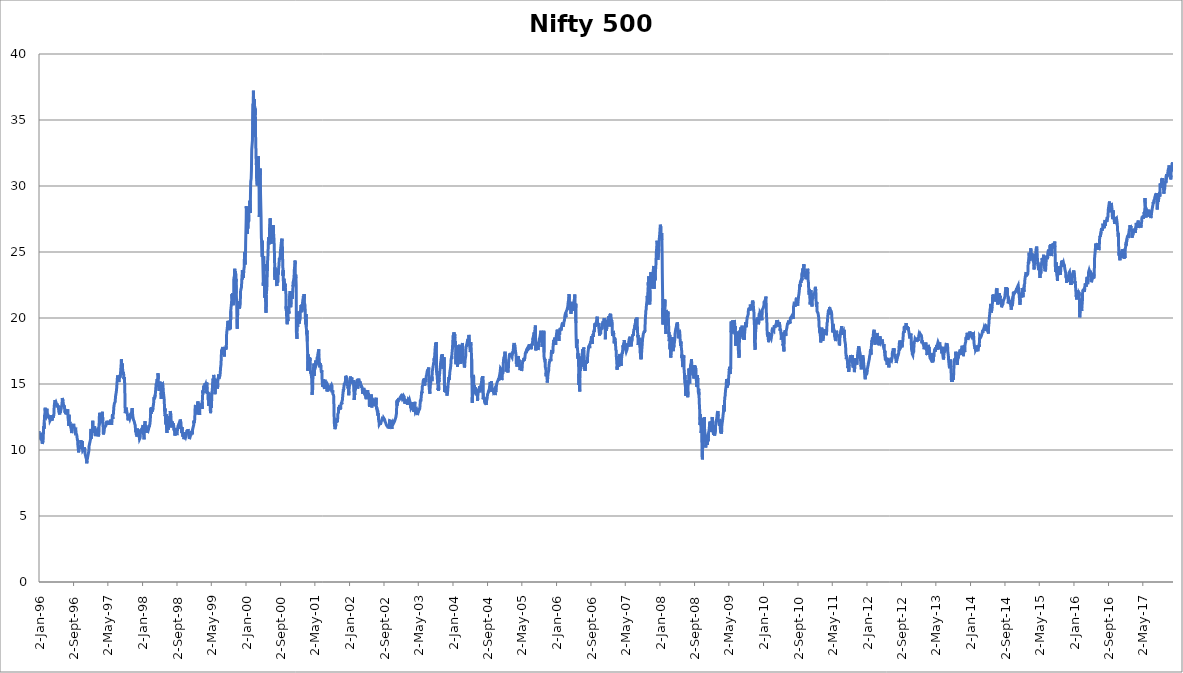
| Category | Nifty 500 P/E |
|---|---|
| 1996-01-02 | 11.43 |
| 1996-01-03 | 11.37 |
| 1996-01-04 | 11.3 |
| 1996-01-05 | 11.23 |
| 1996-01-08 | 11.07 |
| 1996-01-09 | 11.01 |
| 1996-01-10 | 10.98 |
| 1996-01-11 | 11.03 |
| 1996-01-12 | 11.05 |
| 1996-01-15 | 11.06 |
| 1996-01-16 | 11.03 |
| 1996-01-17 | 10.9 |
| 1996-01-18 | 10.81 |
| 1996-01-19 | 10.75 |
| 1996-01-22 | 10.74 |
| 1996-01-23 | 10.64 |
| 1996-01-24 | 10.47 |
| 1996-01-25 | 10.45 |
| 1996-01-29 | 10.54 |
| 1996-01-30 | 10.67 |
| 1996-01-31 | 10.7 |
| 1996-02-01 | 10.98 |
| 1996-02-02 | 11.52 |
| 1996-02-05 | 11.8 |
| 1996-02-06 | 11.61 |
| 1996-02-07 | 11.64 |
| 1996-02-08 | 12.07 |
| 1996-02-09 | 12.56 |
| 1996-02-12 | 12.76 |
| 1996-02-13 | 12.92 |
| 1996-02-14 | 13.2 |
| 1996-02-15 | 13.13 |
| 1996-02-16 | 12.93 |
| 1996-02-19 | 12.97 |
| 1996-02-20 | 12.84 |
| 1996-02-22 | 12.99 |
| 1996-02-23 | 12.97 |
| 1996-02-26 | 13.13 |
| 1996-02-27 | 13.08 |
| 1996-02-28 | 12.86 |
| 1996-02-29 | 12.61 |
| 1996-03-01 | 12.63 |
| 1996-03-04 | 12.69 |
| 1996-03-06 | 12.74 |
| 1996-03-07 | 12.68 |
| 1996-03-08 | 12.6 |
| 1996-03-11 | 12.41 |
| 1996-03-12 | 12.36 |
| 1996-03-13 | 12.53 |
| 1996-03-14 | 12.56 |
| 1996-03-15 | 12.47 |
| 1996-03-18 | 12.33 |
| 1996-03-19 | 12.22 |
| 1996-03-21 | 12.29 |
| 1996-03-22 | 12.22 |
| 1996-03-25 | 12.22 |
| 1996-03-26 | 12.22 |
| 1996-03-27 | 12.39 |
| 1996-03-29 | 12.64 |
| 1996-04-02 | 12.24 |
| 1996-04-03 | 12.3 |
| 1996-04-04 | 12.27 |
| 1996-04-05 | 12.39 |
| 1996-04-08 | 12.53 |
| 1996-04-09 | 12.51 |
| 1996-04-10 | 12.44 |
| 1996-04-11 | 12.4 |
| 1996-04-12 | 12.47 |
| 1996-04-15 | 12.66 |
| 1996-04-16 | 12.77 |
| 1996-04-17 | 13.11 |
| 1996-04-18 | 13.34 |
| 1996-04-22 | 13.3 |
| 1996-04-23 | 13.3 |
| 1996-04-24 | 13.78 |
| 1996-04-25 | 13.75 |
| 1996-04-26 | 13.54 |
| 1996-04-30 | 13.63 |
| 1996-05-02 | 13.67 |
| 1996-05-03 | 13.54 |
| 1996-05-06 | 13.34 |
| 1996-05-08 | 13.51 |
| 1996-05-09 | 13.32 |
| 1996-05-10 | 13.23 |
| 1996-05-13 | 13.35 |
| 1996-05-14 | 13.26 |
| 1996-05-15 | 13.25 |
| 1996-05-16 | 13.37 |
| 1996-05-17 | 13.23 |
| 1996-05-20 | 12.98 |
| 1996-05-21 | 12.86 |
| 1996-05-22 | 12.87 |
| 1996-05-23 | 12.83 |
| 1996-05-24 | 12.88 |
| 1996-05-27 | 12.69 |
| 1996-05-28 | 12.62 |
| 1996-05-29 | 12.94 |
| 1996-05-30 | 12.83 |
| 1996-05-31 | 12.79 |
| 1996-06-03 | 12.99 |
| 1996-06-04 | 12.96 |
| 1996-06-05 | 13 |
| 1996-06-06 | 13.11 |
| 1996-06-07 | 13.24 |
| 1996-06-10 | 13.36 |
| 1996-06-11 | 13.39 |
| 1996-06-12 | 13.52 |
| 1996-06-13 | 13.68 |
| 1996-06-14 | 13.94 |
| 1996-06-17 | 14 |
| 1996-06-18 | 13.98 |
| 1996-06-19 | 13.73 |
| 1996-06-20 | 13.72 |
| 1996-06-21 | 13.5 |
| 1996-06-24 | 13.54 |
| 1996-06-25 | 13.36 |
| 1996-06-26 | 13.24 |
| 1996-06-27 | 13.36 |
| 1996-06-28 | 13.3 |
| 1996-07-01 | 13.12 |
| 1996-07-02 | 13.05 |
| 1996-07-03 | 12.82 |
| 1996-07-04 | 12.88 |
| 1996-07-05 | 12.93 |
| 1996-07-08 | 12.99 |
| 1996-07-09 | 12.73 |
| 1996-07-10 | 12.78 |
| 1996-07-11 | 12.87 |
| 1996-07-12 | 12.79 |
| 1996-07-15 | 12.82 |
| 1996-07-16 | 12.7 |
| 1996-07-17 | 12.87 |
| 1996-07-18 | 12.94 |
| 1996-07-19 | 12.92 |
| 1996-07-22 | 13.09 |
| 1996-07-23 | 12.69 |
| 1996-07-24 | 12.49 |
| 1996-07-25 | 12.43 |
| 1996-07-26 | 12.3 |
| 1996-07-29 | 12.03 |
| 1996-07-30 | 11.83 |
| 1996-07-31 | 12.67 |
| 1996-08-01 | 12.14 |
| 1996-08-02 | 12.07 |
| 1996-08-05 | 12.02 |
| 1996-08-06 | 11.99 |
| 1996-08-07 | 12.12 |
| 1996-08-08 | 12.05 |
| 1996-08-09 | 12.02 |
| 1996-08-12 | 11.9 |
| 1996-08-13 | 11.83 |
| 1996-08-14 | 11.72 |
| 1996-08-16 | 11.57 |
| 1996-08-19 | 11.28 |
| 1996-08-20 | 11.28 |
| 1996-08-21 | 11.5 |
| 1996-08-22 | 11.55 |
| 1996-08-23 | 11.67 |
| 1996-08-26 | 11.67 |
| 1996-08-27 | 11.69 |
| 1996-08-29 | 11.87 |
| 1996-08-30 | 11.87 |
| 1996-09-02 | 11.98 |
| 1996-09-03 | 11.82 |
| 1996-09-04 | 11.86 |
| 1996-09-06 | 11.87 |
| 1996-09-09 | 11.75 |
| 1996-09-10 | 11.63 |
| 1996-09-11 | 11.49 |
| 1996-09-12 | 11.48 |
| 1996-09-13 | 11.36 |
| 1996-09-18 | 11.44 |
| 1996-09-19 | 11.29 |
| 1996-09-20 | 11.26 |
| 1996-09-23 | 11.17 |
| 1996-09-24 | 11.15 |
| 1996-09-25 | 11.14 |
| 1996-09-26 | 11.01 |
| 1996-09-27 | 10.85 |
| 1996-09-30 | 10.73 |
| 1996-10-01 | 10.47 |
| 1996-10-03 | 10.41 |
| 1996-10-04 | 10.16 |
| 1996-10-07 | 9.82 |
| 1996-10-08 | 9.84 |
| 1996-10-09 | 9.89 |
| 1996-10-10 | 10.2 |
| 1996-10-11 | 10.34 |
| 1996-10-14 | 10.15 |
| 1996-10-15 | 10.15 |
| 1996-10-16 | 10.12 |
| 1996-10-17 | 10.12 |
| 1996-10-18 | 10.22 |
| 1996-10-22 | 10.22 |
| 1996-10-23 | 10.75 |
| 1996-10-24 | 10.53 |
| 1996-10-25 | 10.51 |
| 1996-10-28 | 10.53 |
| 1996-10-29 | 10.44 |
| 1996-10-30 | 10.28 |
| 1996-10-31 | 10.22 |
| 1996-11-01 | 10.68 |
| 1996-11-04 | 10.02 |
| 1996-11-05 | 9.93 |
| 1996-11-06 | 9.93 |
| 1996-11-07 | 9.98 |
| 1996-11-10 | 9.96 |
| 1996-11-13 | 10.04 |
| 1996-11-14 | 10.03 |
| 1996-11-15 | 10.08 |
| 1996-11-18 | 10.2 |
| 1996-11-19 | 10.14 |
| 1996-11-20 | 9.97 |
| 1996-11-21 | 9.9 |
| 1996-11-22 | 9.71 |
| 1996-11-25 | 9.74 |
| 1996-11-26 | 9.66 |
| 1996-11-27 | 9.47 |
| 1996-11-28 | 9.44 |
| 1996-11-29 | 9.4 |
| 1996-12-02 | 9.27 |
| 1996-12-03 | 9.12 |
| 1996-12-04 | 8.99 |
| 1996-12-05 | 9.16 |
| 1996-12-06 | 9.23 |
| 1996-12-09 | 9.21 |
| 1996-12-10 | 9.19 |
| 1996-12-11 | 9.11 |
| 1996-12-12 | 9.57 |
| 1996-12-13 | 9.59 |
| 1996-12-16 | 9.59 |
| 1996-12-17 | 9.85 |
| 1996-12-18 | 9.94 |
| 1996-12-19 | 10.03 |
| 1996-12-20 | 10.3 |
| 1996-12-23 | 10.31 |
| 1996-12-24 | 10.31 |
| 1997-01-01 | 10.91 |
| 1997-01-02 | 11.6 |
| 1997-01-03 | 10.87 |
| 1997-01-06 | 10.97 |
| 1997-01-07 | 10.98 |
| 1997-01-08 | 11.22 |
| 1997-01-09 | 11.25 |
| 1997-01-10 | 11.46 |
| 1997-01-13 | 11.61 |
| 1997-01-14 | 11.72 |
| 1997-01-15 | 12.22 |
| 1997-01-16 | 11.71 |
| 1997-01-17 | 11.49 |
| 1997-01-20 | 11.37 |
| 1997-01-21 | 11.29 |
| 1997-01-22 | 11.4 |
| 1997-01-24 | 11.39 |
| 1997-01-27 | 11.72 |
| 1997-01-28 | 11.8 |
| 1997-01-29 | 11.64 |
| 1997-01-30 | 11.56 |
| 1997-01-31 | 11.2 |
| 1997-02-03 | 11.05 |
| 1997-02-04 | 11.01 |
| 1997-02-05 | 11.12 |
| 1997-02-06 | 11.21 |
| 1997-02-07 | 11.22 |
| 1997-02-10 | 11.25 |
| 1997-02-11 | 11.48 |
| 1997-02-12 | 11.45 |
| 1997-02-13 | 11.49 |
| 1997-02-14 | 11.52 |
| 1997-02-17 | 11.56 |
| 1997-02-18 | 11.54 |
| 1997-02-19 | 11.51 |
| 1997-02-20 | 11.44 |
| 1997-02-21 | 11.26 |
| 1997-02-24 | 11.03 |
| 1997-02-25 | 11.01 |
| 1997-02-26 | 11.04 |
| 1997-02-27 | 11.24 |
| 1997-02-28 | 11.88 |
| 1997-03-01 | 12.03 |
| 1997-03-03 | 12.67 |
| 1997-03-04 | 12.82 |
| 1997-03-05 | 12.84 |
| 1997-03-06 | 12.65 |
| 1997-03-10 | 12.35 |
| 1997-03-11 | 12.19 |
| 1997-03-12 | 12.3 |
| 1997-03-13 | 12.27 |
| 1997-03-14 | 12.19 |
| 1997-03-17 | 12.27 |
| 1997-03-18 | 12.25 |
| 1997-03-19 | 12.08 |
| 1997-03-20 | 12.16 |
| 1997-03-21 | 12.18 |
| 1997-03-25 | 12.89 |
| 1997-03-26 | 12.22 |
| 1997-03-27 | 12.23 |
| 1997-03-28 | 12.07 |
| 1997-03-31 | 11.18 |
| 1997-04-01 | 11.35 |
| 1997-04-02 | 11.72 |
| 1997-04-03 | 11.79 |
| 1997-04-04 | 11.73 |
| 1997-04-07 | 11.62 |
| 1997-04-09 | 11.85 |
| 1997-04-10 | 11.73 |
| 1997-04-11 | 11.79 |
| 1997-04-12 | 11.67 |
| 1997-04-15 | 11.71 |
| 1997-04-17 | 11.84 |
| 1997-04-21 | 12.11 |
| 1997-04-22 | 12.11 |
| 1997-04-23 | 12.08 |
| 1997-04-24 | 12.01 |
| 1997-04-25 | 12.21 |
| 1997-04-28 | 12.09 |
| 1997-04-29 | 12.05 |
| 1997-04-30 | 12.15 |
| 1997-05-02 | 12.01 |
| 1997-05-05 | 11.9 |
| 1997-05-06 | 12.01 |
| 1997-05-07 | 11.97 |
| 1997-05-09 | 12.01 |
| 1997-05-12 | 12.04 |
| 1997-05-13 | 11.98 |
| 1997-05-14 | 12.11 |
| 1997-05-15 | 12.14 |
| 1997-05-16 | 12.04 |
| 1997-05-19 | 12.21 |
| 1997-05-20 | 12.19 |
| 1997-05-21 | 12.3 |
| 1997-05-22 | 12.11 |
| 1997-05-23 | 12.04 |
| 1997-05-26 | 11.99 |
| 1997-05-27 | 11.93 |
| 1997-05-28 | 11.91 |
| 1997-05-29 | 11.99 |
| 1997-05-30 | 12.11 |
| 1997-06-02 | 12.04 |
| 1997-06-03 | 12.71 |
| 1997-06-04 | 12.78 |
| 1997-06-05 | 12.35 |
| 1997-06-06 | 12.65 |
| 1997-06-09 | 12.66 |
| 1997-06-10 | 12.74 |
| 1997-06-11 | 12.94 |
| 1997-06-12 | 13.19 |
| 1997-06-13 | 13.27 |
| 1997-06-16 | 13.31 |
| 1997-06-17 | 13.55 |
| 1997-06-18 | 13.57 |
| 1997-06-19 | 13.57 |
| 1997-06-20 | 13.58 |
| 1997-06-23 | 13.67 |
| 1997-06-24 | 14.02 |
| 1997-06-25 | 13.98 |
| 1997-06-26 | 14.01 |
| 1997-06-27 | 14 |
| 1997-06-30 | 14.4 |
| 1997-07-01 | 14.48 |
| 1997-07-02 | 14.6 |
| 1997-07-03 | 14.55 |
| 1997-07-04 | 14.55 |
| 1997-07-07 | 14.59 |
| 1997-07-08 | 14.67 |
| 1997-07-09 | 15.65 |
| 1997-07-10 | 15.65 |
| 1997-07-11 | 15.72 |
| 1997-07-14 | 15.46 |
| 1997-07-15 | 15.45 |
| 1997-07-16 | 15.38 |
| 1997-07-17 | 15.4 |
| 1997-07-18 | 15.16 |
| 1997-07-21 | 15.26 |
| 1997-07-22 | 15.42 |
| 1997-07-23 | 15.67 |
| 1997-07-24 | 15.63 |
| 1997-07-25 | 15.48 |
| 1997-07-28 | 15.54 |
| 1997-07-29 | 15.71 |
| 1997-07-30 | 15.78 |
| 1997-07-31 | 16 |
| 1997-08-01 | 16.14 |
| 1997-08-04 | 16.6 |
| 1997-08-05 | 16.88 |
| 1997-08-06 | 16.77 |
| 1997-08-07 | 16.5 |
| 1997-08-08 | 16.29 |
| 1997-08-11 | 16.55 |
| 1997-08-12 | 16.47 |
| 1997-08-13 | 16.28 |
| 1997-08-14 | 16.1 |
| 1997-08-19 | 15.68 |
| 1997-08-20 | 15.88 |
| 1997-08-21 | 15.7 |
| 1997-08-22 | 15.37 |
| 1997-08-26 | 15.53 |
| 1997-08-27 | 15.53 |
| 1997-08-28 | 15.07 |
| 1997-08-29 | 14.71 |
| 1997-09-01 | 12.79 |
| 1997-09-02 | 12.8 |
| 1997-09-03 | 12.85 |
| 1997-09-04 | 12.95 |
| 1997-09-05 | 13 |
| 1997-09-08 | 13.21 |
| 1997-09-09 | 13.08 |
| 1997-09-10 | 13.1 |
| 1997-09-11 | 13 |
| 1997-09-12 | 12.92 |
| 1997-09-15 | 12.96 |
| 1997-09-16 | 12.92 |
| 1997-09-17 | 12.69 |
| 1997-09-18 | 12.56 |
| 1997-09-19 | 12.38 |
| 1997-09-22 | 12.25 |
| 1997-09-23 | 12.36 |
| 1997-09-24 | 12.5 |
| 1997-09-25 | 12.37 |
| 1997-09-26 | 12.59 |
| 1997-09-29 | 12.61 |
| 1997-09-30 | 12.52 |
| 1997-10-01 | 12.53 |
| 1997-10-03 | 12.36 |
| 1997-10-06 | 12.39 |
| 1997-10-07 | 12.51 |
| 1997-10-08 | 12.56 |
| 1997-10-09 | 12.69 |
| 1997-10-10 | 12.81 |
| 1997-10-13 | 12.86 |
| 1997-10-14 | 12.71 |
| 1997-10-15 | 12.77 |
| 1997-10-16 | 12.89 |
| 1997-10-17 | 12.99 |
| 1997-10-20 | 13.17 |
| 1997-10-21 | 13.05 |
| 1997-10-22 | 12.96 |
| 1997-10-23 | 12.77 |
| 1997-10-24 | 12.58 |
| 1997-10-27 | 12.54 |
| 1997-10-30 | 12.26 |
| 1997-11-03 | 12.18 |
| 1997-11-04 | 12.18 |
| 1997-11-05 | 12.1 |
| 1997-11-06 | 12.04 |
| 1997-11-07 | 11.98 |
| 1997-11-10 | 11.9 |
| 1997-11-11 | 11.88 |
| 1997-11-12 | 11.66 |
| 1997-11-13 | 11.4 |
| 1997-11-14 | 11.39 |
| 1997-11-17 | 11.43 |
| 1997-11-18 | 11.27 |
| 1997-11-19 | 11.12 |
| 1997-11-20 | 11.16 |
| 1997-11-21 | 11.31 |
| 1997-11-24 | 11.02 |
| 1997-11-25 | 11.2 |
| 1997-11-26 | 11.38 |
| 1997-11-27 | 11.63 |
| 1997-11-28 | 11.42 |
| 1997-12-01 | 11.55 |
| 1997-12-02 | 11.51 |
| 1997-12-03 | 11.53 |
| 1997-12-04 | 11.41 |
| 1997-12-05 | 11.23 |
| 1997-12-08 | 11.21 |
| 1997-12-09 | 11.02 |
| 1997-12-10 | 10.91 |
| 1997-12-11 | 10.82 |
| 1997-12-12 | 10.81 |
| 1997-12-15 | 10.91 |
| 1997-12-16 | 11.06 |
| 1997-12-17 | 11.24 |
| 1997-12-18 | 11.21 |
| 1997-12-19 | 11.36 |
| 1997-12-22 | 11.39 |
| 1997-12-23 | 11.44 |
| 1997-12-24 | 11.38 |
| 1997-12-26 | 11.44 |
| 1997-12-29 | 11.65 |
| 1997-12-30 | 11.49 |
| 1997-12-31 | 11.53 |
| 1998-01-01 | 11.68 |
| 1998-01-02 | 11.78 |
| 1998-01-05 | 11.88 |
| 1998-01-06 | 11.79 |
| 1998-01-07 | 11.7 |
| 1998-01-08 | 11.44 |
| 1998-01-09 | 11.15 |
| 1998-01-12 | 10.81 |
| 1998-01-13 | 10.91 |
| 1998-01-14 | 10.85 |
| 1998-01-15 | 11.89 |
| 1998-01-16 | 11.94 |
| 1998-01-19 | 12.18 |
| 1998-01-20 | 12.08 |
| 1998-01-21 | 11.98 |
| 1998-01-22 | 11.84 |
| 1998-01-23 | 11.73 |
| 1998-01-27 | 11.49 |
| 1998-01-28 | 11.31 |
| 1998-01-29 | 11.29 |
| 1998-02-02 | 11.72 |
| 1998-02-03 | 11.68 |
| 1998-02-04 | 11.57 |
| 1998-02-05 | 11.64 |
| 1998-02-06 | 11.62 |
| 1998-02-09 | 11.56 |
| 1998-02-10 | 11.47 |
| 1998-02-11 | 11.41 |
| 1998-02-12 | 11.42 |
| 1998-02-13 | 11.58 |
| 1998-02-16 | 11.87 |
| 1998-02-17 | 11.75 |
| 1998-02-18 | 11.73 |
| 1998-02-19 | 11.84 |
| 1998-02-20 | 11.8 |
| 1998-02-23 | 12.01 |
| 1998-02-24 | 12.03 |
| 1998-02-26 | 12.46 |
| 1998-02-27 | 12.66 |
| 1998-03-02 | 13.2 |
| 1998-03-03 | 12.75 |
| 1998-03-04 | 13.08 |
| 1998-03-05 | 12.97 |
| 1998-03-06 | 12.94 |
| 1998-03-09 | 13.25 |
| 1998-03-10 | 13.19 |
| 1998-03-11 | 13.03 |
| 1998-03-12 | 12.92 |
| 1998-03-16 | 13.2 |
| 1998-03-17 | 13.21 |
| 1998-03-18 | 13.37 |
| 1998-03-19 | 13.38 |
| 1998-03-20 | 13.46 |
| 1998-03-23 | 14 |
| 1998-03-24 | 13.93 |
| 1998-03-25 | 14.07 |
| 1998-03-26 | 13.85 |
| 1998-03-27 | 13.91 |
| 1998-03-30 | 13.91 |
| 1998-03-31 | 13.85 |
| 1998-04-01 | 14.18 |
| 1998-04-02 | 14.23 |
| 1998-04-03 | 14.4 |
| 1998-04-06 | 14.82 |
| 1998-04-07 | 14.98 |
| 1998-04-08 | 15.02 |
| 1998-04-10 | 15.08 |
| 1998-04-13 | 14.84 |
| 1998-04-15 | 15.38 |
| 1998-04-16 | 15.13 |
| 1998-04-17 | 15.27 |
| 1998-04-20 | 15.48 |
| 1998-04-21 | 15.81 |
| 1998-04-22 | 15.37 |
| 1998-04-23 | 15.02 |
| 1998-04-24 | 14.76 |
| 1998-04-27 | 14.87 |
| 1998-04-29 | 14.47 |
| 1998-04-30 | 14.65 |
| 1998-05-04 | 15.18 |
| 1998-05-05 | 15.25 |
| 1998-05-06 | 14.93 |
| 1998-05-08 | 14.75 |
| 1998-05-12 | 14.49 |
| 1998-05-13 | 13.87 |
| 1998-05-14 | 14.32 |
| 1998-05-15 | 14.15 |
| 1998-05-18 | 14.75 |
| 1998-05-19 | 14.87 |
| 1998-05-20 | 15.11 |
| 1998-05-21 | 14.83 |
| 1998-05-22 | 14.79 |
| 1998-05-25 | 14.91 |
| 1998-05-26 | 14.83 |
| 1998-05-27 | 14.62 |
| 1998-05-28 | 14.44 |
| 1998-05-29 | 14.32 |
| 1998-06-01 | 14.32 |
| 1998-06-02 | 13.94 |
| 1998-06-03 | 13.93 |
| 1998-06-04 | 13.76 |
| 1998-06-05 | 13.15 |
| 1998-06-08 | 12.93 |
| 1998-06-09 | 13.14 |
| 1998-06-10 | 12.56 |
| 1998-06-11 | 12.65 |
| 1998-06-12 | 12.71 |
| 1998-06-15 | 12.02 |
| 1998-06-16 | 11.93 |
| 1998-06-17 | 12.71 |
| 1998-06-18 | 12.37 |
| 1998-06-19 | 11.83 |
| 1998-06-22 | 11.42 |
| 1998-06-23 | 11.29 |
| 1998-06-24 | 11.74 |
| 1998-06-25 | 11.95 |
| 1998-06-26 | 11.87 |
| 1998-06-29 | 12.33 |
| 1998-06-30 | 12.2 |
| 1998-07-01 | 12.04 |
| 1998-07-02 | 11.89 |
| 1998-07-03 | 11.55 |
| 1998-07-06 | 11.88 |
| 1998-07-07 | 12.01 |
| 1998-07-08 | 12.16 |
| 1998-07-09 | 12.37 |
| 1998-07-10 | 12.56 |
| 1998-07-13 | 12.4 |
| 1998-07-14 | 12.55 |
| 1998-07-15 | 12.58 |
| 1998-07-16 | 12.95 |
| 1998-07-17 | 12.88 |
| 1998-07-20 | 12.64 |
| 1998-07-21 | 12.53 |
| 1998-07-22 | 12.49 |
| 1998-07-23 | 12.1 |
| 1998-07-24 | 11.92 |
| 1998-07-27 | 11.71 |
| 1998-07-28 | 11.99 |
| 1998-07-29 | 12.16 |
| 1998-07-30 | 12.16 |
| 1998-07-31 | 12.15 |
| 1998-08-03 | 11.92 |
| 1998-08-04 | 11.91 |
| 1998-08-05 | 12.02 |
| 1998-08-06 | 11.95 |
| 1998-08-07 | 11.93 |
| 1998-08-10 | 11.81 |
| 1998-08-11 | 11.66 |
| 1998-08-12 | 11.55 |
| 1998-08-13 | 11.66 |
| 1998-08-14 | 11.44 |
| 1998-08-17 | 11.31 |
| 1998-08-18 | 11.09 |
| 1998-08-19 | 11.21 |
| 1998-08-20 | 11.54 |
| 1998-08-21 | 11.4 |
| 1998-08-24 | 11.46 |
| 1998-08-25 | 11.62 |
| 1998-08-27 | 11.65 |
| 1998-08-28 | 11.38 |
| 1998-08-31 | 11.42 |
| 1998-09-01 | 11.13 |
| 1998-09-02 | 11.25 |
| 1998-09-03 | 11.3 |
| 1998-09-04 | 11.44 |
| 1998-09-07 | 11.68 |
| 1998-09-08 | 11.79 |
| 1998-09-09 | 11.85 |
| 1998-09-10 | 11.84 |
| 1998-09-11 | 11.72 |
| 1998-09-14 | 11.96 |
| 1998-09-15 | 11.99 |
| 1998-09-16 | 11.96 |
| 1998-09-17 | 11.94 |
| 1998-09-18 | 11.87 |
| 1998-09-21 | 11.86 |
| 1998-09-22 | 11.86 |
| 1998-09-23 | 12.06 |
| 1998-09-24 | 12.31 |
| 1998-09-25 | 12.32 |
| 1998-09-28 | 12.3 |
| 1998-09-29 | 12.05 |
| 1998-09-30 | 12.07 |
| 1998-10-05 | 11.28 |
| 1998-10-06 | 11.35 |
| 1998-10-07 | 11.73 |
| 1998-10-08 | 11.39 |
| 1998-10-09 | 11.44 |
| 1998-10-12 | 11.24 |
| 1998-10-13 | 11.01 |
| 1998-10-14 | 11.28 |
| 1998-10-15 | 11.21 |
| 1998-10-16 | 11.22 |
| 1998-10-19 | 11.11 |
| 1998-10-20 | 10.82 |
| 1998-10-22 | 10.9 |
| 1998-10-23 | 10.93 |
| 1998-10-26 | 11.36 |
| 1998-10-27 | 11.33 |
| 1998-10-28 | 11.19 |
| 1998-10-29 | 11.2 |
| 1998-10-30 | 11.07 |
| 1998-10-31 | 11.04 |
| 1998-11-02 | 10.99 |
| 1998-11-03 | 10.94 |
| 1998-11-05 | 11.04 |
| 1998-11-06 | 11.14 |
| 1998-11-09 | 11.4 |
| 1998-11-10 | 11.47 |
| 1998-11-11 | 11.44 |
| 1998-11-12 | 11.5 |
| 1998-11-13 | 11.42 |
| 1998-11-16 | 11.3 |
| 1998-11-17 | 11.38 |
| 1998-11-18 | 11.59 |
| 1998-11-19 | 11.48 |
| 1998-11-20 | 11.4 |
| 1998-11-21 | 11.4 |
| 1998-11-23 | 11.26 |
| 1998-11-24 | 11.19 |
| 1998-11-26 | 10.97 |
| 1998-11-27 | 10.83 |
| 1998-11-28 | 10.81 |
| 1998-11-30 | 10.9 |
| 1998-12-01 | 10.88 |
| 1998-12-02 | 10.95 |
| 1998-12-03 | 10.91 |
| 1998-12-04 | 11.02 |
| 1998-12-07 | 11.22 |
| 1998-12-08 | 11.29 |
| 1998-12-09 | 11.32 |
| 1998-12-10 | 11.38 |
| 1998-12-11 | 11.45 |
| 1998-12-14 | 11.36 |
| 1998-12-15 | 11.36 |
| 1998-12-16 | 11.44 |
| 1998-12-17 | 11.19 |
| 1998-12-18 | 11.26 |
| 1998-12-21 | 11.58 |
| 1998-12-22 | 11.53 |
| 1998-12-23 | 11.57 |
| 1998-12-24 | 11.6 |
| 1998-12-28 | 11.88 |
| 1998-12-29 | 11.84 |
| 1998-12-30 | 12.23 |
| 1998-12-31 | 12.04 |
| 1999-01-01 | 12.14 |
| 1999-01-04 | 12.26 |
| 1999-01-05 | 12.4 |
| 1999-01-06 | 12.69 |
| 1999-01-07 | 12.95 |
| 1999-01-08 | 13.33 |
| 1999-01-11 | 13.41 |
| 1999-01-12 | 13.15 |
| 1999-01-13 | 13.2 |
| 1999-01-14 | 13.14 |
| 1999-01-15 | 12.88 |
| 1999-01-18 | 12.97 |
| 1999-01-19 | 12.7 |
| 1999-01-21 | 13.4 |
| 1999-01-22 | 13.33 |
| 1999-01-25 | 13.27 |
| 1999-01-27 | 13.67 |
| 1999-01-28 | 13.4 |
| 1999-01-29 | 13.47 |
| 1999-02-01 | 13.1 |
| 1999-02-02 | 12.9 |
| 1999-02-03 | 13.13 |
| 1999-02-04 | 12.95 |
| 1999-02-05 | 12.89 |
| 1999-02-08 | 12.66 |
| 1999-02-09 | 12.74 |
| 1999-02-10 | 13.19 |
| 1999-02-11 | 13.24 |
| 1999-02-12 | 13.39 |
| 1999-02-15 | 13.2 |
| 1999-02-16 | 13.31 |
| 1999-02-17 | 13.53 |
| 1999-02-18 | 13.56 |
| 1999-02-19 | 13.57 |
| 1999-02-22 | 13.22 |
| 1999-02-23 | 13.12 |
| 1999-02-24 | 13.31 |
| 1999-02-25 | 13.29 |
| 1999-02-26 | 13.13 |
| 1999-02-27 | 13.66 |
| 1999-03-01 | 14.07 |
| 1999-03-03 | 14.51 |
| 1999-03-04 | 14.3 |
| 1999-03-05 | 14.47 |
| 1999-03-08 | 14.61 |
| 1999-03-09 | 14.68 |
| 1999-03-10 | 14.87 |
| 1999-03-11 | 14.56 |
| 1999-03-12 | 14.77 |
| 1999-03-15 | 14.85 |
| 1999-03-16 | 14.65 |
| 1999-03-17 | 14.77 |
| 1999-03-18 | 15.05 |
| 1999-03-19 | 14.88 |
| 1999-03-20 | 14.89 |
| 1999-03-22 | 14.94 |
| 1999-03-23 | 14.99 |
| 1999-03-24 | 14.95 |
| 1999-03-25 | 14.87 |
| 1999-03-26 | 14.6 |
| 1999-03-30 | 14.68 |
| 1999-03-31 | 15.11 |
| 1999-04-01 | 15 |
| 1999-04-05 | 14.25 |
| 1999-04-06 | 14.29 |
| 1999-04-07 | 14.4 |
| 1999-04-08 | 14.25 |
| 1999-04-09 | 13.84 |
| 1999-04-12 | 13.84 |
| 1999-04-13 | 13.73 |
| 1999-04-15 | 13.33 |
| 1999-04-16 | 14.34 |
| 1999-04-17 | 13.33 |
| 1999-04-19 | 13.67 |
| 1999-04-20 | 13.7 |
| 1999-04-21 | 13.81 |
| 1999-04-22 | 13.58 |
| 1999-04-23 | 13.55 |
| 1999-04-26 | 12.79 |
| 1999-04-28 | 12.95 |
| 1999-04-29 | 13.29 |
| 1999-04-30 | 13.55 |
| 1999-05-03 | 13.21 |
| 1999-05-04 | 13.74 |
| 1999-05-05 | 13.96 |
| 1999-05-06 | 14.22 |
| 1999-05-07 | 14.41 |
| 1999-05-10 | 14.77 |
| 1999-05-11 | 14.99 |
| 1999-05-12 | 14.79 |
| 1999-05-13 | 15.22 |
| 1999-05-14 | 15.41 |
| 1999-05-17 | 15.19 |
| 1999-05-18 | 15.31 |
| 1999-05-19 | 15.69 |
| 1999-05-20 | 15.59 |
| 1999-05-21 | 15.29 |
| 1999-05-24 | 15.31 |
| 1999-05-25 | 15.41 |
| 1999-05-26 | 14.92 |
| 1999-05-27 | 14.46 |
| 1999-05-28 | 14.23 |
| 1999-05-31 | 14.85 |
| 1999-06-01 | 14.71 |
| 1999-06-02 | 14.79 |
| 1999-06-03 | 14.95 |
| 1999-06-04 | 15.14 |
| 1999-06-07 | 15.15 |
| 1999-06-08 | 15.39 |
| 1999-06-09 | 15.27 |
| 1999-06-10 | 15.31 |
| 1999-06-11 | 15.06 |
| 1999-06-14 | 14.81 |
| 1999-06-15 | 14.65 |
| 1999-06-16 | 14.98 |
| 1999-06-17 | 15.25 |
| 1999-06-18 | 15.21 |
| 1999-06-21 | 15.55 |
| 1999-06-22 | 15.72 |
| 1999-06-23 | 15.51 |
| 1999-06-24 | 15.38 |
| 1999-06-25 | 15.37 |
| 1999-06-28 | 15.55 |
| 1999-06-29 | 15.55 |
| 1999-06-30 | 15.52 |
| 1999-07-01 | 15.48 |
| 1999-07-02 | 15.63 |
| 1999-07-05 | 16.04 |
| 1999-07-06 | 16.22 |
| 1999-07-07 | 16.28 |
| 1999-07-08 | 16.27 |
| 1999-07-09 | 16.48 |
| 1999-07-12 | 17.29 |
| 1999-07-13 | 17.32 |
| 1999-07-14 | 17.6 |
| 1999-07-15 | 17.26 |
| 1999-07-16 | 17.4 |
| 1999-07-19 | 17.74 |
| 1999-07-20 | 17.33 |
| 1999-07-21 | 17.67 |
| 1999-07-22 | 17.81 |
| 1999-07-23 | 17.66 |
| 1999-07-26 | 17.52 |
| 1999-07-27 | 17.37 |
| 1999-07-28 | 17.55 |
| 1999-07-29 | 17.53 |
| 1999-07-30 | 17.39 |
| 1999-08-02 | 17.08 |
| 1999-08-03 | 17.14 |
| 1999-08-04 | 17.66 |
| 1999-08-05 | 17.59 |
| 1999-08-06 | 17.59 |
| 1999-08-09 | 17.8 |
| 1999-08-10 | 17.63 |
| 1999-08-11 | 17.75 |
| 1999-08-12 | 17.78 |
| 1999-08-13 | 17.62 |
| 1999-08-16 | 17.93 |
| 1999-08-17 | 18.32 |
| 1999-08-18 | 18.87 |
| 1999-08-19 | 18.89 |
| 1999-08-20 | 19.01 |
| 1999-08-23 | 19.3 |
| 1999-08-24 | 19.5 |
| 1999-08-25 | 19.29 |
| 1999-08-26 | 19.66 |
| 1999-08-27 | 19.79 |
| 1999-08-30 | 19.76 |
| 1999-08-31 | 19.63 |
| 1999-09-01 | 19.52 |
| 1999-09-02 | 19.08 |
| 1999-09-03 | 19.09 |
| 1999-09-06 | 19.31 |
| 1999-09-07 | 19.21 |
| 1999-09-08 | 19.36 |
| 1999-09-09 | 19.32 |
| 1999-09-10 | 19.3 |
| 1999-09-14 | 19.15 |
| 1999-09-15 | 19.16 |
| 1999-09-16 | 20.51 |
| 1999-09-17 | 20.68 |
| 1999-09-20 | 20.69 |
| 1999-09-21 | 20.65 |
| 1999-09-22 | 21.22 |
| 1999-09-23 | 21.57 |
| 1999-09-24 | 21.81 |
| 1999-09-27 | 21.52 |
| 1999-09-28 | 21.35 |
| 1999-09-29 | 21.89 |
| 1999-09-30 | 21.76 |
| 1999-10-01 | 21.56 |
| 1999-10-04 | 20.97 |
| 1999-10-05 | 21.24 |
| 1999-10-06 | 21.54 |
| 1999-10-07 | 22.68 |
| 1999-10-08 | 22.98 |
| 1999-10-11 | 23 |
| 1999-10-12 | 23.23 |
| 1999-10-13 | 23.55 |
| 1999-10-14 | 23.73 |
| 1999-10-15 | 22.83 |
| 1999-10-18 | 22.99 |
| 1999-10-20 | 23.56 |
| 1999-10-21 | 23.02 |
| 1999-10-22 | 22.75 |
| 1999-10-23 | 22.97 |
| 1999-10-25 | 21.85 |
| 1999-10-26 | 21.92 |
| 1999-10-27 | 21.84 |
| 1999-10-28 | 21.03 |
| 1999-10-29 | 20.28 |
| 1999-11-01 | 19.18 |
| 1999-11-02 | 20.24 |
| 1999-11-03 | 20.14 |
| 1999-11-04 | 20.3 |
| 1999-11-05 | 20.74 |
| 1999-11-07 | 20.82 |
| 1999-11-09 | 20.94 |
| 1999-11-10 | 21.29 |
| 1999-11-11 | 21.04 |
| 1999-11-12 | 20.98 |
| 1999-11-15 | 20.8 |
| 1999-11-16 | 20.79 |
| 1999-11-17 | 20.71 |
| 1999-11-18 | 20.79 |
| 1999-11-19 | 20.85 |
| 1999-11-22 | 21.08 |
| 1999-11-24 | 21.96 |
| 1999-11-25 | 22.1 |
| 1999-11-26 | 22.1 |
| 1999-11-29 | 22.16 |
| 1999-11-30 | 22.14 |
| 1999-12-01 | 22.36 |
| 1999-12-02 | 22.71 |
| 1999-12-03 | 22.9 |
| 1999-12-06 | 23.43 |
| 1999-12-07 | 23.63 |
| 1999-12-08 | 22.93 |
| 1999-12-09 | 23.17 |
| 1999-12-10 | 23.28 |
| 1999-12-13 | 23.31 |
| 1999-12-14 | 23.13 |
| 1999-12-15 | 23.03 |
| 1999-12-16 | 23.52 |
| 1999-12-17 | 23.62 |
| 1999-12-20 | 23.88 |
| 1999-12-21 | 23.93 |
| 1999-12-22 | 24.91 |
| 1999-12-23 | 25.01 |
| 1999-12-24 | 24.6 |
| 1999-12-27 | 24.05 |
| 1999-12-28 | 24.37 |
| 1999-12-29 | 24.89 |
| 1999-12-30 | 25.68 |
| 2000-01-03 | 27.52 |
| 2000-01-04 | 28.46 |
| 2000-01-05 | 27.78 |
| 2000-01-06 | 27.84 |
| 2000-01-07 | 27.2 |
| 2000-01-10 | 27.35 |
| 2000-01-11 | 26.36 |
| 2000-01-12 | 27.07 |
| 2000-01-13 | 26.76 |
| 2000-01-14 | 26.75 |
| 2000-01-17 | 26.9 |
| 2000-01-18 | 26.85 |
| 2000-01-19 | 27.45 |
| 2000-01-20 | 27.26 |
| 2000-01-21 | 27.83 |
| 2000-01-24 | 27.86 |
| 2000-01-25 | 27.88 |
| 2000-01-27 | 28.41 |
| 2000-01-28 | 28.89 |
| 2000-01-31 | 27.96 |
| 2000-02-01 | 28.36 |
| 2000-02-02 | 29.24 |
| 2000-02-03 | 29.91 |
| 2000-02-04 | 30.35 |
| 2000-02-07 | 30.56 |
| 2000-02-08 | 30.55 |
| 2000-02-09 | 31.19 |
| 2000-02-10 | 32.05 |
| 2000-02-11 | 32.76 |
| 2000-02-14 | 32.8 |
| 2000-02-15 | 32.75 |
| 2000-02-16 | 33.45 |
| 2000-02-17 | 34.67 |
| 2000-02-18 | 35.11 |
| 2000-02-21 | 36.24 |
| 2000-02-22 | 34.66 |
| 2000-02-23 | 37.21 |
| 2000-02-24 | 37.26 |
| 2000-02-25 | 35.93 |
| 2000-02-28 | 35.97 |
| 2000-02-29 | 34.31 |
| 2000-03-01 | 36.12 |
| 2000-03-02 | 36.58 |
| 2000-03-03 | 35.38 |
| 2000-03-06 | 35.86 |
| 2000-03-07 | 35.35 |
| 2000-03-08 | 35.21 |
| 2000-03-09 | 34 |
| 2000-03-10 | 33.41 |
| 2000-03-13 | 32.08 |
| 2000-03-14 | 31.61 |
| 2000-03-15 | 31.69 |
| 2000-03-16 | 30.65 |
| 2000-03-21 | 30.04 |
| 2000-03-22 | 30.84 |
| 2000-03-23 | 30.79 |
| 2000-03-24 | 31.48 |
| 2000-03-27 | 31.7 |
| 2000-03-28 | 32.02 |
| 2000-03-29 | 32.26 |
| 2000-03-30 | 31.39 |
| 2000-03-31 | 30.57 |
| 2000-04-03 | 29.76 |
| 2000-04-04 | 27.66 |
| 2000-04-05 | 27.61 |
| 2000-04-06 | 27.85 |
| 2000-04-07 | 29.69 |
| 2000-04-10 | 31.06 |
| 2000-04-11 | 31.32 |
| 2000-04-12 | 30.84 |
| 2000-04-13 | 29.47 |
| 2000-04-17 | 27.65 |
| 2000-04-18 | 26.76 |
| 2000-04-19 | 26.06 |
| 2000-04-20 | 25.95 |
| 2000-04-24 | 24.98 |
| 2000-04-25 | 24.63 |
| 2000-04-26 | 25.86 |
| 2000-04-27 | 25.13 |
| 2000-04-28 | 24.71 |
| 2000-05-02 | 23.03 |
| 2000-05-03 | 22.44 |
| 2000-05-04 | 23.66 |
| 2000-05-05 | 24.67 |
| 2000-05-08 | 23.58 |
| 2000-05-09 | 24.08 |
| 2000-05-10 | 23.59 |
| 2000-05-11 | 22.39 |
| 2000-05-12 | 21.54 |
| 2000-05-15 | 21.76 |
| 2000-05-16 | 21.83 |
| 2000-05-17 | 21.98 |
| 2000-05-18 | 21.75 |
| 2000-05-19 | 21.26 |
| 2000-05-22 | 20.4 |
| 2000-05-23 | 20.44 |
| 2000-05-24 | 21.74 |
| 2000-05-25 | 21.95 |
| 2000-05-26 | 22.04 |
| 2000-05-29 | 22.54 |
| 2000-05-30 | 23.35 |
| 2000-05-31 | 24.03 |
| 2000-06-01 | 23.57 |
| 2000-06-02 | 24.31 |
| 2000-06-05 | 24.86 |
| 2000-06-06 | 25.34 |
| 2000-06-07 | 25.52 |
| 2000-06-08 | 26.11 |
| 2000-06-09 | 25.99 |
| 2000-06-12 | 25.57 |
| 2000-06-13 | 25.52 |
| 2000-06-14 | 25.82 |
| 2000-06-15 | 26.07 |
| 2000-06-16 | 26.81 |
| 2000-06-19 | 27.24 |
| 2000-06-20 | 27.55 |
| 2000-06-21 | 26.75 |
| 2000-06-22 | 26.35 |
| 2000-06-23 | 25.81 |
| 2000-06-26 | 25.7 |
| 2000-06-27 | 25.62 |
| 2000-06-28 | 25.98 |
| 2000-06-29 | 26.14 |
| 2000-06-30 | 25.99 |
| 2000-07-03 | 26.53 |
| 2000-07-04 | 26.74 |
| 2000-07-05 | 26.87 |
| 2000-07-06 | 26.67 |
| 2000-07-07 | 26.57 |
| 2000-07-10 | 26.42 |
| 2000-07-11 | 26.31 |
| 2000-07-12 | 27.03 |
| 2000-07-13 | 26.59 |
| 2000-07-14 | 26.44 |
| 2000-07-17 | 25.97 |
| 2000-07-18 | 25.7 |
| 2000-07-19 | 25.23 |
| 2000-07-20 | 25.02 |
| 2000-07-21 | 24.51 |
| 2000-07-24 | 22.89 |
| 2000-07-25 | 23.83 |
| 2000-07-26 | 23.1 |
| 2000-07-27 | 23.57 |
| 2000-07-28 | 23.5 |
| 2000-07-31 | 23.36 |
| 2000-08-01 | 23.17 |
| 2000-08-02 | 23.26 |
| 2000-08-03 | 22.95 |
| 2000-08-04 | 22.52 |
| 2000-08-07 | 22.43 |
| 2000-08-08 | 23.09 |
| 2000-08-09 | 23.3 |
| 2000-08-10 | 22.89 |
| 2000-08-11 | 22.67 |
| 2000-08-14 | 22.8 |
| 2000-08-16 | 23.48 |
| 2000-08-17 | 23.31 |
| 2000-08-18 | 23.67 |
| 2000-08-21 | 23.99 |
| 2000-08-22 | 24.18 |
| 2000-08-23 | 24.16 |
| 2000-08-24 | 24.53 |
| 2000-08-25 | 24.57 |
| 2000-08-28 | 24.39 |
| 2000-08-29 | 24.44 |
| 2000-08-30 | 24.67 |
| 2000-08-31 | 24.99 |
| 2000-09-04 | 25.42 |
| 2000-09-05 | 25.43 |
| 2000-09-06 | 25.63 |
| 2000-09-07 | 25.71 |
| 2000-09-08 | 25.9 |
| 2000-09-11 | 25.87 |
| 2000-09-12 | 26.01 |
| 2000-09-13 | 25.83 |
| 2000-09-14 | 25.66 |
| 2000-09-15 | 24.88 |
| 2000-09-18 | 23.75 |
| 2000-09-19 | 23.2 |
| 2000-09-20 | 23.62 |
| 2000-09-21 | 23.2 |
| 2000-09-22 | 22.07 |
| 2000-09-25 | 22.97 |
| 2000-09-26 | 22.43 |
| 2000-09-27 | 22.75 |
| 2000-09-28 | 22.28 |
| 2000-09-29 | 22.34 |
| 2000-10-03 | 22.38 |
| 2000-10-04 | 22.6 |
| 2000-10-05 | 22.32 |
| 2000-10-06 | 22.27 |
| 2000-10-09 | 21.85 |
| 2000-10-10 | 21.25 |
| 2000-10-11 | 20.7 |
| 2000-10-12 | 20.87 |
| 2000-10-13 | 20.28 |
| 2000-10-16 | 20.34 |
| 2000-10-17 | 19.91 |
| 2000-10-18 | 19.52 |
| 2000-10-19 | 20.3 |
| 2000-10-20 | 20.38 |
| 2000-10-23 | 19.76 |
| 2000-10-24 | 19.92 |
| 2000-10-25 | 20.54 |
| 2000-10-26 | 20.63 |
| 2000-10-27 | 20.61 |
| 2000-10-30 | 20.33 |
| 2000-10-31 | 20.54 |
| 2000-11-01 | 20.91 |
| 2000-11-02 | 21.22 |
| 2000-11-03 | 21.53 |
| 2000-11-06 | 21.48 |
| 2000-11-07 | 21.6 |
| 2000-11-08 | 22.04 |
| 2000-11-09 | 22 |
| 2000-11-10 | 21.53 |
| 2000-11-13 | 20.82 |
| 2000-11-14 | 21.49 |
| 2000-11-15 | 21.63 |
| 2000-11-16 | 21.52 |
| 2000-11-17 | 21.56 |
| 2000-11-20 | 21.71 |
| 2000-11-21 | 21.73 |
| 2000-11-22 | 21.45 |
| 2000-11-23 | 21.46 |
| 2000-11-24 | 21.61 |
| 2000-11-27 | 22.19 |
| 2000-11-28 | 22.35 |
| 2000-11-29 | 22.5 |
| 2000-11-30 | 22.4 |
| 2000-12-01 | 22.78 |
| 2000-12-04 | 22.72 |
| 2000-12-05 | 23.04 |
| 2000-12-06 | 23.23 |
| 2000-12-07 | 23.35 |
| 2000-12-08 | 23.69 |
| 2000-12-11 | 24.02 |
| 2000-12-12 | 24.03 |
| 2000-12-13 | 24.35 |
| 2000-12-14 | 24.07 |
| 2000-12-15 | 23.22 |
| 2000-12-18 | 23.3 |
| 2000-12-19 | 23 |
| 2000-12-20 | 22.75 |
| 2000-12-21 | 22.44 |
| 2000-12-22 | 18.96 |
| 2000-12-26 | 18.42 |
| 2000-12-27 | 18.87 |
| 2000-12-28 | 19.14 |
| 2000-12-29 | 19.43 |
| 2001-01-01 | 19.32 |
| 2001-01-02 | 19.63 |
| 2001-01-03 | 19.78 |
| 2001-01-04 | 20.16 |
| 2001-01-05 | 20.5 |
| 2001-01-08 | 20.02 |
| 2001-01-09 | 20.11 |
| 2001-01-10 | 19.85 |
| 2001-01-11 | 19.58 |
| 2001-01-12 | 19.69 |
| 2001-01-15 | 19.66 |
| 2001-01-16 | 19.7 |
| 2001-01-17 | 19.76 |
| 2001-01-18 | 19.97 |
| 2001-01-19 | 20.51 |
| 2001-01-22 | 20.68 |
| 2001-01-23 | 20.73 |
| 2001-01-24 | 20.97 |
| 2001-01-25 | 20.98 |
| 2001-01-29 | 20.44 |
| 2001-01-30 | 21.02 |
| 2001-01-31 | 20.89 |
| 2001-02-01 | 20.57 |
| 2001-02-02 | 20.97 |
| 2001-02-05 | 21.1 |
| 2001-02-06 | 21.22 |
| 2001-02-07 | 21.08 |
| 2001-02-08 | 21.49 |
| 2001-02-09 | 21.66 |
| 2001-02-12 | 21.72 |
| 2001-02-13 | 21.48 |
| 2001-02-14 | 21.54 |
| 2001-02-15 | 21.82 |
| 2001-02-16 | 21.2 |
| 2001-02-19 | 21.27 |
| 2001-02-20 | 21.21 |
| 2001-02-21 | 20.97 |
| 2001-02-22 | 20.67 |
| 2001-02-23 | 20 |
| 2001-02-26 | 19.94 |
| 2001-02-27 | 19.52 |
| 2001-02-28 | 20.3 |
| 2001-03-01 | 20.29 |
| 2001-03-02 | 19.33 |
| 2001-03-05 | 18.77 |
| 2001-03-07 | 19.05 |
| 2001-03-08 | 18.98 |
| 2001-03-09 | 18.22 |
| 2001-03-12 | 17.15 |
| 2001-03-13 | 16 |
| 2001-03-14 | 16.72 |
| 2001-03-15 | 17.26 |
| 2001-03-16 | 16.91 |
| 2001-03-19 | 16.85 |
| 2001-03-20 | 16.61 |
| 2001-03-21 | 17.04 |
| 2001-03-22 | 16.66 |
| 2001-03-23 | 16.29 |
| 2001-03-26 | 16.29 |
| 2001-03-27 | 16.54 |
| 2001-03-28 | 16.98 |
| 2001-03-29 | 16.74 |
| 2001-03-30 | 16.12 |
| 2001-04-02 | 15.8 |
| 2001-04-03 | 15.97 |
| 2001-04-04 | 15.8 |
| 2001-04-06 | 15.71 |
| 2001-04-09 | 15.67 |
| 2001-04-10 | 15.31 |
| 2001-04-11 | 14.69 |
| 2001-04-12 | 14.18 |
| 2001-04-16 | 14.58 |
| 2001-04-17 | 14.95 |
| 2001-04-18 | 15.64 |
| 2001-04-19 | 16 |
| 2001-04-20 | 16.13 |
| 2001-04-23 | 16.14 |
| 2001-04-24 | 16.34 |
| 2001-04-25 | 16.55 |
| 2001-04-26 | 16.34 |
| 2001-04-27 | 15.61 |
| 2001-04-30 | 16.08 |
| 2001-05-02 | 16.23 |
| 2001-05-03 | 16.17 |
| 2001-05-04 | 16.34 |
| 2001-05-07 | 16.53 |
| 2001-05-08 | 16.78 |
| 2001-05-09 | 16.52 |
| 2001-05-10 | 16.5 |
| 2001-05-11 | 16.44 |
| 2001-05-14 | 16.43 |
| 2001-05-15 | 16.47 |
| 2001-05-16 | 16.58 |
| 2001-05-17 | 16.97 |
| 2001-05-18 | 16.95 |
| 2001-05-21 | 16.99 |
| 2001-05-22 | 17.11 |
| 2001-05-23 | 17.3 |
| 2001-05-24 | 17.3 |
| 2001-05-25 | 17.27 |
| 2001-05-28 | 17.53 |
| 2001-05-29 | 17.63 |
| 2001-05-30 | 17.23 |
| 2001-05-31 | 17.11 |
| 2001-06-01 | 16.87 |
| 2001-06-04 | 16.44 |
| 2001-06-05 | 16.26 |
| 2001-06-06 | 16.37 |
| 2001-06-07 | 16.34 |
| 2001-06-08 | 16.56 |
| 2001-06-11 | 16.56 |
| 2001-06-12 | 16.55 |
| 2001-06-13 | 16.6 |
| 2001-06-14 | 16.33 |
| 2001-06-15 | 15.97 |
| 2001-06-18 | 15.85 |
| 2001-06-19 | 16.03 |
| 2001-06-20 | 15.93 |
| 2001-06-21 | 15.53 |
| 2001-06-22 | 15.31 |
| 2001-06-25 | 14.8 |
| 2001-06-26 | 15.18 |
| 2001-06-27 | 15.23 |
| 2001-06-28 | 15.19 |
| 2001-06-29 | 15.36 |
| 2001-07-02 | 15.23 |
| 2001-07-03 | 14.84 |
| 2001-07-04 | 14.86 |
| 2001-07-05 | 14.8 |
| 2001-07-06 | 14.74 |
| 2001-07-09 | 14.63 |
| 2001-07-10 | 14.78 |
| 2001-07-11 | 14.96 |
| 2001-07-12 | 15.32 |
| 2001-07-13 | 15.22 |
| 2001-07-16 | 15.23 |
| 2001-07-17 | 15.19 |
| 2001-07-18 | 15.17 |
| 2001-07-19 | 15.05 |
| 2001-07-20 | 14.93 |
| 2001-07-23 | 14.84 |
| 2001-07-24 | 14.73 |
| 2001-07-25 | 14.56 |
| 2001-07-26 | 14.43 |
| 2001-07-27 | 14.43 |
| 2001-07-30 | 14.55 |
| 2001-07-31 | 14.76 |
| 2001-08-01 | 14.68 |
| 2001-08-02 | 14.77 |
| 2001-08-03 | 14.86 |
| 2001-08-06 | 14.87 |
| 2001-08-07 | 14.79 |
| 2001-08-08 | 14.74 |
| 2001-08-09 | 14.71 |
| 2001-08-10 | 14.75 |
| 2001-08-13 | 14.66 |
| 2001-08-14 | 14.84 |
| 2001-08-16 | 14.9 |
| 2001-08-17 | 14.76 |
| 2001-08-20 | 14.73 |
| 2001-08-21 | 14.73 |
| 2001-08-23 | 14.76 |
| 2001-08-24 | 14.82 |
| 2001-08-27 | 14.95 |
| 2001-08-28 | 14.92 |
| 2001-08-29 | 14.88 |
| 2001-08-30 | 14.87 |
| 2001-08-31 | 14.53 |
| 2001-09-03 | 14.43 |
| 2001-09-04 | 14.51 |
| 2001-09-05 | 14.35 |
| 2001-09-06 | 14.23 |
| 2001-09-07 | 14.25 |
| 2001-09-10 | 14.18 |
| 2001-09-11 | 14.14 |
| 2001-09-12 | 13.64 |
| 2001-09-13 | 13.46 |
| 2001-09-14 | 12.68 |
| 2001-09-17 | 11.8 |
| 2001-09-18 | 12.18 |
| 2001-09-19 | 12.23 |
| 2001-09-20 | 12.1 |
| 2001-09-21 | 11.58 |
| 2001-09-24 | 11.9 |
| 2001-09-25 | 11.75 |
| 2001-09-26 | 12 |
| 2001-09-27 | 12.06 |
| 2001-09-28 | 12.39 |
| 2001-10-01 | 12.3 |
| 2001-10-03 | 12.07 |
| 2001-10-04 | 12.28 |
| 2001-10-05 | 12.32 |
| 2001-10-08 | 12.13 |
| 2001-10-09 | 12.26 |
| 2001-10-10 | 12.6 |
| 2001-10-11 | 12.74 |
| 2001-10-12 | 12.81 |
| 2001-10-15 | 12.83 |
| 2001-10-16 | 13 |
| 2001-10-17 | 13.25 |
| 2001-10-18 | 13.02 |
| 2001-10-19 | 13.13 |
| 2001-10-22 | 13.2 |
| 2001-10-23 | 13.41 |
| 2001-10-24 | 13.39 |
| 2001-10-25 | 13.31 |
| 2001-10-29 | 13.29 |
| 2001-10-30 | 13.08 |
| 2001-10-31 | 13.18 |
| 2001-11-01 | 13.41 |
| 2001-11-02 | 13.41 |
| 2001-11-05 | 13.42 |
| 2001-11-06 | 13.63 |
| 2001-11-07 | 13.47 |
| 2001-11-08 | 13.61 |
| 2001-11-09 | 13.69 |
| 2001-11-12 | 13.79 |
| 2001-11-13 | 13.73 |
| 2001-11-14 | 13.86 |
| 2001-11-15 | 14.19 |
| 2001-11-19 | 14.62 |
| 2001-11-20 | 14.45 |
| 2001-11-21 | 14.61 |
| 2001-11-22 | 14.73 |
| 2001-11-23 | 14.67 |
| 2001-11-26 | 15.07 |
| 2001-11-27 | 15.04 |
| 2001-11-28 | 14.92 |
| 2001-11-29 | 14.9 |
| 2001-12-03 | 14.94 |
| 2001-12-04 | 15.23 |
| 2001-12-05 | 15.63 |
| 2001-12-06 | 15.62 |
| 2001-12-07 | 15.7 |
| 2001-12-10 | 15.69 |
| 2001-12-11 | 15.59 |
| 2001-12-12 | 15.63 |
| 2001-12-13 | 15.42 |
| 2001-12-14 | 15.3 |
| 2001-12-18 | 15.12 |
| 2001-12-19 | 14.82 |
| 2001-12-20 | 14.88 |
| 2001-12-21 | 14.65 |
| 2001-12-24 | 14.74 |
| 2001-12-26 | 14.42 |
| 2001-12-27 | 14.15 |
| 2001-12-28 | 14.44 |
| 2001-12-31 | 14.82 |
| 2002-01-01 | 14.78 |
| 2002-01-02 | 14.9 |
| 2002-01-03 | 15.08 |
| 2002-01-04 | 15.39 |
| 2002-01-07 | 15.47 |
| 2002-01-08 | 15.57 |
| 2002-01-09 | 15.34 |
| 2002-01-10 | 15.19 |
| 2002-01-11 | 15.02 |
| 2002-01-14 | 15.38 |
| 2002-01-15 | 15.25 |
| 2002-01-16 | 15.29 |
| 2002-01-17 | 15.49 |
| 2002-01-18 | 15.28 |
| 2002-01-21 | 15.33 |
| 2002-01-22 | 15.31 |
| 2002-01-23 | 15.28 |
| 2002-01-24 | 15.21 |
| 2002-01-25 | 15.16 |
| 2002-01-28 | 15.05 |
| 2002-01-29 | 15.11 |
| 2002-01-30 | 15.03 |
| 2002-01-31 | 15.18 |
| 2002-02-01 | 15.28 |
| 2002-02-04 | 13.79 |
| 2002-02-05 | 13.75 |
| 2002-02-06 | 14.31 |
| 2002-02-07 | 14.18 |
| 2002-02-08 | 14.41 |
| 2002-02-11 | 14.54 |
| 2002-02-12 | 14.56 |
| 2002-02-13 | 14.62 |
| 2002-02-14 | 14.84 |
| 2002-02-15 | 14.98 |
| 2002-02-18 | 15.15 |
| 2002-02-19 | 14.95 |
| 2002-02-20 | 14.79 |
| 2002-02-21 | 14.88 |
| 2002-02-22 | 15.04 |
| 2002-02-25 | 15.08 |
| 2002-02-26 | 15.39 |
| 2002-02-27 | 15.3 |
| 2002-02-28 | 14.65 |
| 2002-03-01 | 15.08 |
| 2002-03-04 | 15.21 |
| 2002-03-05 | 15.23 |
| 2002-03-06 | 15.17 |
| 2002-03-07 | 15.4 |
| 2002-03-08 | 15.34 |
| 2002-03-11 | 15.12 |
| 2002-03-12 | 14.89 |
| 2002-03-13 | 14.99 |
| 2002-03-14 | 15.04 |
| 2002-03-15 | 15.2 |
| 2002-03-18 | 15.25 |
| 2002-03-19 | 15.01 |
| 2002-03-20 | 15.04 |
| 2002-03-21 | 14.93 |
| 2002-03-22 | 14.86 |
| 2002-03-26 | 14.71 |
| 2002-03-27 | 14.72 |
| 2002-03-28 | 14.82 |
| 2002-04-01 | 14.73 |
| 2002-04-02 | 14.69 |
| 2002-04-03 | 14.27 |
| 2002-04-04 | 14.52 |
| 2002-04-05 | 14.55 |
| 2002-04-08 | 14.49 |
| 2002-04-09 | 14.42 |
| 2002-04-10 | 14.58 |
| 2002-04-11 | 14.69 |
| 2002-04-12 | 14.74 |
| 2002-04-15 | 14.57 |
| 2002-04-16 | 14.43 |
| 2002-04-17 | 14.5 |
| 2002-04-18 | 14.56 |
| 2002-04-19 | 14.22 |
| 2002-04-22 | 14.24 |
| 2002-04-23 | 14.14 |
| 2002-04-24 | 14.21 |
| 2002-04-25 | 14.04 |
| 2002-04-26 | 14.04 |
| 2002-04-29 | 13.85 |
| 2002-04-30 | 14.03 |
| 2002-05-02 | 14.15 |
| 2002-05-03 | 14.16 |
| 2002-05-06 | 14.26 |
| 2002-05-07 | 14.35 |
| 2002-05-08 | 14.42 |
| 2002-05-09 | 14.54 |
| 2002-05-10 | 14.39 |
| 2002-05-13 | 14.44 |
| 2002-05-14 | 14.43 |
| 2002-05-15 | 14.27 |
| 2002-05-16 | 14.11 |
| 2002-05-17 | 14.03 |
| 2002-05-20 | 13.79 |
| 2002-05-21 | 13.39 |
| 2002-05-22 | 13.43 |
| 2002-05-23 | 13.28 |
| 2002-05-24 | 13.87 |
| 2002-05-27 | 13.9 |
| 2002-05-28 | 13.52 |
| 2002-05-29 | 13.62 |
| 2002-05-30 | 13.51 |
| 2002-05-31 | 13.62 |
| 2002-06-03 | 13.83 |
| 2002-06-04 | 13.97 |
| 2002-06-05 | 14.2 |
| 2002-06-06 | 13.46 |
| 2002-06-07 | 13.22 |
| 2002-06-10 | 13.5 |
| 2002-06-11 | 13.89 |
| 2002-06-12 | 13.89 |
| 2002-06-13 | 13.82 |
| 2002-06-14 | 13.86 |
| 2002-06-17 | 13.93 |
| 2002-06-18 | 13.77 |
| 2002-06-19 | 13.59 |
| 2002-06-20 | 13.66 |
| 2002-06-21 | 13.57 |
| 2002-06-24 | 13.55 |
| 2002-06-25 | 13.5 |
| 2002-06-26 | 13.32 |
| 2002-06-27 | 13.43 |
| 2002-06-28 | 13.54 |
| 2002-07-01 | 13.73 |
| 2002-07-02 | 13.71 |
| 2002-07-03 | 13.75 |
| 2002-07-04 | 13.82 |
| 2002-07-05 | 13.86 |
| 2002-07-08 | 13.96 |
| 2002-07-09 | 13.42 |
| 2002-07-10 | 13.29 |
| 2002-07-11 | 13.13 |
| 2002-07-12 | 13.21 |
| 2002-07-15 | 13.17 |
| 2002-07-16 | 12.98 |
| 2002-07-17 | 12.85 |
| 2002-07-18 | 13.04 |
| 2002-07-19 | 12.97 |
| 2002-07-22 | 12.63 |
| 2002-07-23 | 12.79 |
| 2002-07-24 | 12.57 |
| 2002-07-25 | 12.55 |
| 2002-07-26 | 12.22 |
| 2002-07-29 | 12.1 |
| 2002-07-30 | 11.93 |
| 2002-07-31 | 11.92 |
| 2002-08-01 | 11.92 |
| 2002-08-02 | 11.94 |
| 2002-08-05 | 12.04 |
| 2002-08-06 | 12.09 |
| 2002-08-07 | 12.12 |
| 2002-08-08 | 11.91 |
| 2002-08-09 | 12 |
| 2002-08-12 | 12.1 |
| 2002-08-13 | 12.17 |
| 2002-08-14 | 12.15 |
| 2002-08-16 | 12.25 |
| 2002-08-19 | 12.28 |
| 2002-08-20 | 12.38 |
| 2002-08-21 | 12.4 |
| 2002-08-22 | 12.32 |
| 2002-08-23 | 12.39 |
| 2002-08-26 | 12.45 |
| 2002-08-27 | 12.32 |
| 2002-08-28 | 12.31 |
| 2002-08-29 | 12.24 |
| 2002-08-30 | 12.43 |
| 2002-09-02 | 12.47 |
| 2002-09-03 | 12.4 |
| 2002-09-04 | 12.45 |
| 2002-09-05 | 12.46 |
| 2002-09-06 | 12.31 |
| 2002-09-09 | 12.15 |
| 2002-09-11 | 12.12 |
| 2002-09-12 | 12.17 |
| 2002-09-13 | 12.07 |
| 2002-09-16 | 11.96 |
| 2002-09-17 | 12.02 |
| 2002-09-18 | 11.91 |
| 2002-09-19 | 11.89 |
| 2002-09-20 | 11.86 |
| 2002-09-23 | 11.85 |
| 2002-09-24 | 11.79 |
| 2002-09-25 | 11.84 |
| 2002-09-26 | 11.85 |
| 2002-09-27 | 11.91 |
| 2002-09-30 | 11.73 |
| 2002-10-01 | 11.63 |
| 2002-10-03 | 11.6 |
| 2002-10-04 | 11.6 |
| 2002-10-07 | 11.78 |
| 2002-10-08 | 11.84 |
| 2002-10-09 | 11.77 |
| 2002-10-10 | 12.02 |
| 2002-10-11 | 12.23 |
| 2002-10-14 | 12.21 |
| 2002-10-16 | 12.18 |
| 2002-10-17 | 12.18 |
| 2002-10-18 | 12.24 |
| 2002-10-21 | 12.19 |
| 2002-10-22 | 12 |
| 2002-10-23 | 11.94 |
| 2002-10-24 | 11.84 |
| 2002-10-25 | 11.68 |
| 2002-10-28 | 11.6 |
| 2002-10-29 | 11.77 |
| 2002-10-30 | 11.82 |
| 2002-10-31 | 11.96 |
| 2002-11-01 | 12.01 |
| 2002-11-04 | 12.11 |
| 2002-11-05 | 12.07 |
| 2002-11-07 | 12.05 |
| 2002-11-08 | 12.03 |
| 2002-11-11 | 11.97 |
| 2002-11-12 | 12.02 |
| 2002-11-13 | 12.05 |
| 2002-11-14 | 12.04 |
| 2002-11-15 | 12.18 |
| 2002-11-18 | 12.28 |
| 2002-11-20 | 12.26 |
| 2002-11-21 | 12.29 |
| 2002-11-22 | 12.41 |
| 2002-11-25 | 12.52 |
| 2002-11-26 | 12.62 |
| 2002-11-27 | 12.58 |
| 2002-11-28 | 12.73 |
| 2002-11-29 | 12.8 |
| 2002-12-02 | 13.75 |
| 2002-12-03 | 13.56 |
| 2002-12-04 | 13.37 |
| 2002-12-05 | 13.49 |
| 2002-12-06 | 13.83 |
| 2002-12-09 | 13.64 |
| 2002-12-10 | 13.68 |
| 2002-12-11 | 13.74 |
| 2002-12-12 | 13.81 |
| 2002-12-13 | 13.94 |
| 2002-12-16 | 13.86 |
| 2002-12-17 | 13.78 |
| 2002-12-18 | 13.84 |
| 2002-12-19 | 13.81 |
| 2002-12-20 | 13.86 |
| 2002-12-23 | 13.83 |
| 2002-12-24 | 13.91 |
| 2002-12-26 | 14.01 |
| 2002-12-27 | 14.05 |
| 2002-12-30 | 13.99 |
| 2002-12-31 | 14.02 |
| 2003-01-01 | 14.1 |
| 2003-01-02 | 14.08 |
| 2003-01-03 | 14.04 |
| 2003-01-06 | 13.99 |
| 2003-01-07 | 13.99 |
| 2003-01-08 | 14.06 |
| 2003-01-09 | 14.22 |
| 2003-01-10 | 14.02 |
| 2003-01-13 | 13.96 |
| 2003-01-14 | 14.01 |
| 2003-01-15 | 14.08 |
| 2003-01-16 | 14.14 |
| 2003-01-17 | 14.16 |
| 2003-01-20 | 14.07 |
| 2003-01-21 | 14.1 |
| 2003-01-22 | 14.12 |
| 2003-01-23 | 14.01 |
| 2003-01-24 | 13.79 |
| 2003-01-27 | 13.51 |
| 2003-01-28 | 13.63 |
| 2003-01-29 | 13.6 |
| 2003-01-30 | 13.56 |
| 2003-01-31 | 13.58 |
| 2003-02-03 | 13.72 |
| 2003-02-04 | 13.73 |
| 2003-02-05 | 13.66 |
| 2003-02-06 | 13.83 |
| 2003-02-07 | 13.77 |
| 2003-02-10 | 13.63 |
| 2003-02-11 | 13.61 |
| 2003-02-12 | 13.55 |
| 2003-02-14 | 13.43 |
| 2003-02-17 | 13.72 |
| 2003-02-18 | 13.75 |
| 2003-02-19 | 13.82 |
| 2003-02-20 | 13.83 |
| 2003-02-21 | 13.84 |
| 2003-02-24 | 13.89 |
| 2003-02-25 | 13.73 |
| 2003-02-26 | 13.66 |
| 2003-02-27 | 13.75 |
| 2003-02-28 | 13.82 |
| 2003-03-03 | 13.82 |
| 2003-03-04 | 13.66 |
| 2003-03-05 | 13.67 |
| 2003-03-06 | 13.55 |
| 2003-03-07 | 13.34 |
| 2003-03-10 | 13.2 |
| 2003-03-11 | 13.28 |
| 2003-03-12 | 13.16 |
| 2003-03-13 | 13.13 |
| 2003-03-17 | 13.25 |
| 2003-03-19 | 13.33 |
| 2003-03-20 | 13.53 |
| 2003-03-21 | 13.62 |
| 2003-03-22 | 13.68 |
| 2003-03-24 | 13.43 |
| 2003-03-25 | 13.4 |
| 2003-03-26 | 13.41 |
| 2003-03-27 | 13.19 |
| 2003-03-28 | 13.16 |
| 2003-03-31 | 12.89 |
| 2003-04-01 | 12.91 |
| 2003-04-02 | 13.11 |
| 2003-04-03 | 13.26 |
| 2003-04-04 | 13.38 |
| 2003-04-07 | 13.65 |
| 2003-04-08 | 13.54 |
| 2003-04-09 | 13.4 |
| 2003-04-10 | 12.95 |
| 2003-04-11 | 12.86 |
| 2003-04-15 | 12.88 |
| 2003-04-16 | 12.95 |
| 2003-04-17 | 12.77 |
| 2003-04-21 | 12.88 |
| 2003-04-22 | 12.85 |
| 2003-04-23 | 12.75 |
| 2003-04-24 | 12.71 |
| 2003-04-25 | 12.65 |
| 2003-04-28 | 12.75 |
| 2003-04-29 | 12.75 |
| 2003-04-30 | 12.8 |
| 2003-05-02 | 12.9 |
| 2003-05-05 | 13.07 |
| 2003-05-06 | 13.16 |
| 2003-05-07 | 13.16 |
| 2003-05-08 | 13.05 |
| 2003-05-09 | 13.04 |
| 2003-05-12 | 13.14 |
| 2003-05-13 | 13.26 |
| 2003-05-14 | 13.4 |
| 2003-05-15 | 13.58 |
| 2003-05-16 | 13.77 |
| 2003-05-19 | 13.68 |
| 2003-05-20 | 13.84 |
| 2003-05-21 | 13.91 |
| 2003-05-22 | 13.97 |
| 2003-05-23 | 14.12 |
| 2003-05-26 | 14.4 |
| 2003-05-27 | 14.3 |
| 2003-05-28 | 14.44 |
| 2003-05-29 | 14.6 |
| 2003-05-30 | 14.82 |
| 2003-06-02 | 14.89 |
| 2003-06-03 | 14.91 |
| 2003-06-04 | 15.13 |
| 2003-06-05 | 15.16 |
| 2003-06-06 | 15.26 |
| 2003-06-09 | 15.34 |
| 2003-06-10 | 15.07 |
| 2003-06-11 | 15.2 |
| 2003-06-12 | 15.35 |
| 2003-06-13 | 15.43 |
| 2003-06-16 | 14.89 |
| 2003-06-17 | 15.04 |
| 2003-06-18 | 15.14 |
| 2003-06-19 | 15.23 |
| 2003-06-20 | 15.33 |
| 2003-06-23 | 15.14 |
| 2003-06-24 | 15.16 |
| 2003-06-25 | 15.4 |
| 2003-06-26 | 15.46 |
| 2003-06-27 | 15.6 |
| 2003-06-30 | 15.71 |
| 2003-07-01 | 15.7 |
| 2003-07-02 | 15.78 |
| 2003-07-03 | 15.94 |
| 2003-07-04 | 15.97 |
| 2003-07-07 | 16.09 |
| 2003-07-08 | 16.04 |
| 2003-07-09 | 15.9 |
| 2003-07-10 | 16.08 |
| 2003-07-11 | 16.09 |
| 2003-07-14 | 16.25 |
| 2003-07-15 | 16.08 |
| 2003-07-16 | 15.02 |
| 2003-07-17 | 14.82 |
| 2003-07-18 | 14.66 |
| 2003-07-21 | 14.39 |
| 2003-07-22 | 14.27 |
| 2003-07-23 | 14.37 |
| 2003-07-24 | 14.62 |
| 2003-07-25 | 14.9 |
| 2003-07-28 | 14.99 |
| 2003-07-29 | 15.03 |
| 2003-07-30 | 15.22 |
| 2003-07-31 | 15.23 |
| 2003-08-01 | 15.34 |
| 2003-08-04 | 15.53 |
| 2003-08-05 | 15.31 |
| 2003-08-06 | 15.22 |
| 2003-08-07 | 15.59 |
| 2003-08-08 | 15.93 |
| 2003-08-11 | 16.1 |
| 2003-08-12 | 16.06 |
| 2003-08-13 | 16.26 |
| 2003-08-14 | 16.24 |
| 2003-08-18 | 16.61 |
| 2003-08-19 | 16.5 |
| 2003-08-20 | 16.61 |
| 2003-08-21 | 16.8 |
| 2003-08-22 | 16.98 |
| 2003-08-25 | 16.45 |
| 2003-08-26 | 17.12 |
| 2003-08-27 | 17.5 |
| 2003-08-28 | 17.51 |
| 2003-08-29 | 17.74 |
| 2003-09-01 | 18.09 |
| 2003-09-02 | 18.13 |
| 2003-09-03 | 17.77 |
| 2003-09-04 | 17.9 |
| 2003-09-05 | 18.18 |
| 2003-09-08 | 15.97 |
| 2003-09-09 | 15.88 |
| 2003-09-10 | 15.97 |
| 2003-09-11 | 15.95 |
| 2003-09-12 | 15.6 |
| 2003-09-15 | 15.01 |
| 2003-09-16 | 15.33 |
| 2003-09-17 | 15.05 |
| 2003-09-18 | 14.55 |
| 2003-09-19 | 14.67 |
| 2003-09-22 | 14.49 |
| 2003-09-23 | 14.81 |
| 2003-09-24 | 15.26 |
| 2003-09-25 | 15.17 |
| 2003-09-26 | 15.46 |
| 2003-09-29 | 15.73 |
| 2003-09-30 | 15.9 |
| 2003-10-01 | 15.95 |
| 2003-10-03 | 16.21 |
| 2003-10-06 | 16.59 |
| 2003-10-07 | 16.53 |
| 2003-10-08 | 16.57 |
| 2003-10-09 | 16.81 |
| 2003-10-10 | 16.87 |
| 2003-10-13 | 17.19 |
| 2003-10-14 | 16.84 |
| 2003-10-15 | 16.97 |
| 2003-10-16 | 17.14 |
| 2003-10-17 | 17.26 |
| 2003-10-20 | 16.92 |
| 2003-10-21 | 16.53 |
| 2003-10-22 | 16.34 |
| 2003-10-23 | 16.15 |
| 2003-10-24 | 16.5 |
| 2003-10-25 | 16.75 |
| 2003-10-27 | 16.4 |
| 2003-10-28 | 16.31 |
| 2003-10-29 | 16.42 |
| 2003-10-30 | 16.57 |
| 2003-10-31 | 17.03 |
| 2003-11-03 | 14.4 |
| 2003-11-04 | 14.57 |
| 2003-11-05 | 14.59 |
| 2003-11-06 | 14.69 |
| 2003-11-07 | 14.6 |
| 2003-11-10 | 14.72 |
| 2003-11-11 | 14.85 |
| 2003-11-12 | 14.91 |
| 2003-11-13 | 14.63 |
| 2003-11-14 | 14.33 |
| 2003-11-15 | 14.46 |
| 2003-11-17 | 14.63 |
| 2003-11-18 | 14.52 |
| 2003-11-19 | 14.32 |
| 2003-11-20 | 14.12 |
| 2003-11-21 | 14.2 |
| 2003-11-24 | 14.29 |
| 2003-11-25 | 14.52 |
| 2003-11-27 | 14.74 |
| 2003-11-28 | 14.92 |
| 2003-12-01 | 15.24 |
| 2003-12-02 | 15.27 |
| 2003-12-03 | 15.43 |
| 2003-12-04 | 15.53 |
| 2003-12-05 | 15.32 |
| 2003-12-08 | 15.42 |
| 2003-12-09 | 15.76 |
| 2003-12-10 | 15.87 |
| 2003-12-11 | 15.98 |
| 2003-12-12 | 16.03 |
| 2003-12-15 | 16.21 |
| 2003-12-16 | 16.24 |
| 2003-12-17 | 16.25 |
| 2003-12-18 | 16.57 |
| 2003-12-19 | 16.83 |
| 2003-12-22 | 17.02 |
| 2003-12-23 | 16.91 |
| 2003-12-24 | 17.12 |
| 2003-12-26 | 17.37 |
| 2003-12-29 | 17.71 |
| 2003-12-30 | 17.7 |
| 2003-12-31 | 17.78 |
| 2004-01-02 | 18.63 |
| 2004-01-05 | 18.71 |
| 2004-01-06 | 18.38 |
| 2004-01-07 | 18.29 |
| 2004-01-08 | 18.91 |
| 2004-01-09 | 18.88 |
| 2004-01-12 | 18.59 |
| 2004-01-13 | 18.63 |
| 2004-01-14 | 18.77 |
| 2004-01-15 | 18.5 |
| 2004-01-16 | 18.01 |
| 2004-01-19 | 18.26 |
| 2004-01-20 | 17.91 |
| 2004-01-21 | 16.98 |
| 2004-01-22 | 16.49 |
| 2004-01-23 | 17.31 |
| 2004-01-27 | 17.93 |
| 2004-01-28 | 17.52 |
| 2004-01-29 | 17.37 |
| 2004-01-30 | 16.95 |
| 2004-02-03 | 16.31 |
| 2004-02-04 | 16.79 |
| 2004-02-05 | 16.7 |
| 2004-02-06 | 17.04 |
| 2004-02-09 | 17.45 |
| 2004-02-10 | 17.45 |
| 2004-02-11 | 17.58 |
| 2004-02-12 | 17.57 |
| 2004-02-13 | 17.82 |
| 2004-02-16 | 17.87 |
| 2004-02-17 | 17.89 |
| 2004-02-18 | 17.97 |
| 2004-02-19 | 17.48 |
| 2004-02-20 | 17.4 |
| 2004-02-23 | 16.96 |
| 2004-02-24 | 17.01 |
| 2004-02-25 | 16.66 |
| 2004-02-26 | 16.53 |
| 2004-02-27 | 16.8 |
| 2004-03-01 | 17.5 |
| 2004-03-03 | 17.54 |
| 2004-03-04 | 17.45 |
| 2004-03-05 | 17.77 |
| 2004-03-08 | 18.11 |
| 2004-03-09 | 17.91 |
| 2004-03-10 | 17.74 |
| 2004-03-11 | 17.41 |
| 2004-03-12 | 17.4 |
| 2004-03-15 | 16.86 |
| 2004-03-16 | 16.79 |
| 2004-03-17 | 16.88 |
| 2004-03-18 | 16.62 |
| 2004-03-19 | 16.67 |
| 2004-03-22 | 16.25 |
| 2004-03-23 | 16.25 |
| 2004-03-24 | 16.26 |
| 2004-03-25 | 16.4 |
| 2004-03-26 | 16.78 |
| 2004-03-29 | 16.95 |
| 2004-03-30 | 16.93 |
| 2004-03-31 | 17.12 |
| 2004-04-01 | 17.53 |
| 2004-04-02 | 17.79 |
| 2004-04-05 | 17.91 |
| 2004-04-06 | 17.83 |
| 2004-04-07 | 17.82 |
| 2004-04-08 | 18 |
| 2004-04-12 | 17.93 |
| 2004-04-13 | 18.29 |
| 2004-04-15 | 18.26 |
| 2004-04-16 | 18.36 |
| 2004-04-17 | 18.41 |
| 2004-04-19 | 18.13 |
| 2004-04-20 | 18.11 |
| 2004-04-21 | 18.41 |
| 2004-04-22 | 18.63 |
| 2004-04-23 | 18.72 |
| 2004-04-27 | 17.92 |
| 2004-04-28 | 17.89 |
| 2004-04-29 | 17.88 |
| 2004-04-30 | 17.75 |
| 2004-05-03 | 17.43 |
| 2004-05-04 | 17.75 |
| 2004-05-05 | 17.91 |
| 2004-05-06 | 18.18 |
| 2004-05-07 | 17.93 |
| 2004-05-10 | 17.59 |
| 2004-05-11 | 16.81 |
| 2004-05-12 | 16.94 |
| 2004-05-13 | 16.92 |
| 2004-05-14 | 15.43 |
| 2004-05-17 | 13.57 |
| 2004-05-18 | 14.65 |
| 2004-05-19 | 15.4 |
| 2004-05-21 | 15.34 |
| 2004-05-24 | 15.69 |
| 2004-05-25 | 15.67 |
| 2004-05-26 | 15.67 |
| 2004-05-27 | 15.52 |
| 2004-05-28 | 14.76 |
| 2004-05-31 | 14.4 |
| 2004-06-01 | 14.65 |
| 2004-06-02 | 14.91 |
| 2004-06-03 | 14.28 |
| 2004-06-04 | 14.48 |
| 2004-06-07 | 14.67 |
| 2004-06-08 | 14.75 |
| 2004-06-09 | 14.79 |
| 2004-06-10 | 14.78 |
| 2004-06-11 | 14.46 |
| 2004-06-14 | 14.15 |
| 2004-06-15 | 14.33 |
| 2004-06-16 | 14.28 |
| 2004-06-17 | 14.4 |
| 2004-06-18 | 14.24 |
| 2004-06-21 | 14.13 |
| 2004-06-22 | 14.04 |
| 2004-06-23 | 13.73 |
| 2004-06-24 | 13.9 |
| 2004-06-25 | 14.11 |
| 2004-06-28 | 14.4 |
| 2004-06-29 | 14.46 |
| 2004-06-30 | 14.37 |
| 2004-07-01 | 14.64 |
| 2004-07-02 | 14.64 |
| 2004-07-05 | 14.52 |
| 2004-07-06 | 14.76 |
| 2004-07-07 | 14.84 |
| 2004-07-08 | 14.37 |
| 2004-07-09 | 14.67 |
| 2004-07-12 | 14.74 |
| 2004-07-13 | 14.6 |
| 2004-07-14 | 14.49 |
| 2004-07-15 | 14.67 |
| 2004-07-16 | 14.9 |
| 2004-07-19 | 15.03 |
| 2004-07-20 | 14.97 |
| 2004-07-21 | 15.12 |
| 2004-07-22 | 15.28 |
| 2004-07-23 | 15.32 |
| 2004-07-26 | 15.5 |
| 2004-07-27 | 15.32 |
| 2004-07-28 | 15.25 |
| 2004-07-29 | 15.48 |
| 2004-07-30 | 15.6 |
| 2004-08-02 | 13.85 |
| 2004-08-03 | 13.79 |
| 2004-08-04 | 13.78 |
| 2004-08-05 | 14.02 |
| 2004-08-06 | 13.85 |
| 2004-08-09 | 13.91 |
| 2004-08-10 | 13.98 |
| 2004-08-11 | 13.73 |
| 2004-08-12 | 13.61 |
| 2004-08-13 | 13.58 |
| 2004-08-16 | 13.57 |
| 2004-08-17 | 13.63 |
| 2004-08-18 | 13.48 |
| 2004-08-19 | 13.67 |
| 2004-08-20 | 13.54 |
| 2004-08-23 | 13.41 |
| 2004-08-24 | 13.53 |
| 2004-08-25 | 13.58 |
| 2004-08-26 | 13.74 |
| 2004-08-27 | 13.7 |
| 2004-08-30 | 13.93 |
| 2004-08-31 | 13.97 |
| 2004-09-01 | 14.21 |
| 2004-09-02 | 14.16 |
| 2004-09-03 | 14.22 |
| 2004-09-06 | 14.33 |
| 2004-09-07 | 14.39 |
| 2004-09-08 | 14.46 |
| 2004-09-09 | 14.37 |
| 2004-09-10 | 14.51 |
| 2004-09-13 | 14.57 |
| 2004-09-14 | 14.63 |
| 2004-09-15 | 14.6 |
| 2004-09-16 | 14.8 |
| 2004-09-17 | 15 |
| 2004-09-20 | 14.97 |
| 2004-09-21 | 15.14 |
| 2004-09-22 | 15.21 |
| 2004-09-23 | 15 |
| 2004-09-24 | 15.01 |
| 2004-09-27 | 15 |
| 2004-09-28 | 14.86 |
| 2004-09-29 | 15.07 |
| 2004-09-30 | 15.2 |
| 2004-10-01 | 14.42 |
| 2004-10-04 | 14.59 |
| 2004-10-05 | 14.68 |
| 2004-10-06 | 14.57 |
| 2004-10-07 | 14.69 |
| 2004-10-08 | 14.73 |
| 2004-10-09 | 14.76 |
| 2004-10-11 | 14.65 |
| 2004-10-12 | 14.43 |
| 2004-10-14 | 14.48 |
| 2004-10-15 | 14.48 |
| 2004-10-18 | 14.42 |
| 2004-10-19 | 14.58 |
| 2004-10-20 | 14.45 |
| 2004-10-21 | 14.38 |
| 2004-10-25 | 14.16 |
| 2004-10-26 | 14.32 |
| 2004-10-27 | 14.39 |
| 2004-10-28 | 14.51 |
| 2004-10-29 | 14.42 |
| 2004-11-01 | 14.51 |
| 2004-11-02 | 14.66 |
| 2004-11-03 | 14.86 |
| 2004-11-04 | 14.87 |
| 2004-11-05 | 15.01 |
| 2004-11-08 | 15.07 |
| 2004-11-09 | 15.02 |
| 2004-11-10 | 15.17 |
| 2004-11-11 | 15.12 |
| 2004-11-12 | 15.17 |
| 2004-11-16 | 15.22 |
| 2004-11-17 | 15.34 |
| 2004-11-18 | 15.43 |
| 2004-11-19 | 15.27 |
| 2004-11-22 | 15.3 |
| 2004-11-23 | 15.49 |
| 2004-11-24 | 15.59 |
| 2004-11-25 | 15.58 |
| 2004-11-29 | 15.87 |
| 2004-11-30 | 15.93 |
| 2004-12-01 | 15.87 |
| 2004-12-02 | 16.2 |
| 2004-12-03 | 16.19 |
| 2004-12-06 | 16.18 |
| 2004-12-07 | 16.19 |
| 2004-12-08 | 16.11 |
| 2004-12-09 | 16.21 |
| 2004-12-10 | 15.3 |
| 2004-12-13 | 15.42 |
| 2004-12-14 | 15.61 |
| 2004-12-15 | 15.74 |
| 2004-12-16 | 15.8 |
| 2004-12-17 | 15.7 |
| 2004-12-20 | 15.85 |
| 2004-12-21 | 16 |
| 2004-12-22 | 16.63 |
| 2004-12-23 | 16.74 |
| 2004-12-24 | 16.88 |
| 2004-12-27 | 16.92 |
| 2004-12-28 | 17.07 |
| 2004-12-29 | 17.03 |
| 2004-12-30 | 16.94 |
| 2004-12-31 | 17.17 |
| 2005-01-03 | 17.45 |
| 2005-01-04 | 17.42 |
| 2005-01-05 | 16.88 |
| 2005-01-06 | 16.61 |
| 2005-01-07 | 16.86 |
| 2005-01-10 | 16.67 |
| 2005-01-11 | 16.37 |
| 2005-01-12 | 15.95 |
| 2005-01-13 | 16.32 |
| 2005-01-14 | 16.16 |
| 2005-01-17 | 16.12 |
| 2005-01-18 | 16.16 |
| 2005-01-19 | 16.09 |
| 2005-01-20 | 16.01 |
| 2005-01-24 | 15.87 |
| 2005-01-25 | 16.05 |
| 2005-01-27 | 16.25 |
| 2005-01-28 | 16.63 |
| 2005-01-31 | 16.97 |
| 2005-02-01 | 17.04 |
| 2005-02-02 | 17.05 |
| 2005-02-03 | 17.28 |
| 2005-02-04 | 17.27 |
| 2005-02-07 | 17.16 |
| 2005-02-08 | 17.18 |
| 2005-02-09 | 17.34 |
| 2005-02-10 | 17.12 |
| 2005-02-11 | 17.26 |
| 2005-02-14 | 17.36 |
| 2005-02-15 | 17.27 |
| 2005-02-16 | 17.13 |
| 2005-02-17 | 17.07 |
| 2005-02-18 | 17.08 |
| 2005-02-21 | 17.03 |
| 2005-02-22 | 17.14 |
| 2005-02-23 | 17.16 |
| 2005-02-24 | 17.16 |
| 2005-02-25 | 17.18 |
| 2005-02-28 | 17.47 |
| 2005-03-01 | 17.33 |
| 2005-03-02 | 17.46 |
| 2005-03-03 | 17.74 |
| 2005-03-04 | 17.91 |
| 2005-03-07 | 18.02 |
| 2005-03-08 | 18.11 |
| 2005-03-09 | 18 |
| 2005-03-10 | 18.07 |
| 2005-03-11 | 17.99 |
| 2005-03-14 | 17.91 |
| 2005-03-15 | 17.79 |
| 2005-03-16 | 17.78 |
| 2005-03-17 | 17.56 |
| 2005-03-18 | 17.58 |
| 2005-03-21 | 17.49 |
| 2005-03-22 | 17.15 |
| 2005-03-23 | 16.82 |
| 2005-03-24 | 16.51 |
| 2005-03-28 | 16.68 |
| 2005-03-29 | 16.32 |
| 2005-03-30 | 16.45 |
| 2005-03-31 | 16.79 |
| 2005-04-01 | 17.1 |
| 2005-04-04 | 17.09 |
| 2005-04-05 | 16.97 |
| 2005-04-06 | 17.11 |
| 2005-04-07 | 17.02 |
| 2005-04-08 | 16.89 |
| 2005-04-11 | 16.71 |
| 2005-04-12 | 16.84 |
| 2005-04-13 | 16.86 |
| 2005-04-15 | 16.36 |
| 2005-04-18 | 16.17 |
| 2005-04-19 | 16.05 |
| 2005-04-20 | 16.19 |
| 2005-04-21 | 16.38 |
| 2005-04-22 | 16.52 |
| 2005-04-25 | 16.56 |
| 2005-04-26 | 16.49 |
| 2005-04-27 | 16.32 |
| 2005-04-28 | 16.28 |
| 2005-04-29 | 16 |
| 2005-05-02 | 16.07 |
| 2005-05-03 | 16.1 |
| 2005-05-04 | 16.28 |
| 2005-05-05 | 16.47 |
| 2005-05-06 | 16.58 |
| 2005-05-09 | 16.79 |
| 2005-05-10 | 16.76 |
| 2005-05-11 | 16.71 |
| 2005-05-12 | 16.79 |
| 2005-05-13 | 16.78 |
| 2005-05-16 | 16.96 |
| 2005-05-17 | 16.78 |
| 2005-05-18 | 16.73 |
| 2005-05-19 | 16.82 |
| 2005-05-20 | 16.84 |
| 2005-05-23 | 17 |
| 2005-05-24 | 17.09 |
| 2005-05-25 | 17.19 |
| 2005-05-26 | 17.32 |
| 2005-05-27 | 17.34 |
| 2005-05-30 | 17.3 |
| 2005-05-31 | 17.45 |
| 2005-06-01 | 17.48 |
| 2005-06-02 | 17.34 |
| 2005-06-03 | 17.54 |
| 2005-06-04 | 17.56 |
| 2005-06-06 | 17.48 |
| 2005-06-07 | 17.55 |
| 2005-06-08 | 17.65 |
| 2005-06-09 | 17.6 |
| 2005-06-10 | 17.51 |
| 2005-06-13 | 17.58 |
| 2005-06-14 | 17.63 |
| 2005-06-15 | 17.74 |
| 2005-06-16 | 17.62 |
| 2005-06-17 | 17.55 |
| 2005-06-20 | 17.61 |
| 2005-06-21 | 17.79 |
| 2005-06-22 | 17.89 |
| 2005-06-23 | 17.91 |
| 2005-06-24 | 18.01 |
| 2005-06-27 | 18.03 |
| 2005-06-28 | 17.77 |
| 2005-06-29 | 17.9 |
| 2005-06-30 | 18.02 |
| 2005-07-01 | 17.72 |
| 2005-07-04 | 17.92 |
| 2005-07-05 | 17.78 |
| 2005-07-06 | 17.97 |
| 2005-07-07 | 17.64 |
| 2005-07-08 | 17.84 |
| 2005-07-11 | 18.03 |
| 2005-07-12 | 18.06 |
| 2005-07-13 | 18.01 |
| 2005-07-14 | 17.92 |
| 2005-07-15 | 18.12 |
| 2005-07-18 | 18.32 |
| 2005-07-19 | 18.38 |
| 2005-07-20 | 18.45 |
| 2005-07-21 | 18.35 |
| 2005-07-22 | 18.61 |
| 2005-07-25 | 18.81 |
| 2005-07-26 | 18.82 |
| 2005-07-27 | 18.91 |
| 2005-07-29 | 18.81 |
| 2005-08-01 | 18.92 |
| 2005-08-02 | 19.24 |
| 2005-08-03 | 19.23 |
| 2005-08-04 | 19.33 |
| 2005-08-05 | 19.43 |
| 2005-08-08 | 17.55 |
| 2005-08-09 | 17.51 |
| 2005-08-10 | 17.81 |
| 2005-08-11 | 17.95 |
| 2005-08-12 | 17.87 |
| 2005-08-16 | 17.96 |
| 2005-08-17 | 18.18 |
| 2005-08-18 | 18.09 |
| 2005-08-19 | 18.07 |
| 2005-08-22 | 17.97 |
| 2005-08-23 | 17.65 |
| 2005-08-24 | 17.57 |
| 2005-08-25 | 17.77 |
| 2005-08-26 | 17.9 |
| 2005-08-29 | 17.8 |
| 2005-08-30 | 18.03 |
| 2005-08-31 | 18.17 |
| 2005-09-01 | 18.32 |
| 2005-09-02 | 18.42 |
| 2005-09-05 | 18.48 |
| 2005-09-06 | 18.52 |
| 2005-09-08 | 18.68 |
| 2005-09-09 | 18.68 |
| 2005-09-12 | 18.91 |
| 2005-09-13 | 19.04 |
| 2005-09-14 | 18.17 |
| 2005-09-15 | 18.38 |
| 2005-09-16 | 18.55 |
| 2005-09-19 | 18.69 |
| 2005-09-20 | 18.73 |
| 2005-09-21 | 18.58 |
| 2005-09-22 | 17.81 |
| 2005-09-23 | 17.87 |
| 2005-09-26 | 18.36 |
| 2005-09-27 | 18.47 |
| 2005-09-28 | 18.65 |
| 2005-09-29 | 18.66 |
| 2005-09-30 | 18.6 |
| 2005-10-03 | 18.81 |
| 2005-10-04 | 19.04 |
| 2005-10-05 | 17.38 |
| 2005-10-06 | 16.95 |
| 2005-10-07 | 16.91 |
| 2005-10-10 | 16.83 |
| 2005-10-11 | 16.91 |
| 2005-10-13 | 16.63 |
| 2005-10-14 | 16.29 |
| 2005-10-17 | 16.23 |
| 2005-10-18 | 16.12 |
| 2005-10-19 | 15.73 |
| 2005-10-20 | 15.58 |
| 2005-10-21 | 15.84 |
| 2005-10-24 | 15.63 |
| 2005-10-25 | 15.76 |
| 2005-10-26 | 15.68 |
| 2005-10-27 | 15.33 |
| 2005-10-28 | 15.11 |
| 2005-10-31 | 15.45 |
| 2005-11-01 | 15.58 |
| 2005-11-02 | 15.75 |
| 2005-11-07 | 16.01 |
| 2005-11-08 | 16.25 |
| 2005-11-09 | 16.2 |
| 2005-11-10 | 16.28 |
| 2005-11-11 | 16.6 |
| 2005-11-14 | 16.66 |
| 2005-11-16 | 16.79 |
| 2005-11-17 | 16.9 |
| 2005-11-18 | 16.97 |
| 2005-11-21 | 16.89 |
| 2005-11-22 | 16.73 |
| 2005-11-23 | 16.89 |
| 2005-11-24 | 17.04 |
| 2005-11-25 | 17.24 |
| 2005-11-26 | 17.4 |
| 2005-11-28 | 17.58 |
| 2005-11-29 | 17.51 |
| 2005-11-30 | 17.28 |
| 2005-12-01 | 17.55 |
| 2005-12-02 | 17.57 |
| 2005-12-05 | 17.38 |
| 2005-12-06 | 17.38 |
| 2005-12-07 | 17.54 |
| 2005-12-08 | 17.76 |
| 2005-12-09 | 18.03 |
| 2005-12-12 | 18.15 |
| 2005-12-13 | 18.35 |
| 2005-12-14 | 18.25 |
| 2005-12-15 | 18.07 |
| 2005-12-16 | 18.25 |
| 2005-12-19 | 18.52 |
| 2005-12-20 | 18.48 |
| 2005-12-21 | 18.47 |
| 2005-12-22 | 18.54 |
| 2005-12-23 | 18.33 |
| 2005-12-26 | 17.96 |
| 2005-12-27 | 18.32 |
| 2005-12-28 | 18.3 |
| 2005-12-29 | 18.44 |
| 2005-12-30 | 18.58 |
| 2006-01-02 | 18.62 |
| 2006-01-03 | 18.91 |
| 2006-01-04 | 18.99 |
| 2006-01-05 | 19.02 |
| 2006-01-06 | 19.12 |
| 2006-01-09 | 19.15 |
| 2006-01-10 | 18.93 |
| 2006-01-12 | 18.86 |
| 2006-01-13 | 18.87 |
| 2006-01-16 | 18.74 |
| 2006-01-17 | 18.65 |
| 2006-01-18 | 18.26 |
| 2006-01-19 | 18.64 |
| 2006-01-20 | 18.81 |
| 2006-01-23 | 18.73 |
| 2006-01-24 | 18.84 |
| 2006-01-25 | 18.96 |
| 2006-01-27 | 19.25 |
| 2006-01-30 | 19.13 |
| 2006-01-31 | 19.25 |
| 2006-02-01 | 19.06 |
| 2006-02-02 | 19.05 |
| 2006-02-03 | 19 |
| 2006-02-06 | 19.31 |
| 2006-02-07 | 19.43 |
| 2006-02-08 | 19.42 |
| 2006-02-10 | 19.55 |
| 2006-02-13 | 19.65 |
| 2006-02-14 | 19.53 |
| 2006-02-15 | 19.58 |
| 2006-02-16 | 19.62 |
| 2006-02-17 | 19.35 |
| 2006-02-20 | 19.39 |
| 2006-02-21 | 19.56 |
| 2006-02-22 | 19.67 |
| 2006-02-23 | 19.7 |
| 2006-02-24 | 19.73 |
| 2006-02-27 | 19.85 |
| 2006-02-28 | 19.84 |
| 2006-03-01 | 20.14 |
| 2006-03-02 | 20.11 |
| 2006-03-03 | 20.13 |
| 2006-03-06 | 20.4 |
| 2006-03-07 | 20.45 |
| 2006-03-08 | 20.06 |
| 2006-03-09 | 20.16 |
| 2006-03-10 | 20.45 |
| 2006-03-13 | 20.55 |
| 2006-03-14 | 20.48 |
| 2006-03-16 | 20.62 |
| 2006-03-17 | 20.64 |
| 2006-03-20 | 20.81 |
| 2006-03-21 | 20.78 |
| 2006-03-22 | 20.64 |
| 2006-03-23 | 20.94 |
| 2006-03-24 | 21.13 |
| 2006-03-27 | 21.35 |
| 2006-03-28 | 21.3 |
| 2006-03-29 | 21.45 |
| 2006-03-30 | 21.73 |
| 2006-03-31 | 21.81 |
| 2006-04-03 | 20.91 |
| 2006-04-04 | 21.04 |
| 2006-04-05 | 21.25 |
| 2006-04-07 | 20.93 |
| 2006-04-10 | 21.08 |
| 2006-04-12 | 20.58 |
| 2006-04-13 | 20.31 |
| 2006-04-17 | 20.67 |
| 2006-04-18 | 21.05 |
| 2006-04-19 | 21.1 |
| 2006-04-20 | 21.22 |
| 2006-04-21 | 21.2 |
| 2006-04-24 | 21.01 |
| 2006-04-25 | 20.56 |
| 2006-04-26 | 21.18 |
| 2006-04-27 | 20.89 |
| 2006-04-28 | 20.56 |
| 2006-04-29 | 20.83 |
| 2006-05-02 | 20.99 |
| 2006-05-03 | 21.15 |
| 2006-05-04 | 21.23 |
| 2006-05-05 | 21.3 |
| 2006-05-08 | 21.47 |
| 2006-05-09 | 21.58 |
| 2006-05-10 | 21.78 |
| 2006-05-11 | 21.51 |
| 2006-05-12 | 21.27 |
| 2006-05-15 | 20.41 |
| 2006-05-16 | 20.47 |
| 2006-05-17 | 21.08 |
| 2006-05-18 | 19.62 |
| 2006-05-19 | 18.82 |
| 2006-05-22 | 17.72 |
| 2006-05-23 | 18.39 |
| 2006-05-24 | 18.06 |
| 2006-05-25 | 18.39 |
| 2006-05-26 | 18.07 |
| 2006-05-29 | 18.11 |
| 2006-05-30 | 18.01 |
| 2006-05-31 | 17.44 |
| 2006-06-01 | 16.91 |
| 2006-06-02 | 17.32 |
| 2006-06-05 | 17 |
| 2006-06-06 | 16.51 |
| 2006-06-07 | 15.83 |
| 2006-06-08 | 14.92 |
| 2006-06-09 | 15.77 |
| 2006-06-12 | 15.41 |
| 2006-06-13 | 14.67 |
| 2006-06-14 | 14.43 |
| 2006-06-15 | 15.37 |
| 2006-06-16 | 15.95 |
| 2006-06-19 | 16.16 |
| 2006-06-20 | 15.98 |
| 2006-06-21 | 16.35 |
| 2006-06-22 | 16.73 |
| 2006-06-23 | 16.91 |
| 2006-06-25 | 17.08 |
| 2006-06-26 | 16.32 |
| 2006-06-27 | 16.42 |
| 2006-06-28 | 16.51 |
| 2006-06-29 | 16.58 |
| 2006-06-30 | 17.25 |
| 2006-07-03 | 17.37 |
| 2006-07-04 | 17.35 |
| 2006-07-05 | 17.64 |
| 2006-07-06 | 17.48 |
| 2006-07-07 | 17.08 |
| 2006-07-10 | 17.57 |
| 2006-07-11 | 17.48 |
| 2006-07-12 | 17.76 |
| 2006-07-13 | 17.65 |
| 2006-07-14 | 17.42 |
| 2006-07-17 | 16.79 |
| 2006-07-18 | 16.63 |
| 2006-07-19 | 16.13 |
| 2006-07-20 | 16.47 |
| 2006-07-21 | 16 |
| 2006-07-24 | 16.05 |
| 2006-07-25 | 16.42 |
| 2006-07-26 | 16.6 |
| 2006-07-27 | 16.81 |
| 2006-07-28 | 16.73 |
| 2006-07-31 | 16.54 |
| 2006-08-01 | 16.5 |
| 2006-08-02 | 16.72 |
| 2006-08-03 | 16.76 |
| 2006-08-04 | 16.68 |
| 2006-08-07 | 16.59 |
| 2006-08-08 | 16.88 |
| 2006-08-09 | 17.11 |
| 2006-08-10 | 17.23 |
| 2006-08-11 | 17.36 |
| 2006-08-14 | 17.6 |
| 2006-08-16 | 17.84 |
| 2006-08-17 | 17.79 |
| 2006-08-18 | 17.84 |
| 2006-08-21 | 17.92 |
| 2006-08-22 | 17.89 |
| 2006-08-23 | 17.72 |
| 2006-08-24 | 17.89 |
| 2006-08-25 | 18 |
| 2006-08-28 | 18.09 |
| 2006-08-29 | 18.22 |
| 2006-08-30 | 18.21 |
| 2006-08-31 | 18.11 |
| 2006-09-01 | 18.25 |
| 2006-09-04 | 18.49 |
| 2006-09-05 | 18.53 |
| 2006-09-06 | 18.6 |
| 2006-09-07 | 18.49 |
| 2006-09-08 | 18.61 |
| 2006-09-11 | 18.03 |
| 2006-09-12 | 18.2 |
| 2006-09-13 | 18.59 |
| 2006-09-14 | 18.69 |
| 2006-09-15 | 18.73 |
| 2006-09-18 | 18.8 |
| 2006-09-19 | 18.59 |
| 2006-09-20 | 18.8 |
| 2006-09-21 | 19.03 |
| 2006-09-22 | 19.03 |
| 2006-09-25 | 18.94 |
| 2006-09-26 | 19.33 |
| 2006-09-27 | 19.42 |
| 2006-09-28 | 19.44 |
| 2006-09-29 | 19.59 |
| 2006-10-03 | 19.56 |
| 2006-10-04 | 19.32 |
| 2006-10-05 | 19.6 |
| 2006-10-06 | 19.66 |
| 2006-10-09 | 19.67 |
| 2006-10-10 | 19.7 |
| 2006-10-11 | 19.52 |
| 2006-10-12 | 19.81 |
| 2006-10-13 | 20.01 |
| 2006-10-16 | 20.1 |
| 2006-10-17 | 19.89 |
| 2006-10-18 | 19.78 |
| 2006-10-19 | 19.53 |
| 2006-10-20 | 19.46 |
| 2006-10-21 | 19.53 |
| 2006-10-23 | 19.38 |
| 2006-10-26 | 19.38 |
| 2006-10-27 | 19.62 |
| 2006-10-30 | 18.98 |
| 2006-10-31 | 18.84 |
| 2006-11-01 | 18.67 |
| 2006-11-02 | 18.79 |
| 2006-11-03 | 18.85 |
| 2006-11-06 | 18.9 |
| 2006-11-07 | 18.86 |
| 2006-11-08 | 18.78 |
| 2006-11-09 | 18.87 |
| 2006-11-10 | 19.05 |
| 2006-11-13 | 19.22 |
| 2006-11-14 | 19.23 |
| 2006-11-15 | 19.3 |
| 2006-11-16 | 19.3 |
| 2006-11-17 | 19.14 |
| 2006-11-20 | 19.08 |
| 2006-11-21 | 19.4 |
| 2006-11-22 | 19.57 |
| 2006-11-23 | 19.59 |
| 2006-11-24 | 19.67 |
| 2006-11-27 | 19.76 |
| 2006-11-28 | 19.52 |
| 2006-11-29 | 19.56 |
| 2006-11-30 | 19.6 |
| 2006-12-01 | 19.89 |
| 2006-12-04 | 19.99 |
| 2006-12-05 | 20.03 |
| 2006-12-06 | 19.96 |
| 2006-12-07 | 19.98 |
| 2006-12-08 | 19.79 |
| 2006-12-11 | 19.13 |
| 2006-12-12 | 18.39 |
| 2006-12-13 | 18.73 |
| 2006-12-14 | 19.18 |
| 2006-12-15 | 19.46 |
| 2006-12-18 | 19.56 |
| 2006-12-19 | 19.12 |
| 2006-12-20 | 19.04 |
| 2006-12-21 | 19.11 |
| 2006-12-22 | 19.3 |
| 2006-12-26 | 19.64 |
| 2006-12-27 | 19.8 |
| 2006-12-28 | 19.8 |
| 2006-12-29 | 19.84 |
| 2007-01-02 | 20.01 |
| 2007-01-03 | 20.13 |
| 2007-01-04 | 20.05 |
| 2007-01-05 | 20.03 |
| 2007-01-08 | 19.8 |
| 2007-01-09 | 19.65 |
| 2007-01-10 | 19.36 |
| 2007-01-11 | 19.73 |
| 2007-01-12 | 20.18 |
| 2007-01-15 | 20.3 |
| 2007-01-16 | 20.22 |
| 2007-01-17 | 20.25 |
| 2007-01-18 | 20.32 |
| 2007-01-19 | 20.08 |
| 2007-01-22 | 20 |
| 2007-01-23 | 19.6 |
| 2007-01-24 | 19.68 |
| 2007-01-25 | 19.87 |
| 2007-01-29 | 19.48 |
| 2007-01-31 | 18.63 |
| 2007-02-01 | 18.71 |
| 2007-02-02 | 18.85 |
| 2007-02-05 | 18.94 |
| 2007-02-06 | 18.92 |
| 2007-02-07 | 19.02 |
| 2007-02-08 | 19.01 |
| 2007-02-09 | 18.78 |
| 2007-02-12 | 18.16 |
| 2007-02-13 | 18.08 |
| 2007-02-14 | 18.07 |
| 2007-02-15 | 18.51 |
| 2007-02-19 | 18.56 |
| 2007-02-20 | 18.33 |
| 2007-02-21 | 18.29 |
| 2007-02-22 | 18.06 |
| 2007-02-23 | 17.62 |
| 2007-02-26 | 17.64 |
| 2007-02-27 | 17.52 |
| 2007-02-28 | 16.9 |
| 2007-03-01 | 17.11 |
| 2007-03-02 | 16.81 |
| 2007-03-05 | 16.08 |
| 2007-03-06 | 16.33 |
| 2007-03-07 | 16.14 |
| 2007-03-08 | 16.71 |
| 2007-03-09 | 16.58 |
| 2007-03-12 | 16.68 |
| 2007-03-13 | 16.88 |
| 2007-03-14 | 16.37 |
| 2007-03-15 | 16.43 |
| 2007-03-16 | 16.29 |
| 2007-03-19 | 16.56 |
| 2007-03-20 | 16.67 |
| 2007-03-21 | 16.89 |
| 2007-03-22 | 17.28 |
| 2007-03-23 | 17.25 |
| 2007-03-26 | 17.1 |
| 2007-03-28 | 16.85 |
| 2007-03-29 | 16.96 |
| 2007-03-30 | 17.11 |
| 2007-04-02 | 16.37 |
| 2007-04-03 | 16.58 |
| 2007-04-04 | 16.79 |
| 2007-04-05 | 16.89 |
| 2007-04-09 | 17.29 |
| 2007-04-10 | 17.34 |
| 2007-04-11 | 17.41 |
| 2007-04-12 | 17.28 |
| 2007-04-13 | 17.56 |
| 2007-04-16 | 17.93 |
| 2007-04-17 | 17.78 |
| 2007-04-18 | 17.89 |
| 2007-04-19 | 17.82 |
| 2007-04-20 | 18.06 |
| 2007-04-23 | 18 |
| 2007-04-24 | 18.22 |
| 2007-04-25 | 18.33 |
| 2007-04-26 | 18.33 |
| 2007-04-27 | 17.59 |
| 2007-04-30 | 17.6 |
| 2007-05-03 | 17.72 |
| 2007-05-04 | 17.61 |
| 2007-05-07 | 17.55 |
| 2007-05-08 | 17.44 |
| 2007-05-09 | 17.47 |
| 2007-05-10 | 17.43 |
| 2007-05-11 | 17.48 |
| 2007-05-14 | 17.62 |
| 2007-05-15 | 17.6 |
| 2007-05-16 | 17.82 |
| 2007-05-17 | 18.05 |
| 2007-05-18 | 17.97 |
| 2007-05-21 | 18.02 |
| 2007-05-22 | 18.09 |
| 2007-05-23 | 17.96 |
| 2007-05-24 | 17.83 |
| 2007-05-25 | 18.04 |
| 2007-05-28 | 18.35 |
| 2007-05-29 | 18.42 |
| 2007-05-30 | 18.35 |
| 2007-05-31 | 18.47 |
| 2007-06-01 | 18.53 |
| 2007-06-04 | 18.5 |
| 2007-06-05 | 18.58 |
| 2007-06-06 | 18.22 |
| 2007-06-07 | 18.14 |
| 2007-06-08 | 17.99 |
| 2007-06-11 | 17.99 |
| 2007-06-12 | 17.97 |
| 2007-06-13 | 17.85 |
| 2007-06-14 | 18.12 |
| 2007-06-15 | 18.15 |
| 2007-06-18 | 18.05 |
| 2007-06-19 | 18.32 |
| 2007-06-20 | 18.49 |
| 2007-06-21 | 18.61 |
| 2007-06-22 | 18.59 |
| 2007-06-25 | 18.64 |
| 2007-06-26 | 18.76 |
| 2007-06-27 | 18.67 |
| 2007-06-28 | 18.72 |
| 2007-06-29 | 18.93 |
| 2007-07-02 | 18.99 |
| 2007-07-03 | 19.18 |
| 2007-07-04 | 19.19 |
| 2007-07-05 | 19.1 |
| 2007-07-06 | 19.29 |
| 2007-07-09 | 19.46 |
| 2007-07-10 | 19.39 |
| 2007-07-11 | 19.36 |
| 2007-07-12 | 19.63 |
| 2007-07-13 | 19.82 |
| 2007-07-16 | 19.91 |
| 2007-07-17 | 19.8 |
| 2007-07-18 | 19.78 |
| 2007-07-19 | 19.94 |
| 2007-07-20 | 19.86 |
| 2007-07-23 | 20.03 |
| 2007-07-24 | 19.95 |
| 2007-07-25 | 19.73 |
| 2007-07-26 | 19.7 |
| 2007-07-27 | 18.96 |
| 2007-07-30 | 18.58 |
| 2007-07-31 | 18.72 |
| 2007-08-01 | 17.95 |
| 2007-08-02 | 18.03 |
| 2007-08-03 | 18.25 |
| 2007-08-06 | 18.02 |
| 2007-08-07 | 18.11 |
| 2007-08-08 | 18.5 |
| 2007-08-09 | 18.23 |
| 2007-08-10 | 17.97 |
| 2007-08-13 | 18.12 |
| 2007-08-14 | 18.12 |
| 2007-08-16 | 17.35 |
| 2007-08-17 | 17.08 |
| 2007-08-20 | 17.44 |
| 2007-08-21 | 16.87 |
| 2007-08-22 | 17.1 |
| 2007-08-23 | 16.95 |
| 2007-08-24 | 17.24 |
| 2007-08-27 | 17.72 |
| 2007-08-28 | 17.84 |
| 2007-08-29 | 17.97 |
| 2007-08-30 | 18.13 |
| 2007-08-31 | 18.4 |
| 2007-09-03 | 18.57 |
| 2007-09-04 | 18.61 |
| 2007-09-05 | 18.61 |
| 2007-09-06 | 18.79 |
| 2007-09-07 | 18.75 |
| 2007-09-10 | 18.84 |
| 2007-09-11 | 18.84 |
| 2007-09-12 | 18.84 |
| 2007-09-13 | 19.01 |
| 2007-09-14 | 18.9 |
| 2007-09-17 | 18.86 |
| 2007-09-18 | 19.07 |
| 2007-09-19 | 19.71 |
| 2007-09-20 | 19.83 |
| 2007-09-21 | 20.07 |
| 2007-09-24 | 20.56 |
| 2007-09-25 | 20.59 |
| 2007-09-26 | 20.65 |
| 2007-09-27 | 20.79 |
| 2007-09-28 | 20.99 |
| 2007-10-01 | 21.23 |
| 2007-10-03 | 21.69 |
| 2007-10-04 | 21.73 |
| 2007-10-05 | 21.61 |
| 2007-10-08 | 21.07 |
| 2007-10-09 | 21.95 |
| 2007-10-10 | 22.38 |
| 2007-10-11 | 22.71 |
| 2007-10-12 | 22.33 |
| 2007-10-15 | 23.15 |
| 2007-10-16 | 23.19 |
| 2007-10-17 | 22.66 |
| 2007-10-18 | 21.91 |
| 2007-10-19 | 21.16 |
| 2007-10-22 | 21.03 |
| 2007-10-23 | 22.11 |
| 2007-10-24 | 22.24 |
| 2007-10-25 | 22.44 |
| 2007-10-26 | 22.9 |
| 2007-10-29 | 23.46 |
| 2007-10-30 | 23.15 |
| 2007-10-31 | 23.04 |
| 2007-11-01 | 22.78 |
| 2007-11-02 | 23.04 |
| 2007-11-05 | 22.87 |
| 2007-11-06 | 22.77 |
| 2007-11-07 | 22.74 |
| 2007-11-08 | 22.46 |
| 2007-11-09 | 22.39 |
| 2007-11-12 | 22.23 |
| 2007-11-13 | 22.61 |
| 2007-11-14 | 23.5 |
| 2007-11-15 | 23.61 |
| 2007-11-16 | 23.7 |
| 2007-11-19 | 23.94 |
| 2007-11-20 | 23.46 |
| 2007-11-21 | 22.43 |
| 2007-11-22 | 22.22 |
| 2007-11-23 | 22.61 |
| 2007-11-26 | 23.14 |
| 2007-11-27 | 23.09 |
| 2007-11-28 | 22.85 |
| 2007-11-29 | 22.8 |
| 2007-11-30 | 23.42 |
| 2007-12-03 | 23.9 |
| 2007-12-04 | 24.07 |
| 2007-12-05 | 24.45 |
| 2007-12-06 | 24.45 |
| 2007-12-07 | 25.02 |
| 2007-12-10 | 25.08 |
| 2007-12-11 | 25.5 |
| 2007-12-12 | 25.85 |
| 2007-12-13 | 25.62 |
| 2007-12-14 | 25.68 |
| 2007-12-17 | 24.49 |
| 2007-12-18 | 24.41 |
| 2007-12-19 | 24.43 |
| 2007-12-20 | 24.44 |
| 2007-12-24 | 25.21 |
| 2007-12-26 | 25.76 |
| 2007-12-27 | 25.81 |
| 2007-12-28 | 26.05 |
| 2007-12-31 | 26.4 |
| 2008-01-02 | 26.75 |
| 2008-01-03 | 26.77 |
| 2008-01-04 | 27.07 |
| 2008-01-07 | 27.06 |
| 2008-01-08 | 26.87 |
| 2008-01-09 | 26.81 |
| 2008-01-10 | 26.16 |
| 2008-01-11 | 26.28 |
| 2008-01-14 | 26.44 |
| 2008-01-15 | 25.93 |
| 2008-01-16 | 25.32 |
| 2008-01-17 | 24.59 |
| 2008-01-18 | 23.41 |
| 2008-01-21 | 20.99 |
| 2008-01-22 | 19.51 |
| 2008-01-23 | 20.76 |
| 2008-01-24 | 20.09 |
| 2008-01-25 | 21.43 |
| 2008-01-28 | 21.2 |
| 2008-01-29 | 21.13 |
| 2008-01-30 | 20.44 |
| 2008-01-31 | 20.19 |
| 2008-02-01 | 20.62 |
| 2008-02-04 | 21.26 |
| 2008-02-05 | 21.4 |
| 2008-02-06 | 20.87 |
| 2008-02-07 | 20.18 |
| 2008-02-08 | 19.99 |
| 2008-02-11 | 18.94 |
| 2008-02-12 | 18.8 |
| 2008-02-13 | 19.06 |
| 2008-02-14 | 20.14 |
| 2008-02-15 | 20.61 |
| 2008-02-18 | 20.55 |
| 2008-02-19 | 20.58 |
| 2008-02-20 | 20.11 |
| 2008-02-21 | 20.27 |
| 2008-02-22 | 19.97 |
| 2008-02-25 | 20.21 |
| 2008-02-26 | 20.49 |
| 2008-02-27 | 20.49 |
| 2008-02-28 | 20.48 |
| 2008-02-29 | 20.29 |
| 2008-03-03 | 19.26 |
| 2008-03-04 | 18.82 |
| 2008-03-05 | 18.92 |
| 2008-03-07 | 18.25 |
| 2008-03-10 | 18.28 |
| 2008-03-11 | 18.73 |
| 2008-03-12 | 18.68 |
| 2008-03-13 | 17.63 |
| 2008-03-14 | 18.06 |
| 2008-03-17 | 17.01 |
| 2008-03-18 | 17.01 |
| 2008-03-19 | 17.08 |
| 2008-03-24 | 17.08 |
| 2008-03-25 | 18.12 |
| 2008-03-26 | 18.06 |
| 2008-03-27 | 18.04 |
| 2008-03-28 | 18.55 |
| 2008-03-31 | 17.86 |
| 2008-04-01 | 17.82 |
| 2008-04-02 | 17.9 |
| 2008-04-03 | 17.93 |
| 2008-04-04 | 17.49 |
| 2008-04-07 | 17.88 |
| 2008-04-08 | 17.77 |
| 2008-04-09 | 17.94 |
| 2008-04-10 | 17.88 |
| 2008-04-11 | 18.03 |
| 2008-04-15 | 18.38 |
| 2008-04-16 | 18.48 |
| 2008-04-17 | 18.8 |
| 2008-04-21 | 19.11 |
| 2008-04-22 | 19.11 |
| 2008-04-23 | 19.01 |
| 2008-04-24 | 19.03 |
| 2008-04-25 | 19.3 |
| 2008-04-28 | 19.23 |
| 2008-04-29 | 19.51 |
| 2008-04-30 | 19.41 |
| 2008-05-02 | 19.66 |
| 2008-05-05 | 19.56 |
| 2008-05-06 | 19.33 |
| 2008-05-07 | 19.21 |
| 2008-05-08 | 19 |
| 2008-05-09 | 18.59 |
| 2008-05-12 | 18.6 |
| 2008-05-13 | 18.47 |
| 2008-05-14 | 18.66 |
| 2008-05-15 | 18.98 |
| 2008-05-16 | 19.1 |
| 2008-05-20 | 18.93 |
| 2008-05-21 | 18.94 |
| 2008-05-22 | 18.6 |
| 2008-05-23 | 18.31 |
| 2008-05-26 | 17.97 |
| 2008-05-27 | 17.89 |
| 2008-05-28 | 18.22 |
| 2008-05-29 | 18.02 |
| 2008-05-30 | 18.09 |
| 2008-06-02 | 17.58 |
| 2008-06-03 | 17.48 |
| 2008-06-04 | 16.96 |
| 2008-06-05 | 17.22 |
| 2008-06-06 | 17.02 |
| 2008-06-09 | 16.47 |
| 2008-06-10 | 16.28 |
| 2008-06-11 | 16.57 |
| 2008-06-12 | 16.64 |
| 2008-06-13 | 16.58 |
| 2008-06-16 | 16.79 |
| 2008-06-17 | 17.17 |
| 2008-06-18 | 16.93 |
| 2008-06-19 | 16.62 |
| 2008-06-20 | 16.06 |
| 2008-06-23 | 15.64 |
| 2008-06-24 | 15.36 |
| 2008-06-25 | 15.54 |
| 2008-06-26 | 15.68 |
| 2008-06-27 | 15.05 |
| 2008-06-30 | 14.65 |
| 2008-07-01 | 14.1 |
| 2008-07-02 | 14.79 |
| 2008-07-03 | 14.22 |
| 2008-07-04 | 14.61 |
| 2008-07-07 | 14.75 |
| 2008-07-08 | 14.65 |
| 2008-07-09 | 15.26 |
| 2008-07-10 | 15.27 |
| 2008-07-11 | 14.84 |
| 2008-07-14 | 14.79 |
| 2008-07-15 | 14.15 |
| 2008-07-16 | 14 |
| 2008-07-17 | 14.44 |
| 2008-07-18 | 14.88 |
| 2008-07-21 | 15.04 |
| 2008-07-22 | 15.32 |
| 2008-07-23 | 16.17 |
| 2008-07-24 | 16.04 |
| 2008-07-25 | 15.62 |
| 2008-07-28 | 15.63 |
| 2008-07-29 | 15.03 |
| 2008-07-30 | 15.63 |
| 2008-07-31 | 15.69 |
| 2008-08-01 | 16.02 |
| 2008-08-04 | 16.08 |
| 2008-08-05 | 16.47 |
| 2008-08-06 | 16.49 |
| 2008-08-07 | 16.52 |
| 2008-08-08 | 16.56 |
| 2008-08-11 | 16.89 |
| 2008-08-12 | 16.66 |
| 2008-08-13 | 16.57 |
| 2008-08-14 | 16.18 |
| 2008-08-18 | 16.04 |
| 2008-08-19 | 15.95 |
| 2008-08-20 | 16.11 |
| 2008-08-21 | 15.65 |
| 2008-08-22 | 15.76 |
| 2008-08-25 | 15.8 |
| 2008-08-26 | 15.81 |
| 2008-08-27 | 15.65 |
| 2008-08-28 | 15.41 |
| 2008-08-29 | 15.92 |
| 2008-09-01 | 15.89 |
| 2008-09-02 | 16.43 |
| 2008-09-04 | 16.26 |
| 2008-09-05 | 15.92 |
| 2008-09-08 | 16.32 |
| 2008-09-09 | 16.26 |
| 2008-09-10 | 16.35 |
| 2008-09-11 | 16 |
| 2008-09-12 | 15.74 |
| 2008-09-15 | 15.13 |
| 2008-09-16 | 15.06 |
| 2008-09-17 | 14.79 |
| 2008-09-18 | 14.79 |
| 2008-09-19 | 15.46 |
| 2008-09-22 | 15.67 |
| 2008-09-23 | 15.35 |
| 2008-09-24 | 15.45 |
| 2008-09-25 | 15.29 |
| 2008-09-26 | 14.82 |
| 2008-09-29 | 14.27 |
| 2008-09-30 | 14.51 |
| 2008-10-01 | 14.63 |
| 2008-10-03 | 14.16 |
| 2008-10-06 | 13.33 |
| 2008-10-07 | 13.25 |
| 2008-10-08 | 12.79 |
| 2008-10-10 | 11.89 |
| 2008-10-13 | 12.57 |
| 2008-10-14 | 12.72 |
| 2008-10-15 | 12.1 |
| 2008-10-16 | 11.91 |
| 2008-10-17 | 11.29 |
| 2008-10-20 | 11.46 |
| 2008-10-21 | 11.85 |
| 2008-10-22 | 11.3 |
| 2008-10-23 | 10.85 |
| 2008-10-24 | 9.58 |
| 2008-10-27 | 9.29 |
| 2008-10-28 | 9.86 |
| 2008-10-29 | 9.89 |
| 2008-10-31 | 11.15 |
| 2008-11-03 | 12 |
| 2008-11-04 | 12.42 |
| 2008-11-05 | 11.94 |
| 2008-11-06 | 11.57 |
| 2008-11-07 | 11.85 |
| 2008-11-10 | 12.49 |
| 2008-11-11 | 11.8 |
| 2008-11-12 | 11.48 |
| 2008-11-14 | 11.29 |
| 2008-11-17 | 11.16 |
| 2008-11-18 | 10.74 |
| 2008-11-19 | 10.54 |
| 2008-11-20 | 10.19 |
| 2008-11-21 | 10.6 |
| 2008-11-24 | 10.64 |
| 2008-11-25 | 10.46 |
| 2008-11-26 | 10.72 |
| 2008-11-28 | 10.73 |
| 2008-12-01 | 10.49 |
| 2008-12-02 | 10.4 |
| 2008-12-03 | 10.46 |
| 2008-12-04 | 10.94 |
| 2008-12-05 | 10.68 |
| 2008-12-08 | 10.88 |
| 2008-12-10 | 11.36 |
| 2008-12-11 | 11.4 |
| 2008-12-12 | 11.44 |
| 2008-12-15 | 11.71 |
| 2008-12-16 | 11.98 |
| 2008-12-17 | 11.63 |
| 2008-12-18 | 12.04 |
| 2008-12-19 | 12.16 |
| 2008-12-22 | 12.03 |
| 2008-12-23 | 11.73 |
| 2008-12-24 | 11.57 |
| 2008-12-26 | 11.36 |
| 2008-12-29 | 11.6 |
| 2008-12-30 | 11.85 |
| 2008-12-31 | 11.8 |
| 2009-01-01 | 12.13 |
| 2009-01-02 | 12.23 |
| 2009-01-05 | 12.5 |
| 2009-01-06 | 12.49 |
| 2009-01-07 | 11.67 |
| 2009-01-09 | 11.42 |
| 2009-01-12 | 11.32 |
| 2009-01-13 | 11.18 |
| 2009-01-14 | 11.51 |
| 2009-01-15 | 11.15 |
| 2009-01-16 | 11.46 |
| 2009-01-19 | 11.55 |
| 2009-01-20 | 11.42 |
| 2009-01-21 | 11.09 |
| 2009-01-22 | 11.06 |
| 2009-01-23 | 11.11 |
| 2009-01-27 | 11.52 |
| 2009-01-28 | 11.89 |
| 2009-01-29 | 11.98 |
| 2009-01-30 | 12.15 |
| 2009-02-02 | 12.22 |
| 2009-02-03 | 12.25 |
| 2009-02-04 | 12.31 |
| 2009-02-05 | 12.22 |
| 2009-02-06 | 12.47 |
| 2009-02-09 | 12.8 |
| 2009-02-10 | 12.86 |
| 2009-02-11 | 12.84 |
| 2009-02-12 | 12.73 |
| 2009-02-13 | 12.95 |
| 2009-02-16 | 12.55 |
| 2009-02-17 | 12.22 |
| 2009-02-18 | 12.23 |
| 2009-02-19 | 12.27 |
| 2009-02-20 | 12.05 |
| 2009-02-24 | 12 |
| 2009-02-25 | 12.1 |
| 2009-02-26 | 12.13 |
| 2009-02-27 | 12.07 |
| 2009-03-02 | 11.73 |
| 2009-03-03 | 11.52 |
| 2009-03-04 | 11.58 |
| 2009-03-05 | 11.33 |
| 2009-03-06 | 11.45 |
| 2009-03-09 | 11.24 |
| 2009-03-12 | 11.4 |
| 2009-03-13 | 11.8 |
| 2009-03-16 | 12.1 |
| 2009-03-17 | 12.04 |
| 2009-03-18 | 12.22 |
| 2009-03-19 | 12.28 |
| 2009-03-20 | 12.25 |
| 2009-03-23 | 12.77 |
| 2009-03-24 | 12.73 |
| 2009-03-25 | 12.91 |
| 2009-03-26 | 13.25 |
| 2009-03-27 | 13.4 |
| 2009-03-30 | 12.93 |
| 2009-03-31 | 13.13 |
| 2009-04-01 | 13.3 |
| 2009-04-02 | 13.9 |
| 2009-04-06 | 14.15 |
| 2009-04-08 | 14.52 |
| 2009-04-09 | 14.57 |
| 2009-04-13 | 14.87 |
| 2009-04-15 | 15.38 |
| 2009-04-16 | 14.82 |
| 2009-04-17 | 14.92 |
| 2009-04-20 | 14.97 |
| 2009-04-21 | 14.9 |
| 2009-04-22 | 14.73 |
| 2009-04-23 | 15.12 |
| 2009-04-24 | 15.39 |
| 2009-04-27 | 15.4 |
| 2009-04-28 | 14.91 |
| 2009-04-29 | 15.28 |
| 2009-05-04 | 16.03 |
| 2009-05-05 | 16.14 |
| 2009-05-06 | 15.96 |
| 2009-05-07 | 16.3 |
| 2009-05-08 | 16.09 |
| 2009-05-11 | 15.76 |
| 2009-05-12 | 16.2 |
| 2009-05-13 | 16.05 |
| 2009-05-14 | 15.98 |
| 2009-05-15 | 16.25 |
| 2009-05-18 | 19.73 |
| 2009-05-19 | 18.92 |
| 2009-05-20 | 19.11 |
| 2009-05-21 | 18.98 |
| 2009-05-22 | 19.06 |
| 2009-05-25 | 19.37 |
| 2009-05-26 | 18.82 |
| 2009-05-27 | 19.53 |
| 2009-05-28 | 19.82 |
| 2009-05-29 | 19.73 |
| 2009-06-01 | 19.8 |
| 2009-06-02 | 19.33 |
| 2009-06-03 | 19.41 |
| 2009-06-04 | 19.7 |
| 2009-06-05 | 19.72 |
| 2009-06-08 | 18.95 |
| 2009-06-09 | 19.47 |
| 2009-06-10 | 19.85 |
| 2009-06-11 | 19.73 |
| 2009-06-12 | 19.5 |
| 2009-06-15 | 19.15 |
| 2009-06-16 | 19.38 |
| 2009-06-17 | 18.41 |
| 2009-06-18 | 17.92 |
| 2009-06-19 | 18.16 |
| 2009-06-22 | 17.92 |
| 2009-06-23 | 17.98 |
| 2009-06-24 | 18.24 |
| 2009-06-25 | 18.13 |
| 2009-06-26 | 18.54 |
| 2009-06-29 | 18.8 |
| 2009-06-30 | 18.45 |
| 2009-07-01 | 18.64 |
| 2009-07-02 | 18.76 |
| 2009-07-03 | 18.98 |
| 2009-07-06 | 17.95 |
| 2009-07-07 | 17.99 |
| 2009-07-08 | 17.52 |
| 2009-07-09 | 17.58 |
| 2009-07-10 | 17.23 |
| 2009-07-13 | 16.99 |
| 2009-07-14 | 17.59 |
| 2009-07-15 | 18.2 |
| 2009-07-16 | 18.14 |
| 2009-07-17 | 18.63 |
| 2009-07-20 | 19.06 |
| 2009-07-21 | 18.87 |
| 2009-07-22 | 18.57 |
| 2009-07-23 | 18.92 |
| 2009-07-24 | 19.3 |
| 2009-07-27 | 19.29 |
| 2009-07-28 | 19.17 |
| 2009-07-29 | 18.97 |
| 2009-07-30 | 18.75 |
| 2009-07-31 | 19 |
| 2009-08-03 | 19.42 |
| 2009-08-04 | 19.35 |
| 2009-08-05 | 19.46 |
| 2009-08-06 | 19.03 |
| 2009-08-07 | 18.64 |
| 2009-08-10 | 18.44 |
| 2009-08-11 | 18.56 |
| 2009-08-12 | 18.52 |
| 2009-08-13 | 19.12 |
| 2009-08-14 | 19.08 |
| 2009-08-17 | 18.36 |
| 2009-08-18 | 18.67 |
| 2009-08-19 | 18.37 |
| 2009-08-20 | 18.58 |
| 2009-08-21 | 18.83 |
| 2009-08-24 | 19.23 |
| 2009-08-25 | 19.3 |
| 2009-08-26 | 19.43 |
| 2009-08-27 | 19.49 |
| 2009-08-28 | 19.69 |
| 2009-08-31 | 19.56 |
| 2009-09-01 | 19.38 |
| 2009-09-02 | 19.3 |
| 2009-09-03 | 19.28 |
| 2009-09-04 | 19.55 |
| 2009-09-07 | 20 |
| 2009-09-08 | 20.03 |
| 2009-09-09 | 20.01 |
| 2009-09-10 | 19.99 |
| 2009-09-11 | 19.95 |
| 2009-09-14 | 19.94 |
| 2009-09-15 | 20.27 |
| 2009-09-16 | 20.51 |
| 2009-09-17 | 20.53 |
| 2009-09-18 | 20.64 |
| 2009-09-22 | 20.77 |
| 2009-09-23 | 20.56 |
| 2009-09-24 | 20.62 |
| 2009-09-25 | 20.63 |
| 2009-09-29 | 20.78 |
| 2009-09-30 | 21.02 |
| 2009-10-01 | 21.02 |
| 2009-10-05 | 20.65 |
| 2009-10-06 | 20.68 |
| 2009-10-07 | 20.65 |
| 2009-10-08 | 20.75 |
| 2009-10-09 | 20.59 |
| 2009-10-12 | 20.94 |
| 2009-10-14 | 21.2 |
| 2009-10-15 | 21.23 |
| 2009-10-16 | 21.32 |
| 2009-10-17 | 21.38 |
| 2009-10-20 | 21.31 |
| 2009-10-21 | 21.11 |
| 2009-10-22 | 20.84 |
| 2009-10-23 | 20.71 |
| 2009-10-26 | 20.37 |
| 2009-10-27 | 19.84 |
| 2009-10-28 | 19.78 |
| 2009-10-29 | 19.45 |
| 2009-10-30 | 18.19 |
| 2009-11-03 | 17.6 |
| 2009-11-04 | 18.12 |
| 2009-11-05 | 18.42 |
| 2009-11-06 | 18.88 |
| 2009-11-09 | 19.25 |
| 2009-11-10 | 19.29 |
| 2009-11-11 | 19.82 |
| 2009-11-12 | 19.59 |
| 2009-11-13 | 19.74 |
| 2009-11-16 | 19.97 |
| 2009-11-17 | 19.96 |
| 2009-11-18 | 19.98 |
| 2009-11-19 | 19.71 |
| 2009-11-20 | 19.89 |
| 2009-11-23 | 20.05 |
| 2009-11-24 | 20.05 |
| 2009-11-25 | 20.08 |
| 2009-11-26 | 19.77 |
| 2009-11-27 | 19.52 |
| 2009-11-30 | 19.88 |
| 2009-12-01 | 20.23 |
| 2009-12-02 | 20.26 |
| 2009-12-03 | 20.37 |
| 2009-12-04 | 20.34 |
| 2009-12-07 | 20.15 |
| 2009-12-08 | 20.43 |
| 2009-12-09 | 20.36 |
| 2009-12-10 | 20.45 |
| 2009-12-11 | 20.38 |
| 2009-12-14 | 20.32 |
| 2009-12-15 | 20.04 |
| 2009-12-16 | 20.06 |
| 2009-12-17 | 20.12 |
| 2009-12-18 | 19.93 |
| 2009-12-21 | 19.83 |
| 2009-12-22 | 20 |
| 2009-12-23 | 20.51 |
| 2009-12-24 | 20.64 |
| 2009-12-29 | 20.68 |
| 2009-12-30 | 20.67 |
| 2009-12-31 | 20.78 |
| 2010-01-04 | 20.96 |
| 2010-01-05 | 21.21 |
| 2010-01-06 | 21.24 |
| 2010-01-07 | 21.19 |
| 2010-01-08 | 21.16 |
| 2010-01-11 | 21.29 |
| 2010-01-12 | 21.09 |
| 2010-01-13 | 21.21 |
| 2010-01-14 | 21.38 |
| 2010-01-15 | 21.47 |
| 2010-01-18 | 21.62 |
| 2010-01-19 | 21.47 |
| 2010-01-20 | 20.99 |
| 2010-01-21 | 20.47 |
| 2010-01-22 | 20.32 |
| 2010-01-25 | 19.65 |
| 2010-01-27 | 18.95 |
| 2010-01-28 | 19.01 |
| 2010-01-29 | 18.67 |
| 2010-02-01 | 18.85 |
| 2010-02-02 | 18.59 |
| 2010-02-03 | 18.93 |
| 2010-02-04 | 18.6 |
| 2010-02-05 | 18.17 |
| 2010-02-06 | 18.36 |
| 2010-02-08 | 18.37 |
| 2010-02-09 | 18.54 |
| 2010-02-10 | 18.43 |
| 2010-02-11 | 18.62 |
| 2010-02-15 | 18.5 |
| 2010-02-16 | 18.67 |
| 2010-02-17 | 18.84 |
| 2010-02-18 | 18.73 |
| 2010-02-19 | 18.53 |
| 2010-02-22 | 18.49 |
| 2010-02-23 | 18.47 |
| 2010-02-24 | 18.42 |
| 2010-02-25 | 18.39 |
| 2010-02-26 | 18.54 |
| 2010-03-02 | 18.83 |
| 2010-03-03 | 19.09 |
| 2010-03-04 | 19.15 |
| 2010-03-05 | 19.18 |
| 2010-03-08 | 19.26 |
| 2010-03-09 | 19.11 |
| 2010-03-10 | 19.11 |
| 2010-03-11 | 19.11 |
| 2010-03-12 | 19.11 |
| 2010-03-15 | 19.03 |
| 2010-03-16 | 19.21 |
| 2010-03-17 | 19.36 |
| 2010-03-18 | 19.37 |
| 2010-03-19 | 19.45 |
| 2010-03-22 | 19.25 |
| 2010-03-23 | 19.29 |
| 2010-03-25 | 19.32 |
| 2010-03-26 | 19.41 |
| 2010-03-29 | 19.44 |
| 2010-03-30 | 19.41 |
| 2010-03-31 | 19.41 |
| 2010-04-01 | 19.56 |
| 2010-04-05 | 19.83 |
| 2010-04-06 | 19.83 |
| 2010-04-07 | 19.9 |
| 2010-04-08 | 19.71 |
| 2010-04-09 | 19.84 |
| 2010-04-12 | 19.77 |
| 2010-04-13 | 19.72 |
| 2010-04-15 | 19.59 |
| 2010-04-16 | 19.51 |
| 2010-04-19 | 19.32 |
| 2010-04-20 | 19.47 |
| 2010-04-21 | 19.58 |
| 2010-04-22 | 19.63 |
| 2010-04-23 | 19.69 |
| 2010-04-26 | 19.75 |
| 2010-04-27 | 19.33 |
| 2010-04-28 | 19.05 |
| 2010-04-29 | 19.16 |
| 2010-04-30 | 19.17 |
| 2010-05-03 | 19.06 |
| 2010-05-04 | 18.78 |
| 2010-05-05 | 18.76 |
| 2010-05-06 | 18.69 |
| 2010-05-07 | 18.36 |
| 2010-05-10 | 18.89 |
| 2010-05-11 | 18.67 |
| 2010-05-12 | 18.73 |
| 2010-05-13 | 18.85 |
| 2010-05-14 | 18.49 |
| 2010-05-17 | 18.39 |
| 2010-05-18 | 18.41 |
| 2010-05-19 | 17.93 |
| 2010-05-20 | 18.04 |
| 2010-05-21 | 17.91 |
| 2010-05-24 | 17.95 |
| 2010-05-25 | 17.47 |
| 2010-05-26 | 17.83 |
| 2010-05-27 | 18.07 |
| 2010-05-28 | 18.79 |
| 2010-05-31 | 18.97 |
| 2010-06-01 | 18.63 |
| 2010-06-02 | 18.81 |
| 2010-06-03 | 19.09 |
| 2010-06-04 | 19.14 |
| 2010-06-07 | 18.83 |
| 2010-06-08 | 18.66 |
| 2010-06-09 | 18.75 |
| 2010-06-10 | 19 |
| 2010-06-11 | 18.98 |
| 2010-06-14 | 19.21 |
| 2010-06-15 | 19.28 |
| 2010-06-16 | 19.31 |
| 2010-06-17 | 19.42 |
| 2010-06-18 | 19.35 |
| 2010-06-21 | 19.61 |
| 2010-06-22 | 19.52 |
| 2010-06-23 | 19.57 |
| 2010-06-24 | 19.54 |
| 2010-06-25 | 19.51 |
| 2010-06-28 | 19.8 |
| 2010-06-29 | 19.59 |
| 2010-06-30 | 19.76 |
| 2010-07-01 | 19.6 |
| 2010-07-02 | 19.59 |
| 2010-07-05 | 19.58 |
| 2010-07-06 | 19.73 |
| 2010-07-07 | 19.6 |
| 2010-07-08 | 19.76 |
| 2010-07-09 | 19.93 |
| 2010-07-12 | 20 |
| 2010-07-13 | 20.07 |
| 2010-07-14 | 20.02 |
| 2010-07-15 | 19.97 |
| 2010-07-16 | 20.07 |
| 2010-07-19 | 20.08 |
| 2010-07-20 | 20.01 |
| 2010-07-21 | 20.12 |
| 2010-07-22 | 20.19 |
| 2010-07-23 | 20.17 |
| 2010-07-26 | 20.02 |
| 2010-07-27 | 20.07 |
| 2010-07-28 | 20 |
| 2010-07-29 | 19.98 |
| 2010-07-30 | 19.92 |
| 2010-08-02 | 20.9 |
| 2010-08-03 | 20.95 |
| 2010-08-04 | 21.03 |
| 2010-08-05 | 20.99 |
| 2010-08-06 | 20.97 |
| 2010-08-09 | 21.05 |
| 2010-08-10 | 20.95 |
| 2010-08-11 | 20.85 |
| 2010-08-12 | 20.89 |
| 2010-08-13 | 21.03 |
| 2010-08-16 | 21.07 |
| 2010-08-17 | 21.09 |
| 2010-08-18 | 21.29 |
| 2010-08-19 | 21.43 |
| 2010-08-20 | 21.42 |
| 2010-08-23 | 21.54 |
| 2010-08-24 | 21.4 |
| 2010-08-25 | 21.23 |
| 2010-08-26 | 21.28 |
| 2010-08-27 | 21.08 |
| 2010-08-30 | 21.1 |
| 2010-08-31 | 20.93 |
| 2010-09-01 | 21.24 |
| 2010-09-02 | 21.27 |
| 2010-09-03 | 21.33 |
| 2010-09-06 | 21.66 |
| 2010-09-07 | 21.74 |
| 2010-09-08 | 21.78 |
| 2010-09-09 | 21.87 |
| 2010-09-13 | 22.32 |
| 2010-09-14 | 22.39 |
| 2010-09-15 | 22.54 |
| 2010-09-16 | 22.37 |
| 2010-09-17 | 22.58 |
| 2010-09-20 | 22.82 |
| 2010-09-21 | 22.81 |
| 2010-09-22 | 22.73 |
| 2010-09-23 | 22.65 |
| 2010-09-24 | 22.88 |
| 2010-09-27 | 23 |
| 2010-09-28 | 23.01 |
| 2010-09-29 | 22.85 |
| 2010-09-30 | 22.84 |
| 2010-10-01 | 23.42 |
| 2010-10-04 | 23.51 |
| 2010-10-05 | 23.55 |
| 2010-10-06 | 23.75 |
| 2010-10-07 | 23.59 |
| 2010-10-08 | 23.5 |
| 2010-10-11 | 23.81 |
| 2010-10-12 | 23.63 |
| 2010-10-13 | 24.07 |
| 2010-10-14 | 23.9 |
| 2010-10-15 | 23.49 |
| 2010-10-18 | 23.37 |
| 2010-10-19 | 23.24 |
| 2010-10-20 | 23.11 |
| 2010-10-21 | 23.53 |
| 2010-10-22 | 23.45 |
| 2010-10-25 | 23.58 |
| 2010-10-26 | 23.26 |
| 2010-10-27 | 23.05 |
| 2010-10-28 | 22.94 |
| 2010-10-29 | 22.99 |
| 2010-11-01 | 23.36 |
| 2010-11-02 | 23.4 |
| 2010-11-03 | 23.54 |
| 2010-11-04 | 23.6 |
| 2010-11-05 | 23.72 |
| 2010-11-08 | 23.61 |
| 2010-11-09 | 23.72 |
| 2010-11-10 | 23.67 |
| 2010-11-11 | 23.36 |
| 2010-11-12 | 22.87 |
| 2010-11-15 | 22.64 |
| 2010-11-16 | 22.16 |
| 2010-11-18 | 22.17 |
| 2010-11-19 | 21.77 |
| 2010-11-22 | 22.19 |
| 2010-11-23 | 21.91 |
| 2010-11-24 | 21.65 |
| 2010-11-25 | 21.33 |
| 2010-11-26 | 21.03 |
| 2010-11-29 | 21.29 |
| 2010-11-30 | 21.5 |
| 2010-12-01 | 21.92 |
| 2010-12-02 | 22.1 |
| 2010-12-03 | 21.92 |
| 2010-12-06 | 21.9 |
| 2010-12-07 | 21.79 |
| 2010-12-08 | 21.48 |
| 2010-12-09 | 20.87 |
| 2010-12-10 | 21.2 |
| 2010-12-13 | 21.46 |
| 2010-12-14 | 21.65 |
| 2010-12-15 | 21.44 |
| 2010-12-16 | 21.59 |
| 2010-12-20 | 21.58 |
| 2010-12-21 | 21.77 |
| 2010-12-22 | 21.74 |
| 2010-12-23 | 21.71 |
| 2010-12-24 | 21.79 |
| 2010-12-27 | 21.73 |
| 2010-12-28 | 21.73 |
| 2010-12-29 | 21.94 |
| 2010-12-30 | 22.08 |
| 2010-12-31 | 22.24 |
| 2011-01-03 | 22.36 |
| 2011-01-04 | 22.31 |
| 2011-01-05 | 22.07 |
| 2011-01-06 | 21.9 |
| 2011-01-07 | 21.38 |
| 2011-01-10 | 20.87 |
| 2011-01-11 | 20.82 |
| 2011-01-12 | 21.21 |
| 2011-01-13 | 20.86 |
| 2011-01-14 | 20.51 |
| 2011-01-17 | 20.45 |
| 2011-01-18 | 20.56 |
| 2011-01-19 | 20.47 |
| 2011-01-20 | 20.53 |
| 2011-01-21 | 20.36 |
| 2011-01-24 | 20.33 |
| 2011-01-25 | 20.11 |
| 2011-01-27 | 19.81 |
| 2011-01-28 | 19.4 |
| 2011-01-31 | 19.22 |
| 2011-02-01 | 18.92 |
| 2011-02-02 | 18.97 |
| 2011-02-03 | 19.26 |
| 2011-02-04 | 18.87 |
| 2011-02-07 | 18.84 |
| 2011-02-08 | 18.48 |
| 2011-02-09 | 18.15 |
| 2011-02-10 | 18.09 |
| 2011-02-11 | 18.42 |
| 2011-02-14 | 18.93 |
| 2011-02-15 | 19.01 |
| 2011-02-16 | 19.06 |
| 2011-02-17 | 19.27 |
| 2011-02-18 | 18.96 |
| 2011-02-21 | 19.12 |
| 2011-02-22 | 18.95 |
| 2011-02-23 | 18.87 |
| 2011-02-24 | 18.27 |
| 2011-02-25 | 18.38 |
| 2011-02-28 | 18.47 |
| 2011-03-01 | 19.1 |
| 2011-03-03 | 19.14 |
| 2011-03-04 | 19.15 |
| 2011-03-07 | 18.9 |
| 2011-03-08 | 19.1 |
| 2011-03-09 | 19.15 |
| 2011-03-10 | 19.06 |
| 2011-03-11 | 18.89 |
| 2011-03-14 | 19.14 |
| 2011-03-15 | 18.85 |
| 2011-03-16 | 19.08 |
| 2011-03-17 | 18.91 |
| 2011-03-18 | 18.7 |
| 2011-03-21 | 18.66 |
| 2011-03-22 | 18.82 |
| 2011-03-23 | 19.02 |
| 2011-03-24 | 19.16 |
| 2011-03-25 | 19.59 |
| 2011-03-28 | 19.7 |
| 2011-03-29 | 19.84 |
| 2011-03-30 | 20.05 |
| 2011-03-31 | 20.17 |
| 2011-04-01 | 20.23 |
| 2011-04-04 | 20.53 |
| 2011-04-05 | 20.59 |
| 2011-04-06 | 20.57 |
| 2011-04-07 | 20.61 |
| 2011-04-08 | 20.43 |
| 2011-04-11 | 20.43 |
| 2011-04-13 | 20.81 |
| 2011-04-15 | 20.54 |
| 2011-04-18 | 20.26 |
| 2011-04-19 | 20.26 |
| 2011-04-20 | 20.58 |
| 2011-04-21 | 20.63 |
| 2011-04-25 | 20.49 |
| 2011-04-26 | 20.46 |
| 2011-04-27 | 20.34 |
| 2011-04-28 | 20.16 |
| 2011-04-29 | 19.93 |
| 2011-05-02 | 19.73 |
| 2011-05-03 | 19.25 |
| 2011-05-04 | 19.14 |
| 2011-05-05 | 18.91 |
| 2011-05-06 | 19.18 |
| 2011-05-09 | 19.2 |
| 2011-05-10 | 19.16 |
| 2011-05-11 | 19.26 |
| 2011-05-12 | 19.01 |
| 2011-05-13 | 19.1 |
| 2011-05-16 | 18.95 |
| 2011-05-17 | 18.7 |
| 2011-05-18 | 18.63 |
| 2011-05-19 | 18.61 |
| 2011-05-20 | 18.72 |
| 2011-05-23 | 18.38 |
| 2011-05-24 | 18.39 |
| 2011-05-25 | 18.25 |
| 2011-05-26 | 18.38 |
| 2011-05-27 | 18.66 |
| 2011-05-30 | 18.71 |
| 2011-05-31 | 18.93 |
| 2011-06-01 | 19.04 |
| 2011-06-02 | 18.89 |
| 2011-06-03 | 18.8 |
| 2011-06-06 | 18.77 |
| 2011-06-07 | 18.87 |
| 2011-06-08 | 18.8 |
| 2011-06-09 | 18.78 |
| 2011-06-10 | 18.68 |
| 2011-06-13 | 18.68 |
| 2011-06-14 | 18.75 |
| 2011-06-15 | 18.59 |
| 2011-06-16 | 18.43 |
| 2011-06-17 | 18.32 |
| 2011-06-20 | 17.92 |
| 2011-06-21 | 17.96 |
| 2011-06-22 | 17.91 |
| 2011-06-23 | 18 |
| 2011-06-24 | 18.47 |
| 2011-06-27 | 18.68 |
| 2011-06-28 | 18.75 |
| 2011-06-29 | 18.91 |
| 2011-06-30 | 19.04 |
| 2011-07-01 | 19.03 |
| 2011-07-04 | 19.15 |
| 2011-07-05 | 19.1 |
| 2011-07-06 | 19.09 |
| 2011-07-07 | 19.39 |
| 2011-07-08 | 19.17 |
| 2011-07-11 | 19.02 |
| 2011-07-12 | 18.72 |
| 2011-07-13 | 18.92 |
| 2011-07-14 | 18.99 |
| 2011-07-15 | 18.93 |
| 2011-07-18 | 18.91 |
| 2011-07-19 | 19.02 |
| 2011-07-20 | 18.83 |
| 2011-07-21 | 18.73 |
| 2011-07-22 | 18.99 |
| 2011-07-25 | 19.11 |
| 2011-07-26 | 18.77 |
| 2011-07-27 | 18.67 |
| 2011-07-28 | 18.42 |
| 2011-07-29 | 18.29 |
| 2011-08-01 | 18.25 |
| 2011-08-02 | 18.06 |
| 2011-08-03 | 17.92 |
| 2011-08-04 | 17.74 |
| 2011-08-05 | 17.36 |
| 2011-08-08 | 17.07 |
| 2011-08-09 | 16.89 |
| 2011-08-10 | 17.19 |
| 2011-08-11 | 17.12 |
| 2011-08-12 | 16.94 |
| 2011-08-16 | 16.78 |
| 2011-08-17 | 16.83 |
| 2011-08-18 | 16.48 |
| 2011-08-19 | 16.2 |
| 2011-08-22 | 16.39 |
| 2011-08-23 | 16.55 |
| 2011-08-24 | 16.39 |
| 2011-08-25 | 16.22 |
| 2011-08-26 | 15.91 |
| 2011-08-29 | 16.46 |
| 2011-08-30 | 16.71 |
| 2011-09-02 | 16.89 |
| 2011-09-05 | 16.86 |
| 2011-09-06 | 16.98 |
| 2011-09-07 | 17.2 |
| 2011-09-08 | 17.27 |
| 2011-09-09 | 17 |
| 2011-09-12 | 16.64 |
| 2011-09-13 | 16.63 |
| 2011-09-14 | 16.81 |
| 2011-09-15 | 17 |
| 2011-09-16 | 17.03 |
| 2011-09-19 | 16.9 |
| 2011-09-20 | 17.19 |
| 2011-09-21 | 17.23 |
| 2011-09-22 | 16.58 |
| 2011-09-23 | 16.41 |
| 2011-09-26 | 16.25 |
| 2011-09-27 | 16.65 |
| 2011-09-28 | 16.55 |
| 2011-09-29 | 16.74 |
| 2011-09-30 | 16.55 |
| 2011-10-03 | 16.23 |
| 2011-10-04 | 15.99 |
| 2011-10-05 | 15.9 |
| 2011-10-07 | 16.28 |
| 2011-10-10 | 16.49 |
| 2011-10-11 | 16.51 |
| 2011-10-12 | 16.85 |
| 2011-10-13 | 16.81 |
| 2011-10-14 | 16.95 |
| 2011-10-17 | 16.92 |
| 2011-10-18 | 16.54 |
| 2011-10-19 | 16.82 |
| 2011-10-20 | 16.62 |
| 2011-10-21 | 16.48 |
| 2011-10-24 | 16.57 |
| 2011-10-25 | 16.78 |
| 2011-10-26 | 16.85 |
| 2011-10-28 | 17.32 |
| 2011-10-31 | 17.26 |
| 2011-11-01 | 17.65 |
| 2011-11-02 | 17.66 |
| 2011-11-03 | 17.69 |
| 2011-11-04 | 17.86 |
| 2011-11-08 | 17.8 |
| 2011-11-09 | 17.56 |
| 2011-11-11 | 17.57 |
| 2011-11-14 | 17.53 |
| 2011-11-15 | 17.26 |
| 2011-11-16 | 17.12 |
| 2011-11-17 | 16.81 |
| 2011-11-18 | 16.7 |
| 2011-11-21 | 16.33 |
| 2011-11-22 | 16.47 |
| 2011-11-23 | 16.12 |
| 2011-11-24 | 16.33 |
| 2011-11-25 | 16.24 |
| 2011-11-28 | 16.66 |
| 2011-11-29 | 16.51 |
| 2011-11-30 | 16.54 |
| 2011-12-01 | 16.82 |
| 2011-12-02 | 17.18 |
| 2011-12-05 | 17.17 |
| 2011-12-07 | 17.21 |
| 2011-12-08 | 16.83 |
| 2011-12-09 | 16.6 |
| 2011-12-12 | 16.26 |
| 2011-12-13 | 16.33 |
| 2011-12-14 | 16.2 |
| 2011-12-15 | 16.12 |
| 2011-12-16 | 15.81 |
| 2011-12-19 | 15.62 |
| 2011-12-20 | 15.36 |
| 2011-12-21 | 15.78 |
| 2011-12-22 | 15.93 |
| 2011-12-23 | 15.87 |
| 2011-12-26 | 16.05 |
| 2011-12-27 | 15.98 |
| 2011-12-28 | 15.83 |
| 2011-12-29 | 15.67 |
| 2011-12-30 | 15.62 |
| 2012-01-02 | 15.65 |
| 2012-01-03 | 16.07 |
| 2012-01-04 | 16.05 |
| 2012-01-05 | 16.05 |
| 2012-01-06 | 16.05 |
| 2012-01-07 | 16.06 |
| 2012-01-09 | 16.08 |
| 2012-01-10 | 16.44 |
| 2012-01-11 | 16.53 |
| 2012-01-12 | 16.5 |
| 2012-01-13 | 16.55 |
| 2012-01-16 | 16.57 |
| 2012-01-17 | 16.84 |
| 2012-01-18 | 16.77 |
| 2012-01-19 | 16.98 |
| 2012-01-20 | 17.07 |
| 2012-01-23 | 17.07 |
| 2012-01-24 | 17.3 |
| 2012-01-25 | 17.47 |
| 2012-01-27 | 17.62 |
| 2012-01-30 | 17.23 |
| 2012-01-31 | 17.61 |
| 2012-02-01 | 17.76 |
| 2012-02-02 | 17.91 |
| 2012-02-03 | 18.1 |
| 2012-02-06 | 18.3 |
| 2012-02-07 | 18.21 |
| 2012-02-08 | 18.36 |
| 2012-02-09 | 18.53 |
| 2012-02-10 | 18.23 |
| 2012-02-13 | 18.25 |
| 2012-02-14 | 18.33 |
| 2012-02-15 | 18.72 |
| 2012-02-16 | 18.77 |
| 2012-02-17 | 18.96 |
| 2012-02-21 | 19.11 |
| 2012-02-22 | 18.67 |
| 2012-02-23 | 18.66 |
| 2012-02-24 | 18.5 |
| 2012-02-27 | 17.98 |
| 2012-02-28 | 18.51 |
| 2012-02-29 | 18.59 |
| 2012-03-01 | 18.45 |
| 2012-03-02 | 18.5 |
| 2012-03-03 | 18.51 |
| 2012-03-05 | 18.25 |
| 2012-03-06 | 18.06 |
| 2012-03-07 | 18.04 |
| 2012-03-09 | 18.45 |
| 2012-03-12 | 18.53 |
| 2012-03-13 | 18.76 |
| 2012-03-14 | 18.87 |
| 2012-03-15 | 18.57 |
| 2012-03-16 | 18.36 |
| 2012-03-19 | 18.15 |
| 2012-03-20 | 18.23 |
| 2012-03-21 | 18.55 |
| 2012-03-22 | 18.1 |
| 2012-03-23 | 18.26 |
| 2012-03-26 | 17.95 |
| 2012-03-27 | 18.11 |
| 2012-03-28 | 17.94 |
| 2012-03-29 | 17.92 |
| 2012-03-30 | 18.34 |
| 2012-04-02 | 18.45 |
| 2012-04-03 | 18.61 |
| 2012-04-04 | 18.52 |
| 2012-04-09 | 18.23 |
| 2012-04-10 | 18.24 |
| 2012-04-11 | 18.16 |
| 2012-04-12 | 18.32 |
| 2012-04-13 | 18.05 |
| 2012-04-16 | 18.16 |
| 2012-04-17 | 18.36 |
| 2012-04-18 | 18.39 |
| 2012-04-19 | 18.43 |
| 2012-04-20 | 18.28 |
| 2012-04-23 | 17.97 |
| 2012-04-24 | 18 |
| 2012-04-25 | 17.92 |
| 2012-04-26 | 17.86 |
| 2012-04-27 | 17.81 |
| 2012-04-28 | 17.88 |
| 2012-04-30 | 18.01 |
| 2012-05-02 | 17.91 |
| 2012-05-03 | 17.73 |
| 2012-05-04 | 17.37 |
| 2012-05-07 | 17.51 |
| 2012-05-08 | 17.12 |
| 2012-05-09 | 16.96 |
| 2012-05-10 | 16.94 |
| 2012-05-11 | 16.81 |
| 2012-05-14 | 16.92 |
| 2012-05-15 | 17.01 |
| 2012-05-16 | 16.73 |
| 2012-05-17 | 16.77 |
| 2012-05-18 | 16.81 |
| 2012-05-21 | 16.7 |
| 2012-05-22 | 16.55 |
| 2012-05-23 | 16.46 |
| 2012-05-24 | 16.73 |
| 2012-05-25 | 16.76 |
| 2012-05-28 | 16.97 |
| 2012-05-29 | 16.99 |
| 2012-05-30 | 16.84 |
| 2012-05-31 | 16.8 |
| 2012-06-01 | 16.55 |
| 2012-06-04 | 16.26 |
| 2012-06-05 | 16.32 |
| 2012-06-06 | 16.64 |
| 2012-06-07 | 16.79 |
| 2012-06-08 | 16.73 |
| 2012-06-11 | 16.68 |
| 2012-06-12 | 16.85 |
| 2012-06-13 | 16.87 |
| 2012-06-14 | 16.64 |
| 2012-06-15 | 16.87 |
| 2012-06-18 | 16.66 |
| 2012-06-19 | 16.76 |
| 2012-06-20 | 16.85 |
| 2012-06-21 | 17.01 |
| 2012-06-22 | 16.96 |
| 2012-06-25 | 16.89 |
| 2012-06-26 | 16.92 |
| 2012-06-27 | 16.99 |
| 2012-06-28 | 17.01 |
| 2012-06-29 | 17.41 |
| 2012-07-02 | 17.45 |
| 2012-07-03 | 17.52 |
| 2012-07-04 | 17.59 |
| 2012-07-05 | 17.69 |
| 2012-07-06 | 17.63 |
| 2012-07-09 | 17.47 |
| 2012-07-10 | 17.69 |
| 2012-07-11 | 17.58 |
| 2012-07-12 | 17.39 |
| 2012-07-13 | 17.25 |
| 2012-07-16 | 17.13 |
| 2012-07-17 | 17.08 |
| 2012-07-18 | 17.15 |
| 2012-07-19 | 17.2 |
| 2012-07-20 | 17.12 |
| 2012-07-23 | 16.91 |
| 2012-07-24 | 16.89 |
| 2012-07-25 | 16.82 |
| 2012-07-26 | 16.59 |
| 2012-07-27 | 16.53 |
| 2012-07-30 | 16.84 |
| 2012-07-31 | 16.94 |
| 2012-08-01 | 17 |
| 2012-08-02 | 16.97 |
| 2012-08-03 | 16.96 |
| 2012-08-06 | 17.16 |
| 2012-08-07 | 17.3 |
| 2012-08-08 | 17.28 |
| 2012-08-09 | 17.22 |
| 2012-08-10 | 17.2 |
| 2012-08-13 | 17.37 |
| 2012-08-14 | 17.66 |
| 2012-08-16 | 17.68 |
| 2012-08-17 | 18.1 |
| 2012-08-21 | 18.3 |
| 2012-08-22 | 18.28 |
| 2012-08-23 | 18.28 |
| 2012-08-24 | 18.19 |
| 2012-08-27 | 18.11 |
| 2012-08-28 | 18.07 |
| 2012-08-29 | 17.93 |
| 2012-08-30 | 18.01 |
| 2012-08-31 | 17.85 |
| 2012-09-03 | 17.84 |
| 2012-09-04 | 17.93 |
| 2012-09-05 | 17.78 |
| 2012-09-06 | 17.83 |
| 2012-09-07 | 18.13 |
| 2012-09-08 | 18.2 |
| 2012-09-10 | 18.23 |
| 2012-09-11 | 18.33 |
| 2012-09-12 | 18.44 |
| 2012-09-13 | 18.45 |
| 2012-09-14 | 18.84 |
| 2012-09-17 | 18.99 |
| 2012-09-18 | 19.03 |
| 2012-09-20 | 18.89 |
| 2012-09-21 | 19.31 |
| 2012-09-24 | 19.29 |
| 2012-09-25 | 19.33 |
| 2012-09-26 | 19.32 |
| 2012-09-27 | 19.32 |
| 2012-09-28 | 19.3 |
| 2012-10-01 | 19.38 |
| 2012-10-03 | 19.45 |
| 2012-10-04 | 19.62 |
| 2012-10-05 | 19.49 |
| 2012-10-08 | 19.28 |
| 2012-10-09 | 19.38 |
| 2012-10-10 | 19.19 |
| 2012-10-11 | 19.38 |
| 2012-10-12 | 19.25 |
| 2012-10-15 | 19.27 |
| 2012-10-16 | 19.09 |
| 2012-10-17 | 19.1 |
| 2012-10-18 | 19.3 |
| 2012-10-19 | 19.15 |
| 2012-10-22 | 19.11 |
| 2012-10-23 | 18.98 |
| 2012-10-25 | 19 |
| 2012-10-26 | 18.75 |
| 2012-10-29 | 18.69 |
| 2012-10-30 | 18.45 |
| 2012-10-31 | 18.49 |
| 2012-11-01 | 18.56 |
| 2012-11-02 | 18.66 |
| 2012-11-05 | 18.67 |
| 2012-11-06 | 18.73 |
| 2012-11-07 | 18.82 |
| 2012-11-08 | 18.68 |
| 2012-11-09 | 18.11 |
| 2012-11-12 | 17.54 |
| 2012-11-13 | 17.53 |
| 2012-11-15 | 17.46 |
| 2012-11-16 | 17.28 |
| 2012-11-19 | 17.23 |
| 2012-11-20 | 17.19 |
| 2012-11-21 | 17.31 |
| 2012-11-22 | 17.36 |
| 2012-11-23 | 17.37 |
| 2012-11-26 | 17.43 |
| 2012-11-27 | 17.7 |
| 2012-11-29 | 17.97 |
| 2012-11-30 | 18.16 |
| 2012-12-03 | 18.22 |
| 2012-12-04 | 18.28 |
| 2012-12-05 | 18.32 |
| 2012-12-06 | 18.43 |
| 2012-12-07 | 18.37 |
| 2012-12-10 | 18.41 |
| 2012-12-11 | 18.35 |
| 2012-12-12 | 18.32 |
| 2012-12-13 | 18.18 |
| 2012-12-14 | 18.28 |
| 2012-12-17 | 18.27 |
| 2012-12-18 | 18.4 |
| 2012-12-19 | 18.51 |
| 2012-12-20 | 18.47 |
| 2012-12-21 | 18.24 |
| 2012-12-24 | 18.23 |
| 2012-12-26 | 18.37 |
| 2012-12-27 | 18.27 |
| 2012-12-28 | 18.4 |
| 2012-12-31 | 18.43 |
| 2013-01-01 | 18.6 |
| 2013-01-02 | 18.72 |
| 2013-01-03 | 18.79 |
| 2013-01-04 | 18.82 |
| 2013-01-07 | 18.77 |
| 2013-01-08 | 18.8 |
| 2013-01-09 | 18.71 |
| 2013-01-10 | 18.68 |
| 2013-01-11 | 18.56 |
| 2013-01-14 | 18.79 |
| 2013-01-15 | 18.85 |
| 2013-01-16 | 18.59 |
| 2013-01-17 | 18.68 |
| 2013-01-18 | 18.63 |
| 2013-01-21 | 18.6 |
| 2013-01-22 | 18.39 |
| 2013-01-23 | 18.36 |
| 2013-01-24 | 18.09 |
| 2013-01-25 | 18.29 |
| 2013-01-28 | 18.24 |
| 2013-01-29 | 18.15 |
| 2013-01-30 | 18.14 |
| 2013-01-31 | 18.05 |
| 2013-02-01 | 17.99 |
| 2013-02-04 | 17.95 |
| 2013-02-05 | 17.84 |
| 2013-02-06 | 17.87 |
| 2013-02-07 | 17.76 |
| 2013-02-08 | 17.63 |
| 2013-02-11 | 17.63 |
| 2013-02-12 | 17.7 |
| 2013-02-13 | 17.85 |
| 2013-02-14 | 17.75 |
| 2013-02-15 | 17.73 |
| 2013-02-18 | 17.8 |
| 2013-02-19 | 18.07 |
| 2013-02-20 | 18.15 |
| 2013-02-21 | 17.84 |
| 2013-02-22 | 17.85 |
| 2013-02-25 | 17.79 |
| 2013-02-26 | 17.5 |
| 2013-02-27 | 17.55 |
| 2013-02-28 | 17.21 |
| 2013-03-01 | 17.3 |
| 2013-03-04 | 17.2 |
| 2013-03-05 | 17.48 |
| 2013-03-06 | 17.6 |
| 2013-03-07 | 17.73 |
| 2013-03-08 | 17.96 |
| 2013-03-11 | 17.92 |
| 2013-03-12 | 17.83 |
| 2013-03-13 | 17.63 |
| 2013-03-14 | 17.79 |
| 2013-03-15 | 17.68 |
| 2013-03-18 | 17.58 |
| 2013-03-19 | 17.33 |
| 2013-03-20 | 17.12 |
| 2013-03-21 | 16.99 |
| 2013-03-22 | 16.96 |
| 2013-03-25 | 16.91 |
| 2013-03-26 | 16.92 |
| 2013-03-28 | 17.09 |
| 2013-04-01 | 17.17 |
| 2013-04-02 | 17.33 |
| 2013-04-03 | 17.14 |
| 2013-04-04 | 16.83 |
| 2013-04-05 | 16.79 |
| 2013-04-08 | 16.77 |
| 2013-04-09 | 16.63 |
| 2013-04-10 | 16.79 |
| 2013-04-11 | 16.87 |
| 2013-04-12 | 16.74 |
| 2013-04-15 | 16.83 |
| 2013-04-16 | 17.14 |
| 2013-04-17 | 17.06 |
| 2013-04-18 | 17.31 |
| 2013-04-22 | 17.49 |
| 2013-04-23 | 17.48 |
| 2013-04-25 | 17.68 |
| 2013-04-26 | 17.46 |
| 2013-04-29 | 17.54 |
| 2013-04-30 | 17.62 |
| 2013-05-02 | 17.8 |
| 2013-05-03 | 17.66 |
| 2013-05-06 | 17.77 |
| 2013-05-07 | 17.97 |
| 2013-05-08 | 18 |
| 2013-05-09 | 17.9 |
| 2013-05-10 | 17.97 |
| 2013-05-11 | 18.01 |
| 2013-05-13 | 17.62 |
| 2013-05-14 | 17.67 |
| 2013-05-15 | 18.08 |
| 2013-05-16 | 18.1 |
| 2013-05-17 | 18.17 |
| 2013-05-20 | 18.18 |
| 2013-05-21 | 18.06 |
| 2013-05-22 | 17.99 |
| 2013-05-23 | 17.63 |
| 2013-05-24 | 17.76 |
| 2013-05-27 | 18.04 |
| 2013-05-28 | 18.1 |
| 2013-05-29 | 18.15 |
| 2013-05-30 | 18.18 |
| 2013-05-31 | 17.82 |
| 2013-06-03 | 17.77 |
| 2013-06-04 | 17.75 |
| 2013-06-05 | 17.76 |
| 2013-06-06 | 17.85 |
| 2013-06-07 | 17.73 |
| 2013-06-10 | 17.79 |
| 2013-06-11 | 17.56 |
| 2013-06-12 | 17.45 |
| 2013-06-13 | 17.32 |
| 2013-06-14 | 17.63 |
| 2013-06-17 | 17.82 |
| 2013-06-18 | 17.57 |
| 2013-06-19 | 17.63 |
| 2013-06-20 | 17.18 |
| 2013-06-21 | 17.12 |
| 2013-06-24 | 16.86 |
| 2013-06-25 | 16.88 |
| 2013-06-26 | 16.82 |
| 2013-06-27 | 17.06 |
| 2013-06-28 | 17.52 |
| 2013-07-01 | 17.77 |
| 2013-07-02 | 17.65 |
| 2013-07-03 | 17.39 |
| 2013-07-04 | 17.56 |
| 2013-07-05 | 17.64 |
| 2013-07-08 | 17.51 |
| 2013-07-09 | 17.66 |
| 2013-07-10 | 17.55 |
| 2013-07-11 | 17.84 |
| 2013-07-12 | 18.02 |
| 2013-07-15 | 18.11 |
| 2013-07-16 | 17.88 |
| 2013-07-17 | 17.87 |
| 2013-07-18 | 18.07 |
| 2013-07-19 | 18.01 |
| 2013-07-22 | 18 |
| 2013-07-23 | 18.09 |
| 2013-07-24 | 17.79 |
| 2013-07-25 | 17.51 |
| 2013-07-26 | 17.39 |
| 2013-07-29 | 17.13 |
| 2013-07-30 | 16.87 |
| 2013-07-31 | 16.8 |
| 2013-08-01 | 16.72 |
| 2013-08-02 | 16.55 |
| 2013-08-05 | 16.61 |
| 2013-08-06 | 16.19 |
| 2013-08-07 | 16.18 |
| 2013-08-08 | 16.32 |
| 2013-08-12 | 16.46 |
| 2013-08-13 | 16.75 |
| 2013-08-14 | 16.86 |
| 2013-08-16 | 16.29 |
| 2013-08-19 | 15.33 |
| 2013-08-20 | 15.43 |
| 2013-08-21 | 15.17 |
| 2013-08-22 | 15.43 |
| 2013-08-23 | 15.6 |
| 2013-08-26 | 15.64 |
| 2013-08-27 | 15.16 |
| 2013-08-28 | 15.11 |
| 2013-08-29 | 15.43 |
| 2013-08-30 | 15.59 |
| 2013-09-02 | 15.81 |
| 2013-09-03 | 15.34 |
| 2013-09-04 | 15.61 |
| 2013-09-05 | 15.98 |
| 2013-09-06 | 16.19 |
| 2013-09-10 | 16.83 |
| 2013-09-11 | 16.92 |
| 2013-09-12 | 16.76 |
| 2013-09-13 | 16.78 |
| 2013-09-16 | 16.74 |
| 2013-09-17 | 16.76 |
| 2013-09-18 | 16.88 |
| 2013-09-19 | 17.45 |
| 2013-09-20 | 17.19 |
| 2013-09-23 | 16.9 |
| 2013-09-24 | 16.9 |
| 2013-09-25 | 16.88 |
| 2013-09-26 | 16.9 |
| 2013-09-27 | 16.68 |
| 2013-09-30 | 16.44 |
| 2013-10-01 | 16.56 |
| 2013-10-03 | 16.9 |
| 2013-10-04 | 16.91 |
| 2013-10-07 | 16.93 |
| 2013-10-08 | 16.99 |
| 2013-10-09 | 17.2 |
| 2013-10-10 | 17.25 |
| 2013-10-11 | 17.42 |
| 2013-10-14 | 17.48 |
| 2013-10-15 | 17.37 |
| 2013-10-17 | 17.19 |
| 2013-10-18 | 17.52 |
| 2013-10-21 | 17.61 |
| 2013-10-22 | 17.59 |
| 2013-10-23 | 17.46 |
| 2013-10-24 | 17.42 |
| 2013-10-25 | 17.32 |
| 2013-10-28 | 17.19 |
| 2013-10-29 | 17.53 |
| 2013-10-30 | 17.61 |
| 2013-10-31 | 17.78 |
| 2013-11-01 | 17.83 |
| 2013-11-03 | 17.9 |
| 2013-11-05 | 17.81 |
| 2013-11-06 | 17.76 |
| 2013-11-07 | 17.6 |
| 2013-11-08 | 17.54 |
| 2013-11-11 | 17.35 |
| 2013-11-12 | 17.19 |
| 2013-11-13 | 17.11 |
| 2013-11-14 | 17.43 |
| 2013-11-18 | 17.74 |
| 2013-11-19 | 17.93 |
| 2013-11-20 | 17.76 |
| 2013-11-21 | 17.43 |
| 2013-11-22 | 17.81 |
| 2013-11-25 | 18.06 |
| 2013-11-26 | 18 |
| 2013-11-27 | 18.08 |
| 2013-11-28 | 18.18 |
| 2013-11-29 | 18.42 |
| 2013-12-02 | 18.55 |
| 2013-12-03 | 18.52 |
| 2013-12-04 | 18.4 |
| 2013-12-05 | 18.59 |
| 2013-12-06 | 18.62 |
| 2013-12-09 | 18.88 |
| 2013-12-10 | 18.79 |
| 2013-12-11 | 18.72 |
| 2013-12-12 | 18.55 |
| 2013-12-13 | 18.34 |
| 2013-12-16 | 18.32 |
| 2013-12-17 | 18.36 |
| 2013-12-18 | 18.59 |
| 2013-12-19 | 18.47 |
| 2013-12-20 | 18.78 |
| 2013-12-23 | 18.85 |
| 2013-12-24 | 18.84 |
| 2013-12-26 | 18.88 |
| 2013-12-27 | 18.98 |
| 2013-12-30 | 18.92 |
| 2013-12-31 | 18.99 |
| 2014-01-01 | 19.02 |
| 2014-01-02 | 18.74 |
| 2014-01-03 | 18.74 |
| 2014-01-06 | 18.72 |
| 2014-01-07 | 18.63 |
| 2014-01-08 | 18.68 |
| 2014-01-09 | 18.63 |
| 2014-01-10 | 18.56 |
| 2014-01-13 | 18.79 |
| 2014-01-14 | 18.71 |
| 2014-01-15 | 18.9 |
| 2014-01-16 | 18.84 |
| 2014-01-17 | 18.63 |
| 2014-01-20 | 18.6 |
| 2014-01-21 | 18.64 |
| 2014-01-22 | 18.69 |
| 2014-01-23 | 18.72 |
| 2014-01-24 | 18.46 |
| 2014-01-27 | 18.02 |
| 2014-01-28 | 18 |
| 2014-01-29 | 17.99 |
| 2014-01-30 | 17.8 |
| 2014-01-31 | 17.89 |
| 2014-02-03 | 17.64 |
| 2014-02-04 | 17.66 |
| 2014-02-05 | 17.73 |
| 2014-02-06 | 17.56 |
| 2014-02-07 | 17.63 |
| 2014-02-10 | 17.64 |
| 2014-02-11 | 17.66 |
| 2014-02-12 | 17.71 |
| 2014-02-13 | 17.47 |
| 2014-02-14 | 17.58 |
| 2014-02-17 | 17.62 |
| 2014-02-18 | 17.91 |
| 2014-02-19 | 17.94 |
| 2014-02-20 | 17.8 |
| 2014-02-21 | 17.5 |
| 2014-02-24 | 17.59 |
| 2014-02-25 | 17.63 |
| 2014-02-26 | 17.71 |
| 2014-02-28 | 17.93 |
| 2014-03-03 | 17.81 |
| 2014-03-04 | 18.02 |
| 2014-03-05 | 18.13 |
| 2014-03-06 | 18.34 |
| 2014-03-07 | 18.62 |
| 2014-03-10 | 18.66 |
| 2014-03-11 | 18.59 |
| 2014-03-12 | 18.6 |
| 2014-03-13 | 18.52 |
| 2014-03-14 | 18.53 |
| 2014-03-18 | 18.62 |
| 2014-03-19 | 18.66 |
| 2014-03-20 | 18.56 |
| 2014-03-21 | 18.62 |
| 2014-03-22 | 18.64 |
| 2014-03-24 | 18.84 |
| 2014-03-25 | 18.89 |
| 2014-03-26 | 18.94 |
| 2014-03-27 | 19.06 |
| 2014-03-28 | 18.9 |
| 2014-03-31 | 18.98 |
| 2014-04-01 | 19.01 |
| 2014-04-02 | 19.16 |
| 2014-04-03 | 19.09 |
| 2014-04-04 | 19.02 |
| 2014-04-07 | 19.03 |
| 2014-04-09 | 19.32 |
| 2014-04-10 | 19.37 |
| 2014-04-11 | 19.33 |
| 2014-04-15 | 19.19 |
| 2014-04-16 | 19.01 |
| 2014-04-17 | 19.28 |
| 2014-04-21 | 19.4 |
| 2014-04-22 | 19.4 |
| 2014-04-23 | 19.46 |
| 2014-04-25 | 19.34 |
| 2014-04-28 | 19.31 |
| 2014-04-29 | 19.2 |
| 2014-04-30 | 19.06 |
| 2014-05-02 | 19.02 |
| 2014-05-05 | 18.93 |
| 2014-05-06 | 19 |
| 2014-05-07 | 18.86 |
| 2014-05-08 | 18.82 |
| 2014-05-09 | 19.34 |
| 2014-05-12 | 19.67 |
| 2014-05-13 | 19.92 |
| 2014-05-14 | 19.96 |
| 2014-05-15 | 19.94 |
| 2014-05-16 | 20.21 |
| 2014-05-19 | 20.57 |
| 2014-05-20 | 20.68 |
| 2014-05-21 | 20.61 |
| 2014-05-22 | 20.78 |
| 2014-05-23 | 21.07 |
| 2014-05-26 | 20.91 |
| 2014-05-27 | 20.74 |
| 2014-05-28 | 20.8 |
| 2014-05-29 | 20.41 |
| 2014-05-30 | 20.46 |
| 2014-06-02 | 20.84 |
| 2014-06-03 | 20.86 |
| 2014-06-04 | 20.93 |
| 2014-06-05 | 21.15 |
| 2014-06-06 | 21.57 |
| 2014-06-09 | 21.77 |
| 2014-06-10 | 21.79 |
| 2014-06-11 | 21.65 |
| 2014-06-12 | 21.76 |
| 2014-06-13 | 21.39 |
| 2014-06-16 | 21.4 |
| 2014-06-17 | 21.67 |
| 2014-06-18 | 21.47 |
| 2014-06-19 | 21.4 |
| 2014-06-20 | 21.25 |
| 2014-06-23 | 21.26 |
| 2014-06-24 | 21.52 |
| 2014-06-25 | 21.52 |
| 2014-06-26 | 21.35 |
| 2014-06-27 | 21.41 |
| 2014-06-30 | 21.74 |
| 2014-07-01 | 21.84 |
| 2014-07-02 | 22.12 |
| 2014-07-03 | 22.09 |
| 2014-07-04 | 22.16 |
| 2014-07-07 | 22.25 |
| 2014-07-08 | 21.65 |
| 2014-07-09 | 21.48 |
| 2014-07-10 | 21.47 |
| 2014-07-11 | 21.02 |
| 2014-07-14 | 21.05 |
| 2014-07-15 | 21.32 |
| 2014-07-16 | 21.6 |
| 2014-07-17 | 21.69 |
| 2014-07-18 | 21.65 |
| 2014-07-21 | 21.67 |
| 2014-07-22 | 21.81 |
| 2014-07-23 | 21.82 |
| 2014-07-24 | 21.89 |
| 2014-07-25 | 21.7 |
| 2014-07-28 | 21.57 |
| 2014-07-30 | 21.68 |
| 2014-07-31 | 21.47 |
| 2014-08-01 | 21.04 |
| 2014-08-04 | 21.25 |
| 2014-08-05 | 21.42 |
| 2014-08-06 | 21.21 |
| 2014-08-07 | 21.15 |
| 2014-08-08 | 20.81 |
| 2014-08-11 | 20.9 |
| 2014-08-12 | 20.94 |
| 2014-08-13 | 20.86 |
| 2014-08-14 | 20.92 |
| 2014-08-18 | 21.05 |
| 2014-08-19 | 21.16 |
| 2014-08-20 | 21.15 |
| 2014-08-21 | 21.28 |
| 2014-08-22 | 21.33 |
| 2014-08-25 | 21.24 |
| 2014-08-26 | 21.24 |
| 2014-08-27 | 21.33 |
| 2014-08-28 | 21.34 |
| 2014-09-01 | 21.61 |
| 2014-09-02 | 21.76 |
| 2014-09-03 | 21.88 |
| 2014-09-04 | 21.83 |
| 2014-09-05 | 21.82 |
| 2014-09-08 | 22.34 |
| 2014-09-09 | 22.34 |
| 2014-09-10 | 22.21 |
| 2014-09-11 | 22.26 |
| 2014-09-12 | 22.32 |
| 2014-09-15 | 22.21 |
| 2014-09-16 | 21.78 |
| 2014-09-17 | 21.88 |
| 2014-09-18 | 22.28 |
| 2014-09-19 | 21.84 |
| 2014-09-22 | 21.9 |
| 2014-09-23 | 21.52 |
| 2014-09-24 | 21.43 |
| 2014-09-25 | 21.11 |
| 2014-09-26 | 21.29 |
| 2014-09-29 | 21.34 |
| 2014-09-30 | 21.37 |
| 2014-10-01 | 21.31 |
| 2014-10-07 | 21.06 |
| 2014-10-08 | 21.04 |
| 2014-10-09 | 21.37 |
| 2014-10-10 | 21.08 |
| 2014-10-13 | 21.05 |
| 2014-10-14 | 21.01 |
| 2014-10-16 | 20.63 |
| 2014-10-17 | 20.72 |
| 2014-10-20 | 20.99 |
| 2014-10-21 | 21.08 |
| 2014-10-22 | 21.23 |
| 2014-10-23 | 21.32 |
| 2014-10-27 | 21.24 |
| 2014-10-28 | 21.3 |
| 2014-10-29 | 21.46 |
| 2014-10-30 | 21.61 |
| 2014-10-31 | 22 |
| 2014-11-03 | 22.04 |
| 2014-11-05 | 22.02 |
| 2014-11-07 | 21.86 |
| 2014-11-10 | 21.81 |
| 2014-11-11 | 21.87 |
| 2014-11-12 | 21.91 |
| 2014-11-13 | 21.83 |
| 2014-11-14 | 21.92 |
| 2014-11-17 | 22.04 |
| 2014-11-18 | 22.09 |
| 2014-11-19 | 21.94 |
| 2014-11-20 | 22.08 |
| 2014-11-21 | 22.17 |
| 2014-11-24 | 22.25 |
| 2014-11-25 | 22 |
| 2014-11-26 | 22.05 |
| 2014-11-27 | 22.12 |
| 2014-11-28 | 22.34 |
| 2014-12-01 | 22.27 |
| 2014-12-02 | 22.27 |
| 2014-12-03 | 22.4 |
| 2014-12-04 | 22.48 |
| 2014-12-05 | 22.38 |
| 2014-12-08 | 22.13 |
| 2014-12-09 | 21.84 |
| 2014-12-10 | 21.93 |
| 2014-12-11 | 21.77 |
| 2014-12-12 | 21.56 |
| 2014-12-15 | 21.51 |
| 2014-12-16 | 21.13 |
| 2014-12-17 | 21 |
| 2014-12-18 | 21.42 |
| 2014-12-19 | 21.57 |
| 2014-12-22 | 21.86 |
| 2014-12-23 | 21.73 |
| 2014-12-24 | 21.56 |
| 2014-12-26 | 21.63 |
| 2014-12-29 | 21.78 |
| 2014-12-30 | 21.83 |
| 2014-12-31 | 21.96 |
| 2015-01-01 | 22 |
| 2015-01-02 | 22.26 |
| 2015-01-05 | 22.23 |
| 2015-01-06 | 21.58 |
| 2015-01-07 | 21.54 |
| 2015-01-08 | 21.9 |
| 2015-01-09 | 21.99 |
| 2015-01-12 | 22.1 |
| 2015-01-13 | 22.05 |
| 2015-01-14 | 21.99 |
| 2015-01-15 | 22.48 |
| 2015-01-16 | 22.54 |
| 2015-01-19 | 22.61 |
| 2015-01-20 | 22.89 |
| 2015-01-21 | 22.93 |
| 2015-01-22 | 22.96 |
| 2015-01-23 | 23.15 |
| 2015-01-27 | 23.34 |
| 2015-01-28 | 23.37 |
| 2015-01-29 | 23.48 |
| 2015-01-30 | 23.16 |
| 2015-02-02 | 23.23 |
| 2015-02-03 | 23.11 |
| 2015-02-04 | 23.14 |
| 2015-02-05 | 23.39 |
| 2015-02-06 | 23.25 |
| 2015-02-09 | 23.26 |
| 2015-02-10 | 23.39 |
| 2015-02-11 | 23.77 |
| 2015-02-12 | 24.03 |
| 2015-02-13 | 24.25 |
| 2015-02-16 | 24.14 |
| 2015-02-18 | 24.6 |
| 2015-02-19 | 24.95 |
| 2015-02-20 | 24.74 |
| 2015-02-23 | 24.56 |
| 2015-02-24 | 24.56 |
| 2015-02-25 | 24.58 |
| 2015-02-26 | 24.34 |
| 2015-02-27 | 24.79 |
| 2015-02-28 | 24.92 |
| 2015-03-02 | 25.12 |
| 2015-03-03 | 25.28 |
| 2015-03-04 | 25.06 |
| 2015-03-05 | 25.13 |
| 2015-03-09 | 24.79 |
| 2015-03-10 | 24.68 |
| 2015-03-11 | 24.63 |
| 2015-03-12 | 24.9 |
| 2015-03-13 | 24.54 |
| 2015-03-16 | 24.47 |
| 2015-03-17 | 24.73 |
| 2015-03-18 | 24.67 |
| 2015-03-19 | 24.53 |
| 2015-03-20 | 24.29 |
| 2015-03-23 | 24.19 |
| 2015-03-24 | 24.16 |
| 2015-03-25 | 24.12 |
| 2015-03-26 | 23.68 |
| 2015-03-27 | 23.84 |
| 2015-03-30 | 24.27 |
| 2015-03-31 | 24.3 |
| 2015-04-01 | 24.58 |
| 2015-04-06 | 24.84 |
| 2015-04-07 | 24.9 |
| 2015-04-08 | 25.07 |
| 2015-04-09 | 25.21 |
| 2015-04-10 | 25.26 |
| 2015-04-13 | 25.41 |
| 2015-04-15 | 25.19 |
| 2015-04-16 | 25.06 |
| 2015-04-17 | 24.74 |
| 2015-04-20 | 24.28 |
| 2015-04-21 | 24.09 |
| 2015-04-22 | 24.2 |
| 2015-04-23 | 24.15 |
| 2015-04-24 | 23.9 |
| 2015-04-27 | 23.63 |
| 2015-04-28 | 23.88 |
| 2015-04-29 | 23.8 |
| 2015-04-30 | 23.62 |
| 2015-05-04 | 24.04 |
| 2015-05-05 | 24.07 |
| 2015-05-06 | 23.26 |
| 2015-05-07 | 23.03 |
| 2015-05-08 | 23.36 |
| 2015-05-11 | 23.85 |
| 2015-05-12 | 23.37 |
| 2015-05-13 | 23.65 |
| 2015-05-14 | 23.71 |
| 2015-05-15 | 23.82 |
| 2015-05-18 | 24.18 |
| 2015-05-19 | 24.18 |
| 2015-05-20 | 24.29 |
| 2015-05-21 | 24.29 |
| 2015-05-22 | 24.54 |
| 2015-05-25 | 24.28 |
| 2015-05-26 | 24.19 |
| 2015-05-27 | 24.2 |
| 2015-05-28 | 24.03 |
| 2015-05-29 | 24.42 |
| 2015-06-01 | 24.79 |
| 2015-06-02 | 24.26 |
| 2015-06-03 | 23.99 |
| 2015-06-04 | 24.05 |
| 2015-06-05 | 24.08 |
| 2015-06-08 | 23.76 |
| 2015-06-09 | 23.7 |
| 2015-06-10 | 23.98 |
| 2015-06-11 | 23.54 |
| 2015-06-12 | 23.57 |
| 2015-06-15 | 23.59 |
| 2015-06-16 | 23.69 |
| 2015-06-17 | 23.88 |
| 2015-06-18 | 24.11 |
| 2015-06-19 | 24.25 |
| 2015-06-22 | 24.63 |
| 2015-06-23 | 24.71 |
| 2015-06-24 | 24.62 |
| 2015-06-25 | 24.73 |
| 2015-06-26 | 24.7 |
| 2015-06-29 | 24.46 |
| 2015-06-30 | 24.65 |
| 2015-07-01 | 24.92 |
| 2015-07-02 | 24.96 |
| 2015-07-03 | 25.04 |
| 2015-07-06 | 25.18 |
| 2015-07-07 | 25.2 |
| 2015-07-08 | 24.81 |
| 2015-07-09 | 24.72 |
| 2015-07-10 | 24.79 |
| 2015-07-13 | 25.08 |
| 2015-07-14 | 25.1 |
| 2015-07-15 | 25.26 |
| 2015-07-16 | 25.51 |
| 2015-07-17 | 25.55 |
| 2015-07-20 | 25.58 |
| 2015-07-21 | 25.3 |
| 2015-07-22 | 25.58 |
| 2015-07-23 | 25.51 |
| 2015-07-24 | 25.32 |
| 2015-07-27 | 24.89 |
| 2015-07-28 | 24.69 |
| 2015-07-29 | 24.79 |
| 2015-07-30 | 24.93 |
| 2015-07-31 | 25.23 |
| 2015-08-03 | 25.34 |
| 2015-08-04 | 25.35 |
| 2015-08-05 | 25.56 |
| 2015-08-06 | 25.64 |
| 2015-08-07 | 25.56 |
| 2015-08-10 | 25.66 |
| 2015-08-11 | 25.66 |
| 2015-08-12 | 25.29 |
| 2015-08-13 | 25.27 |
| 2015-08-14 | 25.62 |
| 2015-08-17 | 25.68 |
| 2015-08-18 | 25.71 |
| 2015-08-19 | 25.79 |
| 2015-08-20 | 25.39 |
| 2015-08-21 | 25.19 |
| 2015-08-24 | 23.49 |
| 2015-08-25 | 23.78 |
| 2015-08-26 | 23.55 |
| 2015-08-27 | 24.08 |
| 2015-08-28 | 24.21 |
| 2015-08-31 | 24.12 |
| 2015-09-01 | 23.59 |
| 2015-09-02 | 23.42 |
| 2015-09-03 | 23.72 |
| 2015-09-04 | 23.22 |
| 2015-09-07 | 22.81 |
| 2015-09-08 | 23.11 |
| 2015-09-09 | 23.53 |
| 2015-09-10 | 23.46 |
| 2015-09-11 | 23.49 |
| 2015-09-14 | 23.75 |
| 2015-09-15 | 23.6 |
| 2015-09-16 | 23.71 |
| 2015-09-18 | 23.94 |
| 2015-09-21 | 23.97 |
| 2015-09-22 | 23.55 |
| 2015-09-23 | 23.64 |
| 2015-09-24 | 23.71 |
| 2015-09-28 | 23.26 |
| 2015-09-29 | 23.36 |
| 2015-09-30 | 23.69 |
| 2015-10-01 | 23.72 |
| 2015-10-05 | 24.2 |
| 2015-10-06 | 24.31 |
| 2015-10-07 | 24.37 |
| 2015-10-08 | 24.23 |
| 2015-10-09 | 24.35 |
| 2015-10-12 | 24.25 |
| 2015-10-13 | 23.88 |
| 2015-10-14 | 23.81 |
| 2015-10-15 | 23.97 |
| 2015-10-16 | 24.11 |
| 2015-10-19 | 24.2 |
| 2015-10-20 | 24.13 |
| 2015-10-21 | 24.1 |
| 2015-10-23 | 24.11 |
| 2015-10-26 | 24.01 |
| 2015-10-27 | 23.96 |
| 2015-10-28 | 23.8 |
| 2015-10-29 | 23.78 |
| 2015-10-30 | 23.67 |
| 2015-11-02 | 23.53 |
| 2015-11-03 | 23.6 |
| 2015-11-04 | 23.43 |
| 2015-11-05 | 23.1 |
| 2015-11-06 | 23.05 |
| 2015-11-09 | 23.02 |
| 2015-11-10 | 22.66 |
| 2015-11-11 | 22.83 |
| 2015-11-13 | 22.73 |
| 2015-11-16 | 22.88 |
| 2015-11-17 | 23.01 |
| 2015-11-18 | 22.75 |
| 2015-11-19 | 23.05 |
| 2015-11-20 | 23.15 |
| 2015-11-23 | 23.16 |
| 2015-11-24 | 23.13 |
| 2015-11-26 | 23.26 |
| 2015-11-27 | 23.41 |
| 2015-11-30 | 23.4 |
| 2015-12-01 | 23.49 |
| 2015-12-02 | 23.44 |
| 2015-12-03 | 23.27 |
| 2015-12-04 | 23.08 |
| 2015-12-07 | 23.05 |
| 2015-12-08 | 22.83 |
| 2015-12-09 | 22.52 |
| 2015-12-10 | 22.72 |
| 2015-12-11 | 22.52 |
| 2015-12-14 | 22.64 |
| 2015-12-15 | 22.79 |
| 2015-12-16 | 22.91 |
| 2015-12-17 | 23.21 |
| 2015-12-18 | 23.05 |
| 2015-12-21 | 23.25 |
| 2015-12-22 | 23.14 |
| 2015-12-23 | 23.34 |
| 2015-12-24 | 23.36 |
| 2015-12-28 | 23.51 |
| 2015-12-29 | 23.54 |
| 2015-12-30 | 23.47 |
| 2015-12-31 | 23.6 |
| 2016-01-04 | 23.27 |
| 2016-01-05 | 23.3 |
| 2016-01-06 | 23.19 |
| 2016-01-07 | 22.63 |
| 2016-01-08 | 22.78 |
| 2016-01-11 | 22.65 |
| 2016-01-12 | 22.49 |
| 2016-01-13 | 22.53 |
| 2016-01-14 | 22.42 |
| 2016-01-15 | 22.01 |
| 2016-01-18 | 21.6 |
| 2016-01-19 | 21.86 |
| 2016-01-20 | 21.48 |
| 2016-01-21 | 21.4 |
| 2016-01-22 | 21.78 |
| 2016-01-25 | 21.84 |
| 2016-01-27 | 21.88 |
| 2016-01-28 | 21.7 |
| 2016-01-29 | 22.08 |
| 2016-02-01 | 22.06 |
| 2016-02-02 | 21.93 |
| 2016-02-03 | 21.62 |
| 2016-02-04 | 21.66 |
| 2016-02-05 | 21.97 |
| 2016-02-08 | 21.7 |
| 2016-02-09 | 21.41 |
| 2016-02-10 | 20.76 |
| 2016-02-11 | 20.05 |
| 2016-02-12 | 20.02 |
| 2016-02-15 | 21.06 |
| 2016-02-16 | 20.69 |
| 2016-02-17 | 20.86 |
| 2016-02-18 | 21.08 |
| 2016-02-19 | 21.19 |
| 2016-02-22 | 21.27 |
| 2016-02-23 | 20.94 |
| 2016-02-24 | 20.69 |
| 2016-02-25 | 20.54 |
| 2016-02-26 | 20.7 |
| 2016-02-29 | 20.64 |
| 2016-03-01 | 21.31 |
| 2016-03-02 | 21.73 |
| 2016-03-03 | 22.01 |
| 2016-03-04 | 22.09 |
| 2016-03-08 | 22.07 |
| 2016-03-09 | 22.16 |
| 2016-03-10 | 22.05 |
| 2016-03-11 | 22.1 |
| 2016-03-14 | 22.21 |
| 2016-03-15 | 21.99 |
| 2016-03-16 | 22.06 |
| 2016-03-17 | 22.12 |
| 2016-03-18 | 22.35 |
| 2016-03-21 | 22.63 |
| 2016-03-22 | 22.67 |
| 2016-03-23 | 22.69 |
| 2016-03-28 | 22.38 |
| 2016-03-29 | 22.33 |
| 2016-03-30 | 22.74 |
| 2016-03-31 | 22.81 |
| 2016-04-01 | 23.01 |
| 2016-04-04 | 23.11 |
| 2016-04-05 | 22.68 |
| 2016-04-06 | 22.75 |
| 2016-04-07 | 22.57 |
| 2016-04-08 | 22.63 |
| 2016-04-11 | 22.93 |
| 2016-04-12 | 23.07 |
| 2016-04-13 | 23.45 |
| 2016-04-18 | 23.64 |
| 2016-04-20 | 23.6 |
| 2016-04-21 | 23.54 |
| 2016-04-22 | 23.51 |
| 2016-04-25 | 23.38 |
| 2016-04-26 | 23.58 |
| 2016-04-27 | 23.63 |
| 2016-04-28 | 23.27 |
| 2016-04-29 | 23.16 |
| 2016-05-02 | 23.05 |
| 2016-05-03 | 22.88 |
| 2016-05-04 | 22.71 |
| 2016-05-05 | 22.72 |
| 2016-05-06 | 22.71 |
| 2016-05-09 | 23.02 |
| 2016-05-10 | 23.06 |
| 2016-05-11 | 23.02 |
| 2016-05-12 | 23.19 |
| 2016-05-13 | 22.98 |
| 2016-05-16 | 23.34 |
| 2016-05-17 | 23.43 |
| 2016-05-18 | 23.44 |
| 2016-05-19 | 23.16 |
| 2016-05-20 | 23 |
| 2016-05-23 | 22.94 |
| 2016-05-24 | 23.31 |
| 2016-05-25 | 24.11 |
| 2016-05-26 | 24.54 |
| 2016-05-27 | 24.6 |
| 2016-05-30 | 25.03 |
| 2016-05-31 | 24.97 |
| 2016-06-01 | 25.3 |
| 2016-06-02 | 25.65 |
| 2016-06-03 | 25.63 |
| 2016-06-06 | 25.58 |
| 2016-06-07 | 25.55 |
| 2016-06-08 | 25.61 |
| 2016-06-09 | 25.45 |
| 2016-06-10 | 25.35 |
| 2016-06-13 | 25.18 |
| 2016-06-14 | 25.22 |
| 2016-06-15 | 25.48 |
| 2016-06-16 | 25.31 |
| 2016-06-17 | 25.4 |
| 2016-06-20 | 25.58 |
| 2016-06-21 | 25.56 |
| 2016-06-22 | 25.5 |
| 2016-06-23 | 25.65 |
| 2016-06-24 | 25.15 |
| 2016-06-27 | 25.25 |
| 2016-06-28 | 25.36 |
| 2016-06-29 | 25.62 |
| 2016-06-30 | 25.89 |
| 2016-07-01 | 26.07 |
| 2016-07-04 | 26.23 |
| 2016-07-05 | 26.15 |
| 2016-07-07 | 26.15 |
| 2016-07-08 | 26.11 |
| 2016-07-11 | 26.53 |
| 2016-07-12 | 26.66 |
| 2016-07-13 | 26.6 |
| 2016-07-14 | 26.8 |
| 2016-07-15 | 26.72 |
| 2016-07-18 | 26.6 |
| 2016-07-19 | 26.66 |
| 2016-07-20 | 26.82 |
| 2016-07-21 | 26.69 |
| 2016-07-22 | 26.84 |
| 2016-07-25 | 27.14 |
| 2016-07-26 | 27.01 |
| 2016-07-27 | 27.12 |
| 2016-07-28 | 27.19 |
| 2016-07-29 | 27.16 |
| 2016-08-01 | 27.18 |
| 2016-08-02 | 27.09 |
| 2016-08-03 | 26.8 |
| 2016-08-04 | 26.86 |
| 2016-08-05 | 27.29 |
| 2016-08-08 | 27.42 |
| 2016-08-09 | 27.31 |
| 2016-08-10 | 26.97 |
| 2016-08-11 | 27.01 |
| 2016-08-12 | 27.23 |
| 2016-08-16 | 27.2 |
| 2016-08-17 | 27.22 |
| 2016-08-18 | 27.39 |
| 2016-08-19 | 27.42 |
| 2016-08-22 | 27.29 |
| 2016-08-23 | 27.56 |
| 2016-08-24 | 27.66 |
| 2016-08-25 | 27.5 |
| 2016-08-26 | 27.59 |
| 2016-08-29 | 27.7 |
| 2016-08-30 | 28.13 |
| 2016-08-31 | 28.23 |
| 2016-09-01 | 28.17 |
| 2016-09-02 | 28.29 |
| 2016-09-06 | 28.7 |
| 2016-09-07 | 28.68 |
| 2016-09-08 | 28.82 |
| 2016-09-09 | 28.56 |
| 2016-09-12 | 28.01 |
| 2016-09-14 | 28.15 |
| 2016-09-15 | 28.17 |
| 2016-09-16 | 28.27 |
| 2016-09-19 | 28.37 |
| 2016-09-20 | 28.28 |
| 2016-09-21 | 28.31 |
| 2016-09-22 | 28.72 |
| 2016-09-23 | 28.56 |
| 2016-09-26 | 28.25 |
| 2016-09-27 | 28.21 |
| 2016-09-28 | 28.32 |
| 2016-09-29 | 27.6 |
| 2016-09-30 | 27.49 |
| 2016-10-03 | 28.04 |
| 2016-10-04 | 28.17 |
| 2016-10-05 | 27.6 |
| 2016-10-06 | 27.68 |
| 2016-10-07 | 27.64 |
| 2016-10-10 | 27.54 |
| 2016-10-13 | 27.26 |
| 2016-10-14 | 27.12 |
| 2016-10-17 | 27.13 |
| 2016-10-18 | 27.41 |
| 2016-10-19 | 27.57 |
| 2016-10-20 | 27.66 |
| 2016-10-21 | 27.45 |
| 2016-10-24 | 27.46 |
| 2016-10-25 | 27.47 |
| 2016-10-26 | 27.5 |
| 2016-10-27 | 27.39 |
| 2016-10-28 | 27.54 |
| 2016-10-30 | 27.57 |
| 2016-11-01 | 27.58 |
| 2016-11-02 | 27.14 |
| 2016-11-03 | 26.97 |
| 2016-11-04 | 26.65 |
| 2016-11-07 | 26.67 |
| 2016-11-08 | 26.4 |
| 2016-11-09 | 26.16 |
| 2016-11-10 | 26.43 |
| 2016-11-11 | 25.58 |
| 2016-11-15 | 24.73 |
| 2016-11-16 | 25 |
| 2016-11-17 | 24.86 |
| 2016-11-18 | 24.82 |
| 2016-11-21 | 24.37 |
| 2016-11-22 | 24.64 |
| 2016-11-23 | 24.79 |
| 2016-11-24 | 24.55 |
| 2016-11-25 | 24.84 |
| 2016-11-28 | 24.92 |
| 2016-11-29 | 24.86 |
| 2016-11-30 | 25.09 |
| 2016-12-01 | 24.95 |
| 2016-12-02 | 24.58 |
| 2016-12-05 | 24.68 |
| 2016-12-06 | 24.91 |
| 2016-12-07 | 24.63 |
| 2016-12-08 | 25.23 |
| 2016-12-09 | 25.28 |
| 2016-12-12 | 24.86 |
| 2016-12-13 | 25 |
| 2016-12-14 | 24.86 |
| 2016-12-15 | 24.84 |
| 2016-12-16 | 24.8 |
| 2016-12-19 | 24.72 |
| 2016-12-20 | 24.59 |
| 2016-12-21 | 24.53 |
| 2016-12-22 | 24.49 |
| 2016-12-23 | 24.7 |
| 2016-12-26 | 24.54 |
| 2016-12-27 | 24.94 |
| 2016-12-28 | 25 |
| 2016-12-29 | 25.25 |
| 2016-12-30 | 25.3 |
| 2017-01-02 | 25.51 |
| 2017-01-03 | 25.64 |
| 2017-01-04 | 25.5 |
| 2017-01-05 | 25.77 |
| 2017-01-06 | 25.69 |
| 2017-01-09 | 25.69 |
| 2017-01-10 | 26.01 |
| 2017-01-11 | 26.11 |
| 2017-01-12 | 26.17 |
| 2017-01-13 | 26.16 |
| 2017-01-16 | 26.22 |
| 2017-01-17 | 26.13 |
| 2017-01-18 | 26.17 |
| 2017-01-19 | 26.24 |
| 2017-01-20 | 26.07 |
| 2017-01-23 | 26.17 |
| 2017-01-24 | 26.32 |
| 2017-01-25 | 26.66 |
| 2017-01-27 | 26.76 |
| 2017-01-30 | 26.76 |
| 2017-01-31 | 26.57 |
| 2017-02-01 | 27.05 |
| 2017-02-02 | 26.89 |
| 2017-02-03 | 26.77 |
| 2017-02-06 | 26.97 |
| 2017-02-07 | 26.85 |
| 2017-02-08 | 26.86 |
| 2017-02-09 | 26.89 |
| 2017-02-10 | 26.89 |
| 2017-02-13 | 26.52 |
| 2017-02-14 | 26.39 |
| 2017-02-15 | 26.08 |
| 2017-02-16 | 26.43 |
| 2017-02-17 | 26.44 |
| 2017-02-20 | 26.64 |
| 2017-02-21 | 26.76 |
| 2017-02-22 | 26.7 |
| 2017-02-23 | 26.72 |
| 2017-02-27 | 26.61 |
| 2017-02-28 | 26.57 |
| 2017-03-01 | 26.73 |
| 2017-03-02 | 26.46 |
| 2017-03-03 | 26.48 |
| 2017-03-06 | 26.65 |
| 2017-03-07 | 26.62 |
| 2017-03-08 | 26.53 |
| 2017-03-09 | 26.53 |
| 2017-03-10 | 26.45 |
| 2017-03-14 | 26.94 |
| 2017-03-15 | 27.01 |
| 2017-03-16 | 27.21 |
| 2017-03-17 | 27.23 |
| 2017-03-20 | 27.18 |
| 2017-03-21 | 27.14 |
| 2017-03-22 | 26.87 |
| 2017-03-23 | 27.06 |
| 2017-03-24 | 27.13 |
| 2017-03-27 | 26.99 |
| 2017-03-28 | 27.15 |
| 2017-03-29 | 27.27 |
| 2017-03-30 | 27.38 |
| 2017-03-31 | 26.82 |
| 2017-04-03 | 27.02 |
| 2017-04-05 | 27.16 |
| 2017-04-06 | 27.15 |
| 2017-04-07 | 26.99 |
| 2017-04-10 | 27.01 |
| 2017-04-11 | 27.2 |
| 2017-04-12 | 27.1 |
| 2017-04-13 | 26.99 |
| 2017-04-17 | 26.98 |
| 2017-04-18 | 26.85 |
| 2017-04-19 | 26.91 |
| 2017-04-20 | 27.05 |
| 2017-04-21 | 27.03 |
| 2017-04-24 | 27.34 |
| 2017-04-25 | 27.6 |
| 2017-04-26 | 27.64 |
| 2017-04-27 | 27.61 |
| 2017-04-28 | 27.59 |
| 2017-05-02 | 27.64 |
| 2017-05-03 | 27.63 |
| 2017-05-04 | 27.76 |
| 2017-05-05 | 27.52 |
| 2017-05-08 | 27.63 |
| 2017-05-09 | 27.68 |
| 2017-05-10 | 27.94 |
| 2017-05-11 | 28.02 |
| 2017-05-12 | 27.92 |
| 2017-05-15 | 28.12 |
| 2017-05-16 | 28.31 |
| 2017-05-17 | 29.09 |
| 2017-05-18 | 28.68 |
| 2017-05-19 | 28.6 |
| 2017-05-22 | 28.08 |
| 2017-05-23 | 27.81 |
| 2017-05-24 | 27.61 |
| 2017-05-25 | 27.77 |
| 2017-05-26 | 28.01 |
| 2017-05-29 | 27.7 |
| 2017-05-30 | 27.84 |
| 2017-05-31 | 27.92 |
| 2017-06-01 | 27.96 |
| 2017-06-02 | 28.1 |
| 2017-06-05 | 28.16 |
| 2017-06-06 | 28 |
| 2017-06-07 | 28.15 |
| 2017-06-08 | 28.15 |
| 2017-06-09 | 28.14 |
| 2017-06-12 | 27.92 |
| 2017-06-13 | 28.2 |
| 2017-06-14 | 28.24 |
| 2017-06-15 | 28.15 |
| 2017-06-16 | 27.68 |
| 2017-06-19 | 28.12 |
| 2017-06-20 | 28.12 |
| 2017-06-21 | 27.92 |
| 2017-06-22 | 28.02 |
| 2017-06-23 | 27.8 |
| 2017-06-27 | 27.57 |
| 2017-06-28 | 27.55 |
| 2017-06-29 | 27.62 |
| 2017-06-30 | 27.72 |
| 2017-07-03 | 28.01 |
| 2017-07-04 | 27.99 |
| 2017-07-05 | 28.12 |
| 2017-07-06 | 28.22 |
| 2017-07-07 | 28.22 |
| 2017-07-10 | 28.48 |
| 2017-07-11 | 28.44 |
| 2017-07-12 | 28.58 |
| 2017-07-13 | 28.78 |
| 2017-07-14 | 28.73 |
| 2017-07-17 | 28.77 |
| 2017-07-18 | 28.67 |
| 2017-07-19 | 28.91 |
| 2017-07-20 | 28.84 |
| 2017-07-21 | 28.93 |
| 2017-07-24 | 29.04 |
| 2017-07-25 | 29.07 |
| 2017-07-26 | 29.18 |
| 2017-07-27 | 29.12 |
| 2017-07-28 | 29.2 |
| 2017-07-31 | 29.33 |
| 2017-08-01 | 29.42 |
| 2017-08-02 | 29.31 |
| 2017-08-03 | 29.2 |
| 2017-08-04 | 29.32 |
| 2017-08-07 | 29.47 |
| 2017-08-08 | 29.23 |
| 2017-08-09 | 28.93 |
| 2017-08-10 | 28.58 |
| 2017-08-11 | 28.22 |
| 2017-08-14 | 28.6 |
| 2017-08-16 | 28.92 |
| 2017-08-17 | 28.94 |
| 2017-08-18 | 28.8 |
| 2017-08-21 | 28.73 |
| 2017-08-22 | 29.08 |
| 2017-08-23 | 29.2 |
| 2017-08-24 | 29.32 |
| 2017-08-28 | 29.55 |
| 2017-08-29 | 29.21 |
| 2017-08-30 | 29.52 |
| 2017-08-31 | 29.63 |
| 2017-09-01 | 30.19 |
| 2017-09-04 | 29.85 |
| 2017-09-05 | 29.98 |
| 2017-09-06 | 30.09 |
| 2017-09-07 | 30.01 |
| 2017-09-08 | 29.99 |
| 2017-09-11 | 30.22 |
| 2017-09-12 | 30.57 |
| 2017-09-13 | 30.33 |
| 2017-09-14 | 30.39 |
| 2017-09-15 | 30.4 |
| 2017-09-18 | 30.6 |
| 2017-09-19 | 30.62 |
| 2017-09-20 | 30.57 |
| 2017-09-21 | 30.66 |
| 2017-09-22 | 30.08 |
| 2017-09-25 | 29.74 |
| 2017-09-26 | 29.8 |
| 2017-09-27 | 29.42 |
| 2017-09-28 | 29.55 |
| 2017-09-29 | 29.58 |
| 2017-10-03 | 29.8 |
| 2017-10-04 | 29.95 |
| 2017-10-05 | 29.92 |
| 2017-10-06 | 30.2 |
| 2017-10-09 | 30.23 |
| 2017-10-10 | 30.36 |
| 2017-10-11 | 30.22 |
| 2017-10-12 | 30.57 |
| 2017-10-13 | 30.73 |
| 2017-10-16 | 30.9 |
| 2017-10-17 | 30.92 |
| 2017-10-18 | 30.84 |
| 2017-10-19 | 30.68 |
| 2017-10-23 | 30.78 |
| 2017-10-24 | 30.8 |
| 2017-10-25 | 31.01 |
| 2017-10-26 | 31.14 |
| 2017-10-27 | 31.11 |
| 2017-10-30 | 31.37 |
| 2017-10-31 | 31.05 |
| 2017-11-01 | 31.16 |
| 2017-11-02 | 31.34 |
| 2017-11-03 | 31.56 |
| 2017-11-06 | 31.54 |
| 2017-11-07 | 31.2 |
| 2017-11-08 | 30.99 |
| 2017-11-09 | 31.1 |
| 2017-11-10 | 31.24 |
| 2017-11-13 | 30.85 |
| 2017-11-14 | 30.76 |
| 2017-11-15 | 30.5 |
| 2017-11-16 | 30.8 |
| 2017-11-17 | 31.05 |
| 2017-11-20 | 31.14 |
| 2017-11-21 | 31.17 |
| 2017-11-22 | 31.45 |
| 2017-11-23 | 31.52 |
| 2017-11-24 | 31.69 |
| 2017-11-27 | 31.75 |
| 2017-11-28 | 31.78 |
| 2017-11-29 | 31.75 |
| 2017-11-30 | 31.44 |